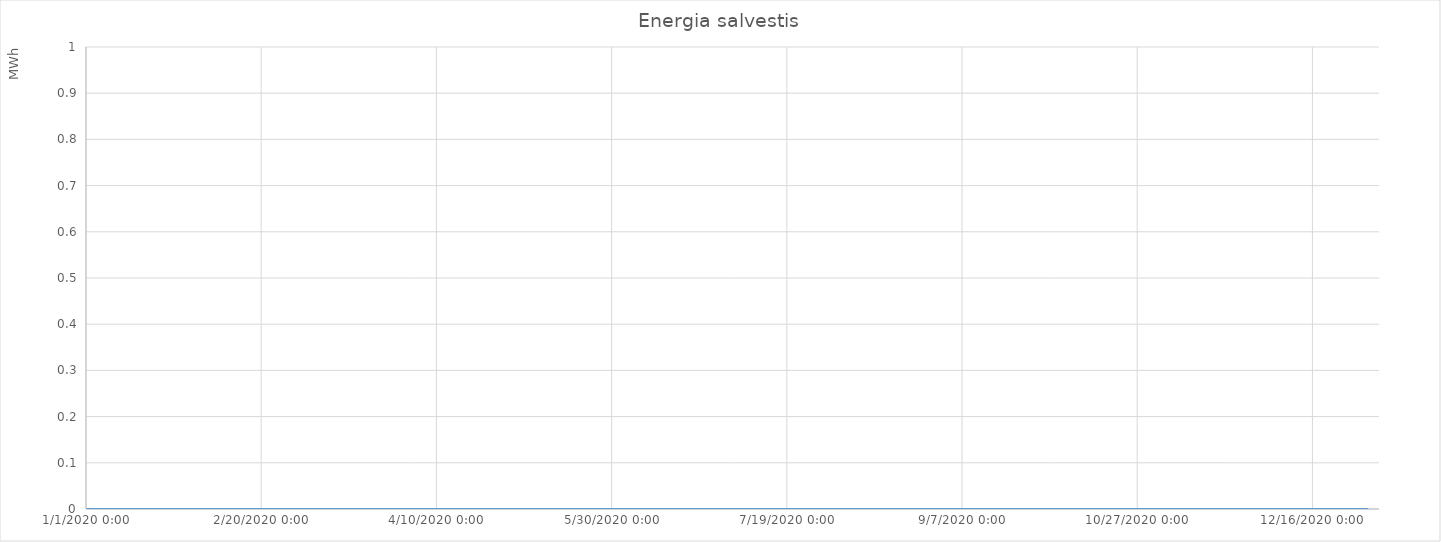
| Category | Series 0 |
|---|---|
| 43831.0 | 0 |
| 43831.041666666664 | 0 |
| 43831.083333333336 | 0 |
| 43831.125 | 0 |
| 43831.166666666664 | 0 |
| 43831.208333333336 | 0 |
| 43831.25 | 0 |
| 43831.291666666664 | 0 |
| 43831.333333333336 | 0 |
| 43831.375 | 0 |
| 43831.416666666664 | 0 |
| 43831.458333333336 | 0 |
| 43831.5 | 0 |
| 43831.541666666664 | 0 |
| 43831.583333333336 | 0 |
| 43831.625 | 0 |
| 43831.666666666664 | 0 |
| 43831.708333333336 | 0 |
| 43831.75 | 0 |
| 43831.791666666664 | 0 |
| 43831.833333333336 | 0 |
| 43831.875 | 0 |
| 43831.916666666664 | 0 |
| 43831.958333333336 | 0 |
| 43832.0 | 0 |
| 43832.041666666664 | 0 |
| 43832.083333333336 | 0 |
| 43832.125 | 0 |
| 43832.166666666664 | 0 |
| 43832.208333333336 | 0 |
| 43832.25 | 0 |
| 43832.291666666664 | 0 |
| 43832.333333333336 | 0 |
| 43832.375 | 0 |
| 43832.416666666664 | 0 |
| 43832.458333333336 | 0 |
| 43832.5 | 0 |
| 43832.541666666664 | 0 |
| 43832.583333333336 | 0 |
| 43832.625 | 0 |
| 43832.666666666664 | 0 |
| 43832.708333333336 | 0 |
| 43832.75 | 0 |
| 43832.791666666664 | 0 |
| 43832.833333333336 | 0 |
| 43832.875 | 0 |
| 43832.916666666664 | 0 |
| 43832.958333333336 | 0 |
| 43833.0 | 0 |
| 43833.041666666664 | 0 |
| 43833.083333333336 | 0 |
| 43833.125 | 0 |
| 43833.166666666664 | 0 |
| 43833.208333333336 | 0 |
| 43833.25 | 0 |
| 43833.291666666664 | 0 |
| 43833.333333333336 | 0 |
| 43833.375 | 0 |
| 43833.416666666664 | 0 |
| 43833.458333333336 | 0 |
| 43833.5 | 0 |
| 43833.541666666664 | 0 |
| 43833.583333333336 | 0 |
| 43833.625 | 0 |
| 43833.666666666664 | 0 |
| 43833.708333333336 | 0 |
| 43833.75 | 0 |
| 43833.791666666664 | 0 |
| 43833.833333333336 | 0 |
| 43833.875 | 0 |
| 43833.916666666664 | 0 |
| 43833.958333333336 | 0 |
| 43834.0 | 0 |
| 43834.041666666664 | 0 |
| 43834.083333333336 | 0 |
| 43834.125 | 0 |
| 43834.166666666664 | 0 |
| 43834.208333333336 | 0 |
| 43834.25 | 0 |
| 43834.291666666664 | 0 |
| 43834.333333333336 | 0 |
| 43834.375 | 0 |
| 43834.416666666664 | 0 |
| 43834.458333333336 | 0 |
| 43834.5 | 0 |
| 43834.541666666664 | 0 |
| 43834.583333333336 | 0 |
| 43834.625 | 0 |
| 43834.666666666664 | 0 |
| 43834.708333333336 | 0 |
| 43834.75 | 0 |
| 43834.791666666664 | 0 |
| 43834.833333333336 | 0 |
| 43834.875 | 0 |
| 43834.916666666664 | 0 |
| 43834.958333333336 | 0 |
| 43835.0 | 0 |
| 43835.041666666664 | 0 |
| 43835.083333333336 | 0 |
| 43835.125 | 0 |
| 43835.166666666664 | 0 |
| 43835.208333333336 | 0 |
| 43835.25 | 0 |
| 43835.291666666664 | 0 |
| 43835.333333333336 | 0 |
| 43835.375 | 0 |
| 43835.416666666664 | 0 |
| 43835.458333333336 | 0 |
| 43835.5 | 0 |
| 43835.541666666664 | 0 |
| 43835.583333333336 | 0 |
| 43835.625 | 0 |
| 43835.666666666664 | 0 |
| 43835.708333333336 | 0 |
| 43835.75 | 0 |
| 43835.791666666664 | 0 |
| 43835.833333333336 | 0 |
| 43835.875 | 0 |
| 43835.916666666664 | 0 |
| 43835.958333333336 | 0 |
| 43836.0 | 0 |
| 43836.041666666664 | 0 |
| 43836.083333333336 | 0 |
| 43836.125 | 0 |
| 43836.166666666664 | 0 |
| 43836.208333333336 | 0 |
| 43836.25 | 0 |
| 43836.291666666664 | 0 |
| 43836.333333333336 | 0 |
| 43836.375 | 0 |
| 43836.416666666664 | 0 |
| 43836.458333333336 | 0 |
| 43836.5 | 0 |
| 43836.541666666664 | 0 |
| 43836.583333333336 | 0 |
| 43836.625 | 0 |
| 43836.666666666664 | 0 |
| 43836.708333333336 | 0 |
| 43836.75 | 0 |
| 43836.791666666664 | 0 |
| 43836.833333333336 | 0 |
| 43836.875 | 0 |
| 43836.916666666664 | 0 |
| 43836.958333333336 | 0 |
| 43837.0 | 0 |
| 43837.041666666664 | 0 |
| 43837.083333333336 | 0 |
| 43837.125 | 0 |
| 43837.166666666664 | 0 |
| 43837.208333333336 | 0 |
| 43837.25 | 0 |
| 43837.291666666664 | 0 |
| 43837.333333333336 | 0 |
| 43837.375 | 0 |
| 43837.416666666664 | 0 |
| 43837.458333333336 | 0 |
| 43837.5 | 0 |
| 43837.541666666664 | 0 |
| 43837.583333333336 | 0 |
| 43837.625 | 0 |
| 43837.666666666664 | 0 |
| 43837.708333333336 | 0 |
| 43837.75 | 0 |
| 43837.791666666664 | 0 |
| 43837.833333333336 | 0 |
| 43837.875 | 0 |
| 43837.916666666664 | 0 |
| 43837.958333333336 | 0 |
| 43838.0 | 0 |
| 43838.041666666664 | 0 |
| 43838.083333333336 | 0 |
| 43838.125 | 0 |
| 43838.166666666664 | 0 |
| 43838.208333333336 | 0 |
| 43838.25 | 0 |
| 43838.291666666664 | 0 |
| 43838.333333333336 | 0 |
| 43838.375 | 0 |
| 43838.416666666664 | 0 |
| 43838.458333333336 | 0 |
| 43838.5 | 0 |
| 43838.541666666664 | 0 |
| 43838.583333333336 | 0 |
| 43838.625 | 0 |
| 43838.666666666664 | 0 |
| 43838.708333333336 | 0 |
| 43838.75 | 0 |
| 43838.791666666664 | 0 |
| 43838.833333333336 | 0 |
| 43838.875 | 0 |
| 43838.916666666664 | 0 |
| 43838.958333333336 | 0 |
| 43839.0 | 0 |
| 43839.041666666664 | 0 |
| 43839.083333333336 | 0 |
| 43839.125 | 0 |
| 43839.166666666664 | 0 |
| 43839.208333333336 | 0 |
| 43839.25 | 0 |
| 43839.291666666664 | 0 |
| 43839.333333333336 | 0 |
| 43839.375 | 0 |
| 43839.416666666664 | 0 |
| 43839.458333333336 | 0 |
| 43839.5 | 0 |
| 43839.541666666664 | 0 |
| 43839.583333333336 | 0 |
| 43839.625 | 0 |
| 43839.666666666664 | 0 |
| 43839.708333333336 | 0 |
| 43839.75 | 0 |
| 43839.791666666664 | 0 |
| 43839.833333333336 | 0 |
| 43839.875 | 0 |
| 43839.916666666664 | 0 |
| 43839.958333333336 | 0 |
| 43840.0 | 0 |
| 43840.041666666664 | 0 |
| 43840.083333333336 | 0 |
| 43840.125 | 0 |
| 43840.166666666664 | 0 |
| 43840.208333333336 | 0 |
| 43840.25 | 0 |
| 43840.291666666664 | 0 |
| 43840.333333333336 | 0 |
| 43840.375 | 0 |
| 43840.416666666664 | 0 |
| 43840.458333333336 | 0 |
| 43840.5 | 0 |
| 43840.541666666664 | 0 |
| 43840.583333333336 | 0 |
| 43840.625 | 0 |
| 43840.666666666664 | 0 |
| 43840.708333333336 | 0 |
| 43840.75 | 0 |
| 43840.791666666664 | 0 |
| 43840.833333333336 | 0 |
| 43840.875 | 0 |
| 43840.916666666664 | 0 |
| 43840.958333333336 | 0 |
| 43841.0 | 0 |
| 43841.041666666664 | 0 |
| 43841.083333333336 | 0 |
| 43841.125 | 0 |
| 43841.166666666664 | 0 |
| 43841.208333333336 | 0 |
| 43841.25 | 0 |
| 43841.291666666664 | 0 |
| 43841.333333333336 | 0 |
| 43841.375 | 0 |
| 43841.416666666664 | 0 |
| 43841.458333333336 | 0 |
| 43841.5 | 0 |
| 43841.541666666664 | 0 |
| 43841.583333333336 | 0 |
| 43841.625 | 0 |
| 43841.666666666664 | 0 |
| 43841.708333333336 | 0 |
| 43841.75 | 0 |
| 43841.791666666664 | 0 |
| 43841.833333333336 | 0 |
| 43841.875 | 0 |
| 43841.916666666664 | 0 |
| 43841.958333333336 | 0 |
| 43842.0 | 0 |
| 43842.041666666664 | 0 |
| 43842.083333333336 | 0 |
| 43842.125 | 0 |
| 43842.166666666664 | 0 |
| 43842.208333333336 | 0 |
| 43842.25 | 0 |
| 43842.291666666664 | 0 |
| 43842.333333333336 | 0 |
| 43842.375 | 0 |
| 43842.416666666664 | 0 |
| 43842.458333333336 | 0 |
| 43842.5 | 0 |
| 43842.541666666664 | 0 |
| 43842.583333333336 | 0 |
| 43842.625 | 0 |
| 43842.666666666664 | 0 |
| 43842.708333333336 | 0 |
| 43842.75 | 0 |
| 43842.791666666664 | 0 |
| 43842.833333333336 | 0 |
| 43842.875 | 0 |
| 43842.916666666664 | 0 |
| 43842.958333333336 | 0 |
| 43843.0 | 0 |
| 43843.041666666664 | 0 |
| 43843.083333333336 | 0 |
| 43843.125 | 0 |
| 43843.166666666664 | 0 |
| 43843.208333333336 | 0 |
| 43843.25 | 0 |
| 43843.291666666664 | 0 |
| 43843.333333333336 | 0 |
| 43843.375 | 0 |
| 43843.416666666664 | 0 |
| 43843.458333333336 | 0 |
| 43843.5 | 0 |
| 43843.541666666664 | 0 |
| 43843.583333333336 | 0 |
| 43843.625 | 0 |
| 43843.666666666664 | 0 |
| 43843.708333333336 | 0 |
| 43843.75 | 0 |
| 43843.791666666664 | 0 |
| 43843.833333333336 | 0 |
| 43843.875 | 0 |
| 43843.916666666664 | 0 |
| 43843.958333333336 | 0 |
| 43844.0 | 0 |
| 43844.041666666664 | 0 |
| 43844.083333333336 | 0 |
| 43844.125 | 0 |
| 43844.166666666664 | 0 |
| 43844.208333333336 | 0 |
| 43844.25 | 0 |
| 43844.291666666664 | 0 |
| 43844.333333333336 | 0 |
| 43844.375 | 0 |
| 43844.416666666664 | 0 |
| 43844.458333333336 | 0 |
| 43844.5 | 0 |
| 43844.541666666664 | 0 |
| 43844.583333333336 | 0 |
| 43844.625 | 0 |
| 43844.666666666664 | 0 |
| 43844.708333333336 | 0 |
| 43844.75 | 0 |
| 43844.791666666664 | 0 |
| 43844.833333333336 | 0 |
| 43844.875 | 0 |
| 43844.916666666664 | 0 |
| 43844.958333333336 | 0 |
| 43845.0 | 0 |
| 43845.041666666664 | 0 |
| 43845.083333333336 | 0 |
| 43845.125 | 0 |
| 43845.166666666664 | 0 |
| 43845.208333333336 | 0 |
| 43845.25 | 0 |
| 43845.291666666664 | 0 |
| 43845.333333333336 | 0 |
| 43845.375 | 0 |
| 43845.416666666664 | 0 |
| 43845.458333333336 | 0 |
| 43845.5 | 0 |
| 43845.541666666664 | 0 |
| 43845.583333333336 | 0 |
| 43845.625 | 0 |
| 43845.666666666664 | 0 |
| 43845.708333333336 | 0 |
| 43845.75 | 0 |
| 43845.791666666664 | 0 |
| 43845.833333333336 | 0 |
| 43845.875 | 0 |
| 43845.916666666664 | 0 |
| 43845.958333333336 | 0 |
| 43846.0 | 0 |
| 43846.041666666664 | 0 |
| 43846.083333333336 | 0 |
| 43846.125 | 0 |
| 43846.166666666664 | 0 |
| 43846.208333333336 | 0 |
| 43846.25 | 0 |
| 43846.291666666664 | 0 |
| 43846.333333333336 | 0 |
| 43846.375 | 0 |
| 43846.416666666664 | 0 |
| 43846.458333333336 | 0 |
| 43846.5 | 0 |
| 43846.541666666664 | 0 |
| 43846.583333333336 | 0 |
| 43846.625 | 0 |
| 43846.666666666664 | 0 |
| 43846.708333333336 | 0 |
| 43846.75 | 0 |
| 43846.791666666664 | 0 |
| 43846.833333333336 | 0 |
| 43846.875 | 0 |
| 43846.916666666664 | 0 |
| 43846.958333333336 | 0 |
| 43847.0 | 0 |
| 43847.041666666664 | 0 |
| 43847.083333333336 | 0 |
| 43847.125 | 0 |
| 43847.166666666664 | 0 |
| 43847.208333333336 | 0 |
| 43847.25 | 0 |
| 43847.291666666664 | 0 |
| 43847.333333333336 | 0 |
| 43847.375 | 0 |
| 43847.416666666664 | 0 |
| 43847.458333333336 | 0 |
| 43847.5 | 0 |
| 43847.541666666664 | 0 |
| 43847.583333333336 | 0 |
| 43847.625 | 0 |
| 43847.666666666664 | 0 |
| 43847.708333333336 | 0 |
| 43847.75 | 0 |
| 43847.791666666664 | 0 |
| 43847.833333333336 | 0 |
| 43847.875 | 0 |
| 43847.916666666664 | 0 |
| 43847.958333333336 | 0 |
| 43848.0 | 0 |
| 43848.041666666664 | 0 |
| 43848.083333333336 | 0 |
| 43848.125 | 0 |
| 43848.166666666664 | 0 |
| 43848.208333333336 | 0 |
| 43848.25 | 0 |
| 43848.291666666664 | 0 |
| 43848.333333333336 | 0 |
| 43848.375 | 0 |
| 43848.416666666664 | 0 |
| 43848.458333333336 | 0 |
| 43848.5 | 0 |
| 43848.541666666664 | 0 |
| 43848.583333333336 | 0 |
| 43848.625 | 0 |
| 43848.666666666664 | 0 |
| 43848.708333333336 | 0 |
| 43848.75 | 0 |
| 43848.791666666664 | 0 |
| 43848.833333333336 | 0 |
| 43848.875 | 0 |
| 43848.916666666664 | 0 |
| 43848.958333333336 | 0 |
| 43849.0 | 0 |
| 43849.041666666664 | 0 |
| 43849.083333333336 | 0 |
| 43849.125 | 0 |
| 43849.166666666664 | 0 |
| 43849.208333333336 | 0 |
| 43849.25 | 0 |
| 43849.291666666664 | 0 |
| 43849.333333333336 | 0 |
| 43849.375 | 0 |
| 43849.416666666664 | 0 |
| 43849.458333333336 | 0 |
| 43849.5 | 0 |
| 43849.541666666664 | 0 |
| 43849.583333333336 | 0 |
| 43849.625 | 0 |
| 43849.666666666664 | 0 |
| 43849.708333333336 | 0 |
| 43849.75 | 0 |
| 43849.791666666664 | 0 |
| 43849.833333333336 | 0 |
| 43849.875 | 0 |
| 43849.916666666664 | 0 |
| 43849.958333333336 | 0 |
| 43850.0 | 0 |
| 43850.041666666664 | 0 |
| 43850.083333333336 | 0 |
| 43850.125 | 0 |
| 43850.166666666664 | 0 |
| 43850.208333333336 | 0 |
| 43850.25 | 0 |
| 43850.291666666664 | 0 |
| 43850.333333333336 | 0 |
| 43850.375 | 0 |
| 43850.416666666664 | 0 |
| 43850.458333333336 | 0 |
| 43850.5 | 0 |
| 43850.541666666664 | 0 |
| 43850.583333333336 | 0 |
| 43850.625 | 0 |
| 43850.666666666664 | 0 |
| 43850.708333333336 | 0 |
| 43850.75 | 0 |
| 43850.791666666664 | 0 |
| 43850.833333333336 | 0 |
| 43850.875 | 0 |
| 43850.916666666664 | 0 |
| 43850.958333333336 | 0 |
| 43851.0 | 0 |
| 43851.041666666664 | 0 |
| 43851.083333333336 | 0 |
| 43851.125 | 0 |
| 43851.166666666664 | 0 |
| 43851.208333333336 | 0 |
| 43851.25 | 0 |
| 43851.291666666664 | 0 |
| 43851.333333333336 | 0 |
| 43851.375 | 0 |
| 43851.416666666664 | 0 |
| 43851.458333333336 | 0 |
| 43851.5 | 0 |
| 43851.541666666664 | 0 |
| 43851.583333333336 | 0 |
| 43851.625 | 0 |
| 43851.666666666664 | 0 |
| 43851.708333333336 | 0 |
| 43851.75 | 0 |
| 43851.791666666664 | 0 |
| 43851.833333333336 | 0 |
| 43851.875 | 0 |
| 43851.916666666664 | 0 |
| 43851.958333333336 | 0 |
| 43852.0 | 0 |
| 43852.041666666664 | 0 |
| 43852.083333333336 | 0 |
| 43852.125 | 0 |
| 43852.166666666664 | 0 |
| 43852.208333333336 | 0 |
| 43852.25 | 0 |
| 43852.291666666664 | 0 |
| 43852.333333333336 | 0 |
| 43852.375 | 0 |
| 43852.416666666664 | 0 |
| 43852.458333333336 | 0 |
| 43852.5 | 0 |
| 43852.541666666664 | 0 |
| 43852.583333333336 | 0 |
| 43852.625 | 0 |
| 43852.666666666664 | 0 |
| 43852.708333333336 | 0 |
| 43852.75 | 0 |
| 43852.791666666664 | 0 |
| 43852.833333333336 | 0 |
| 43852.875 | 0 |
| 43852.916666666664 | 0 |
| 43852.958333333336 | 0 |
| 43853.0 | 0 |
| 43853.041666666664 | 0 |
| 43853.083333333336 | 0 |
| 43853.125 | 0 |
| 43853.166666666664 | 0 |
| 43853.208333333336 | 0 |
| 43853.25 | 0 |
| 43853.291666666664 | 0 |
| 43853.333333333336 | 0 |
| 43853.375 | 0 |
| 43853.416666666664 | 0 |
| 43853.458333333336 | 0 |
| 43853.5 | 0 |
| 43853.541666666664 | 0 |
| 43853.583333333336 | 0 |
| 43853.625 | 0 |
| 43853.666666666664 | 0 |
| 43853.708333333336 | 0 |
| 43853.75 | 0 |
| 43853.791666666664 | 0 |
| 43853.833333333336 | 0 |
| 43853.875 | 0 |
| 43853.916666666664 | 0 |
| 43853.958333333336 | 0 |
| 43854.0 | 0 |
| 43854.041666666664 | 0 |
| 43854.083333333336 | 0 |
| 43854.125 | 0 |
| 43854.166666666664 | 0 |
| 43854.208333333336 | 0 |
| 43854.25 | 0 |
| 43854.291666666664 | 0 |
| 43854.333333333336 | 0 |
| 43854.375 | 0 |
| 43854.416666666664 | 0 |
| 43854.458333333336 | 0 |
| 43854.5 | 0 |
| 43854.541666666664 | 0 |
| 43854.583333333336 | 0 |
| 43854.625 | 0 |
| 43854.666666666664 | 0 |
| 43854.708333333336 | 0 |
| 43854.75 | 0 |
| 43854.791666666664 | 0 |
| 43854.833333333336 | 0 |
| 43854.875 | 0 |
| 43854.916666666664 | 0 |
| 43854.958333333336 | 0 |
| 43855.0 | 0 |
| 43855.041666666664 | 0 |
| 43855.083333333336 | 0 |
| 43855.125 | 0 |
| 43855.166666666664 | 0 |
| 43855.208333333336 | 0 |
| 43855.25 | 0 |
| 43855.291666666664 | 0 |
| 43855.333333333336 | 0 |
| 43855.375 | 0 |
| 43855.416666666664 | 0 |
| 43855.458333333336 | 0 |
| 43855.5 | 0 |
| 43855.541666666664 | 0 |
| 43855.583333333336 | 0 |
| 43855.625 | 0 |
| 43855.666666666664 | 0 |
| 43855.708333333336 | 0 |
| 43855.75 | 0 |
| 43855.791666666664 | 0 |
| 43855.833333333336 | 0 |
| 43855.875 | 0 |
| 43855.916666666664 | 0 |
| 43855.958333333336 | 0 |
| 43856.0 | 0 |
| 43856.041666666664 | 0 |
| 43856.083333333336 | 0 |
| 43856.125 | 0 |
| 43856.166666666664 | 0 |
| 43856.208333333336 | 0 |
| 43856.25 | 0 |
| 43856.291666666664 | 0 |
| 43856.333333333336 | 0 |
| 43856.375 | 0 |
| 43856.416666666664 | 0 |
| 43856.458333333336 | 0 |
| 43856.5 | 0 |
| 43856.541666666664 | 0 |
| 43856.583333333336 | 0 |
| 43856.625 | 0 |
| 43856.666666666664 | 0 |
| 43856.708333333336 | 0 |
| 43856.75 | 0 |
| 43856.791666666664 | 0 |
| 43856.833333333336 | 0 |
| 43856.875 | 0 |
| 43856.916666666664 | 0 |
| 43856.958333333336 | 0 |
| 43857.0 | 0 |
| 43857.041666666664 | 0 |
| 43857.083333333336 | 0 |
| 43857.125 | 0 |
| 43857.166666666664 | 0 |
| 43857.208333333336 | 0 |
| 43857.25 | 0 |
| 43857.291666666664 | 0 |
| 43857.333333333336 | 0 |
| 43857.375 | 0 |
| 43857.416666666664 | 0 |
| 43857.458333333336 | 0 |
| 43857.5 | 0 |
| 43857.541666666664 | 0 |
| 43857.583333333336 | 0 |
| 43857.625 | 0 |
| 43857.666666666664 | 0 |
| 43857.708333333336 | 0 |
| 43857.75 | 0 |
| 43857.791666666664 | 0 |
| 43857.833333333336 | 0 |
| 43857.875 | 0 |
| 43857.916666666664 | 0 |
| 43857.958333333336 | 0 |
| 43858.0 | 0 |
| 43858.041666666664 | 0 |
| 43858.083333333336 | 0 |
| 43858.125 | 0 |
| 43858.166666666664 | 0 |
| 43858.208333333336 | 0 |
| 43858.25 | 0 |
| 43858.291666666664 | 0 |
| 43858.333333333336 | 0 |
| 43858.375 | 0 |
| 43858.416666666664 | 0 |
| 43858.458333333336 | 0 |
| 43858.5 | 0 |
| 43858.541666666664 | 0 |
| 43858.583333333336 | 0 |
| 43858.625 | 0 |
| 43858.666666666664 | 0 |
| 43858.708333333336 | 0 |
| 43858.75 | 0 |
| 43858.791666666664 | 0 |
| 43858.833333333336 | 0 |
| 43858.875 | 0 |
| 43858.916666666664 | 0 |
| 43858.958333333336 | 0 |
| 43859.0 | 0 |
| 43859.041666666664 | 0 |
| 43859.083333333336 | 0 |
| 43859.125 | 0 |
| 43859.166666666664 | 0 |
| 43859.208333333336 | 0 |
| 43859.25 | 0 |
| 43859.291666666664 | 0 |
| 43859.333333333336 | 0 |
| 43859.375 | 0 |
| 43859.416666666664 | 0 |
| 43859.458333333336 | 0 |
| 43859.5 | 0 |
| 43859.541666666664 | 0 |
| 43859.583333333336 | 0 |
| 43859.625 | 0 |
| 43859.666666666664 | 0 |
| 43859.708333333336 | 0 |
| 43859.75 | 0 |
| 43859.791666666664 | 0 |
| 43859.833333333336 | 0 |
| 43859.875 | 0 |
| 43859.916666666664 | 0 |
| 43859.958333333336 | 0 |
| 43860.0 | 0 |
| 43860.041666666664 | 0 |
| 43860.083333333336 | 0 |
| 43860.125 | 0 |
| 43860.166666666664 | 0 |
| 43860.208333333336 | 0 |
| 43860.25 | 0 |
| 43860.291666666664 | 0 |
| 43860.333333333336 | 0 |
| 43860.375 | 0 |
| 43860.416666666664 | 0 |
| 43860.458333333336 | 0 |
| 43860.5 | 0 |
| 43860.541666666664 | 0 |
| 43860.583333333336 | 0 |
| 43860.625 | 0 |
| 43860.666666666664 | 0 |
| 43860.708333333336 | 0 |
| 43860.75 | 0 |
| 43860.791666666664 | 0 |
| 43860.833333333336 | 0 |
| 43860.875 | 0 |
| 43860.916666666664 | 0 |
| 43860.958333333336 | 0 |
| 43861.0 | 0 |
| 43861.041666666664 | 0 |
| 43861.083333333336 | 0 |
| 43861.125 | 0 |
| 43861.166666666664 | 0 |
| 43861.208333333336 | 0 |
| 43861.25 | 0 |
| 43861.291666666664 | 0 |
| 43861.333333333336 | 0 |
| 43861.375 | 0 |
| 43861.416666666664 | 0 |
| 43861.458333333336 | 0 |
| 43861.5 | 0 |
| 43861.541666666664 | 0 |
| 43861.583333333336 | 0 |
| 43861.625 | 0 |
| 43861.666666666664 | 0 |
| 43861.708333333336 | 0 |
| 43861.75 | 0 |
| 43861.791666666664 | 0 |
| 43861.833333333336 | 0 |
| 43861.875 | 0 |
| 43861.916666666664 | 0 |
| 43861.958333333336 | 0 |
| 43862.0 | 0 |
| 43862.041666666664 | 0 |
| 43862.083333333336 | 0 |
| 43862.125 | 0 |
| 43862.166666666664 | 0 |
| 43862.208333333336 | 0 |
| 43862.25 | 0 |
| 43862.291666666664 | 0 |
| 43862.333333333336 | 0 |
| 43862.375 | 0 |
| 43862.416666666664 | 0 |
| 43862.458333333336 | 0 |
| 43862.5 | 0 |
| 43862.541666666664 | 0 |
| 43862.583333333336 | 0 |
| 43862.625 | 0 |
| 43862.666666666664 | 0 |
| 43862.708333333336 | 0 |
| 43862.75 | 0 |
| 43862.791666666664 | 0 |
| 43862.833333333336 | 0 |
| 43862.875 | 0 |
| 43862.916666666664 | 0 |
| 43862.958333333336 | 0 |
| 43863.0 | 0 |
| 43863.041666666664 | 0 |
| 43863.083333333336 | 0 |
| 43863.125 | 0 |
| 43863.166666666664 | 0 |
| 43863.208333333336 | 0 |
| 43863.25 | 0 |
| 43863.291666666664 | 0 |
| 43863.333333333336 | 0 |
| 43863.375 | 0 |
| 43863.416666666664 | 0 |
| 43863.458333333336 | 0 |
| 43863.5 | 0 |
| 43863.541666666664 | 0 |
| 43863.583333333336 | 0 |
| 43863.625 | 0 |
| 43863.666666666664 | 0 |
| 43863.708333333336 | 0 |
| 43863.75 | 0 |
| 43863.791666666664 | 0 |
| 43863.833333333336 | 0 |
| 43863.875 | 0 |
| 43863.916666666664 | 0 |
| 43863.958333333336 | 0 |
| 43864.0 | 0 |
| 43864.041666666664 | 0 |
| 43864.083333333336 | 0 |
| 43864.125 | 0 |
| 43864.166666666664 | 0 |
| 43864.208333333336 | 0 |
| 43864.25 | 0 |
| 43864.291666666664 | 0 |
| 43864.333333333336 | 0 |
| 43864.375 | 0 |
| 43864.416666666664 | 0 |
| 43864.458333333336 | 0 |
| 43864.5 | 0 |
| 43864.541666666664 | 0 |
| 43864.583333333336 | 0 |
| 43864.625 | 0 |
| 43864.666666666664 | 0 |
| 43864.708333333336 | 0 |
| 43864.75 | 0 |
| 43864.791666666664 | 0 |
| 43864.833333333336 | 0 |
| 43864.875 | 0 |
| 43864.916666666664 | 0 |
| 43864.958333333336 | 0 |
| 43865.0 | 0 |
| 43865.041666666664 | 0 |
| 43865.083333333336 | 0 |
| 43865.125 | 0 |
| 43865.166666666664 | 0 |
| 43865.208333333336 | 0 |
| 43865.25 | 0 |
| 43865.291666666664 | 0 |
| 43865.333333333336 | 0 |
| 43865.375 | 0 |
| 43865.416666666664 | 0 |
| 43865.458333333336 | 0 |
| 43865.5 | 0 |
| 43865.541666666664 | 0 |
| 43865.583333333336 | 0 |
| 43865.625 | 0 |
| 43865.666666666664 | 0 |
| 43865.708333333336 | 0 |
| 43865.75 | 0 |
| 43865.791666666664 | 0 |
| 43865.833333333336 | 0 |
| 43865.875 | 0 |
| 43865.916666666664 | 0 |
| 43865.958333333336 | 0 |
| 43866.0 | 0 |
| 43866.041666666664 | 0 |
| 43866.083333333336 | 0 |
| 43866.125 | 0 |
| 43866.166666666664 | 0 |
| 43866.208333333336 | 0 |
| 43866.25 | 0 |
| 43866.291666666664 | 0 |
| 43866.333333333336 | 0 |
| 43866.375 | 0 |
| 43866.416666666664 | 0 |
| 43866.458333333336 | 0 |
| 43866.5 | 0 |
| 43866.541666666664 | 0 |
| 43866.583333333336 | 0 |
| 43866.625 | 0 |
| 43866.666666666664 | 0 |
| 43866.708333333336 | 0 |
| 43866.75 | 0 |
| 43866.791666666664 | 0 |
| 43866.833333333336 | 0 |
| 43866.875 | 0 |
| 43866.916666666664 | 0 |
| 43866.958333333336 | 0 |
| 43867.0 | 0 |
| 43867.041666666664 | 0 |
| 43867.083333333336 | 0 |
| 43867.125 | 0 |
| 43867.166666666664 | 0 |
| 43867.208333333336 | 0 |
| 43867.25 | 0 |
| 43867.291666666664 | 0 |
| 43867.333333333336 | 0 |
| 43867.375 | 0 |
| 43867.416666666664 | 0 |
| 43867.458333333336 | 0 |
| 43867.5 | 0 |
| 43867.541666666664 | 0 |
| 43867.583333333336 | 0 |
| 43867.625 | 0 |
| 43867.666666666664 | 0 |
| 43867.708333333336 | 0 |
| 43867.75 | 0 |
| 43867.791666666664 | 0 |
| 43867.833333333336 | 0 |
| 43867.875 | 0 |
| 43867.916666666664 | 0 |
| 43867.958333333336 | 0 |
| 43868.0 | 0 |
| 43868.041666666664 | 0 |
| 43868.083333333336 | 0 |
| 43868.125 | 0 |
| 43868.166666666664 | 0 |
| 43868.208333333336 | 0 |
| 43868.25 | 0 |
| 43868.291666666664 | 0 |
| 43868.333333333336 | 0 |
| 43868.375 | 0 |
| 43868.416666666664 | 0 |
| 43868.458333333336 | 0 |
| 43868.5 | 0 |
| 43868.541666666664 | 0 |
| 43868.583333333336 | 0 |
| 43868.625 | 0 |
| 43868.666666666664 | 0 |
| 43868.708333333336 | 0 |
| 43868.75 | 0 |
| 43868.791666666664 | 0 |
| 43868.833333333336 | 0 |
| 43868.875 | 0 |
| 43868.916666666664 | 0 |
| 43868.958333333336 | 0 |
| 43869.0 | 0 |
| 43869.041666666664 | 0 |
| 43869.083333333336 | 0 |
| 43869.125 | 0 |
| 43869.166666666664 | 0 |
| 43869.208333333336 | 0 |
| 43869.25 | 0 |
| 43869.291666666664 | 0 |
| 43869.333333333336 | 0 |
| 43869.375 | 0 |
| 43869.416666666664 | 0 |
| 43869.458333333336 | 0 |
| 43869.5 | 0 |
| 43869.541666666664 | 0 |
| 43869.583333333336 | 0 |
| 43869.625 | 0 |
| 43869.666666666664 | 0 |
| 43869.708333333336 | 0 |
| 43869.75 | 0 |
| 43869.791666666664 | 0 |
| 43869.833333333336 | 0 |
| 43869.875 | 0 |
| 43869.916666666664 | 0 |
| 43869.958333333336 | 0 |
| 43870.0 | 0 |
| 43870.041666666664 | 0 |
| 43870.083333333336 | 0 |
| 43870.125 | 0 |
| 43870.166666666664 | 0 |
| 43870.208333333336 | 0 |
| 43870.25 | 0 |
| 43870.291666666664 | 0 |
| 43870.333333333336 | 0 |
| 43870.375 | 0 |
| 43870.416666666664 | 0 |
| 43870.458333333336 | 0 |
| 43870.5 | 0 |
| 43870.541666666664 | 0 |
| 43870.583333333336 | 0 |
| 43870.625 | 0 |
| 43870.666666666664 | 0 |
| 43870.708333333336 | 0 |
| 43870.75 | 0 |
| 43870.791666666664 | 0 |
| 43870.833333333336 | 0 |
| 43870.875 | 0 |
| 43870.916666666664 | 0 |
| 43870.958333333336 | 0 |
| 43871.0 | 0 |
| 43871.041666666664 | 0 |
| 43871.083333333336 | 0 |
| 43871.125 | 0 |
| 43871.166666666664 | 0 |
| 43871.208333333336 | 0 |
| 43871.25 | 0 |
| 43871.291666666664 | 0 |
| 43871.333333333336 | 0 |
| 43871.375 | 0 |
| 43871.416666666664 | 0 |
| 43871.458333333336 | 0 |
| 43871.5 | 0 |
| 43871.541666666664 | 0 |
| 43871.583333333336 | 0 |
| 43871.625 | 0 |
| 43871.666666666664 | 0 |
| 43871.708333333336 | 0 |
| 43871.75 | 0 |
| 43871.791666666664 | 0 |
| 43871.833333333336 | 0 |
| 43871.875 | 0 |
| 43871.916666666664 | 0 |
| 43871.958333333336 | 0 |
| 43872.0 | 0 |
| 43872.041666666664 | 0 |
| 43872.083333333336 | 0 |
| 43872.125 | 0 |
| 43872.166666666664 | 0 |
| 43872.208333333336 | 0 |
| 43872.25 | 0 |
| 43872.291666666664 | 0 |
| 43872.333333333336 | 0 |
| 43872.375 | 0 |
| 43872.416666666664 | 0 |
| 43872.458333333336 | 0 |
| 43872.5 | 0 |
| 43872.541666666664 | 0 |
| 43872.583333333336 | 0 |
| 43872.625 | 0 |
| 43872.666666666664 | 0 |
| 43872.708333333336 | 0 |
| 43872.75 | 0 |
| 43872.791666666664 | 0 |
| 43872.833333333336 | 0 |
| 43872.875 | 0 |
| 43872.916666666664 | 0 |
| 43872.958333333336 | 0 |
| 43873.0 | 0 |
| 43873.041666666664 | 0 |
| 43873.083333333336 | 0 |
| 43873.125 | 0 |
| 43873.166666666664 | 0 |
| 43873.208333333336 | 0 |
| 43873.25 | 0 |
| 43873.291666666664 | 0 |
| 43873.333333333336 | 0 |
| 43873.375 | 0 |
| 43873.416666666664 | 0 |
| 43873.458333333336 | 0 |
| 43873.5 | 0 |
| 43873.541666666664 | 0 |
| 43873.583333333336 | 0 |
| 43873.625 | 0 |
| 43873.666666666664 | 0 |
| 43873.708333333336 | 0 |
| 43873.75 | 0 |
| 43873.791666666664 | 0 |
| 43873.833333333336 | 0 |
| 43873.875 | 0 |
| 43873.916666666664 | 0 |
| 43873.958333333336 | 0 |
| 43874.0 | 0 |
| 43874.041666666664 | 0 |
| 43874.083333333336 | 0 |
| 43874.125 | 0 |
| 43874.166666666664 | 0 |
| 43874.208333333336 | 0 |
| 43874.25 | 0 |
| 43874.291666666664 | 0 |
| 43874.333333333336 | 0 |
| 43874.375 | 0 |
| 43874.416666666664 | 0 |
| 43874.458333333336 | 0 |
| 43874.5 | 0 |
| 43874.541666666664 | 0 |
| 43874.583333333336 | 0 |
| 43874.625 | 0 |
| 43874.666666666664 | 0 |
| 43874.708333333336 | 0 |
| 43874.75 | 0 |
| 43874.791666666664 | 0 |
| 43874.833333333336 | 0 |
| 43874.875 | 0 |
| 43874.916666666664 | 0 |
| 43874.958333333336 | 0 |
| 43875.0 | 0 |
| 43875.041666666664 | 0 |
| 43875.083333333336 | 0 |
| 43875.125 | 0 |
| 43875.166666666664 | 0 |
| 43875.208333333336 | 0 |
| 43875.25 | 0 |
| 43875.291666666664 | 0 |
| 43875.333333333336 | 0 |
| 43875.375 | 0 |
| 43875.416666666664 | 0 |
| 43875.458333333336 | 0 |
| 43875.5 | 0 |
| 43875.541666666664 | 0 |
| 43875.583333333336 | 0 |
| 43875.625 | 0 |
| 43875.666666666664 | 0 |
| 43875.708333333336 | 0 |
| 43875.75 | 0 |
| 43875.791666666664 | 0 |
| 43875.833333333336 | 0 |
| 43875.875 | 0 |
| 43875.916666666664 | 0 |
| 43875.958333333336 | 0 |
| 43876.0 | 0 |
| 43876.041666666664 | 0 |
| 43876.083333333336 | 0 |
| 43876.125 | 0 |
| 43876.166666666664 | 0 |
| 43876.208333333336 | 0 |
| 43876.25 | 0 |
| 43876.291666666664 | 0 |
| 43876.333333333336 | 0 |
| 43876.375 | 0 |
| 43876.416666666664 | 0 |
| 43876.458333333336 | 0 |
| 43876.5 | 0 |
| 43876.541666666664 | 0 |
| 43876.583333333336 | 0 |
| 43876.625 | 0 |
| 43876.666666666664 | 0 |
| 43876.708333333336 | 0 |
| 43876.75 | 0 |
| 43876.791666666664 | 0 |
| 43876.833333333336 | 0 |
| 43876.875 | 0 |
| 43876.916666666664 | 0 |
| 43876.958333333336 | 0 |
| 43877.0 | 0 |
| 43877.041666666664 | 0 |
| 43877.083333333336 | 0 |
| 43877.125 | 0 |
| 43877.166666666664 | 0 |
| 43877.208333333336 | 0 |
| 43877.25 | 0 |
| 43877.291666666664 | 0 |
| 43877.333333333336 | 0 |
| 43877.375 | 0 |
| 43877.416666666664 | 0 |
| 43877.458333333336 | 0 |
| 43877.5 | 0 |
| 43877.541666666664 | 0 |
| 43877.583333333336 | 0 |
| 43877.625 | 0 |
| 43877.666666666664 | 0 |
| 43877.708333333336 | 0 |
| 43877.75 | 0 |
| 43877.791666666664 | 0 |
| 43877.833333333336 | 0 |
| 43877.875 | 0 |
| 43877.916666666664 | 0 |
| 43877.958333333336 | 0 |
| 43878.0 | 0 |
| 43878.041666666664 | 0 |
| 43878.083333333336 | 0 |
| 43878.125 | 0 |
| 43878.166666666664 | 0 |
| 43878.208333333336 | 0 |
| 43878.25 | 0 |
| 43878.291666666664 | 0 |
| 43878.333333333336 | 0 |
| 43878.375 | 0 |
| 43878.416666666664 | 0 |
| 43878.458333333336 | 0 |
| 43878.5 | 0 |
| 43878.541666666664 | 0 |
| 43878.583333333336 | 0 |
| 43878.625 | 0 |
| 43878.666666666664 | 0 |
| 43878.708333333336 | 0 |
| 43878.75 | 0 |
| 43878.791666666664 | 0 |
| 43878.833333333336 | 0 |
| 43878.875 | 0 |
| 43878.916666666664 | 0 |
| 43878.958333333336 | 0 |
| 43879.0 | 0 |
| 43879.041666666664 | 0 |
| 43879.083333333336 | 0 |
| 43879.125 | 0 |
| 43879.166666666664 | 0 |
| 43879.208333333336 | 0 |
| 43879.25 | 0 |
| 43879.291666666664 | 0 |
| 43879.333333333336 | 0 |
| 43879.375 | 0 |
| 43879.416666666664 | 0 |
| 43879.458333333336 | 0 |
| 43879.5 | 0 |
| 43879.541666666664 | 0 |
| 43879.583333333336 | 0 |
| 43879.625 | 0 |
| 43879.666666666664 | 0 |
| 43879.708333333336 | 0 |
| 43879.75 | 0 |
| 43879.791666666664 | 0 |
| 43879.833333333336 | 0 |
| 43879.875 | 0 |
| 43879.916666666664 | 0 |
| 43879.958333333336 | 0 |
| 43880.0 | 0 |
| 43880.041666666664 | 0 |
| 43880.083333333336 | 0 |
| 43880.125 | 0 |
| 43880.166666666664 | 0 |
| 43880.208333333336 | 0 |
| 43880.25 | 0 |
| 43880.291666666664 | 0 |
| 43880.333333333336 | 0 |
| 43880.375 | 0 |
| 43880.416666666664 | 0 |
| 43880.458333333336 | 0 |
| 43880.5 | 0 |
| 43880.541666666664 | 0 |
| 43880.583333333336 | 0 |
| 43880.625 | 0 |
| 43880.666666666664 | 0 |
| 43880.708333333336 | 0 |
| 43880.75 | 0 |
| 43880.791666666664 | 0 |
| 43880.833333333336 | 0 |
| 43880.875 | 0 |
| 43880.916666666664 | 0 |
| 43880.958333333336 | 0 |
| 43881.0 | 0 |
| 43881.041666666664 | 0 |
| 43881.083333333336 | 0 |
| 43881.125 | 0 |
| 43881.166666666664 | 0 |
| 43881.208333333336 | 0 |
| 43881.25 | 0 |
| 43881.291666666664 | 0 |
| 43881.333333333336 | 0 |
| 43881.375 | 0 |
| 43881.416666666664 | 0 |
| 43881.458333333336 | 0 |
| 43881.5 | 0 |
| 43881.541666666664 | 0 |
| 43881.583333333336 | 0 |
| 43881.625 | 0 |
| 43881.666666666664 | 0 |
| 43881.708333333336 | 0 |
| 43881.75 | 0 |
| 43881.791666666664 | 0 |
| 43881.833333333336 | 0 |
| 43881.875 | 0 |
| 43881.916666666664 | 0 |
| 43881.958333333336 | 0 |
| 43882.0 | 0 |
| 43882.041666666664 | 0 |
| 43882.083333333336 | 0 |
| 43882.125 | 0 |
| 43882.166666666664 | 0 |
| 43882.208333333336 | 0 |
| 43882.25 | 0 |
| 43882.291666666664 | 0 |
| 43882.333333333336 | 0 |
| 43882.375 | 0 |
| 43882.416666666664 | 0 |
| 43882.458333333336 | 0 |
| 43882.5 | 0 |
| 43882.541666666664 | 0 |
| 43882.583333333336 | 0 |
| 43882.625 | 0 |
| 43882.666666666664 | 0 |
| 43882.708333333336 | 0 |
| 43882.75 | 0 |
| 43882.791666666664 | 0 |
| 43882.833333333336 | 0 |
| 43882.875 | 0 |
| 43882.916666666664 | 0 |
| 43882.958333333336 | 0 |
| 43883.0 | 0 |
| 43883.041666666664 | 0 |
| 43883.083333333336 | 0 |
| 43883.125 | 0 |
| 43883.166666666664 | 0 |
| 43883.208333333336 | 0 |
| 43883.25 | 0 |
| 43883.291666666664 | 0 |
| 43883.333333333336 | 0 |
| 43883.375 | 0 |
| 43883.416666666664 | 0 |
| 43883.458333333336 | 0 |
| 43883.5 | 0 |
| 43883.541666666664 | 0 |
| 43883.583333333336 | 0 |
| 43883.625 | 0 |
| 43883.666666666664 | 0 |
| 43883.708333333336 | 0 |
| 43883.75 | 0 |
| 43883.791666666664 | 0 |
| 43883.833333333336 | 0 |
| 43883.875 | 0 |
| 43883.916666666664 | 0 |
| 43883.958333333336 | 0 |
| 43884.0 | 0 |
| 43884.041666666664 | 0 |
| 43884.083333333336 | 0 |
| 43884.125 | 0 |
| 43884.166666666664 | 0 |
| 43884.208333333336 | 0 |
| 43884.25 | 0 |
| 43884.291666666664 | 0 |
| 43884.333333333336 | 0 |
| 43884.375 | 0 |
| 43884.416666666664 | 0 |
| 43884.458333333336 | 0 |
| 43884.5 | 0 |
| 43884.541666666664 | 0 |
| 43884.583333333336 | 0 |
| 43884.625 | 0 |
| 43884.666666666664 | 0 |
| 43884.708333333336 | 0 |
| 43884.75 | 0 |
| 43884.791666666664 | 0 |
| 43884.833333333336 | 0 |
| 43884.875 | 0 |
| 43884.916666666664 | 0 |
| 43884.958333333336 | 0 |
| 43885.0 | 0 |
| 43885.041666666664 | 0 |
| 43885.083333333336 | 0 |
| 43885.125 | 0 |
| 43885.166666666664 | 0 |
| 43885.208333333336 | 0 |
| 43885.25 | 0 |
| 43885.291666666664 | 0 |
| 43885.333333333336 | 0 |
| 43885.375 | 0 |
| 43885.416666666664 | 0 |
| 43885.458333333336 | 0 |
| 43885.5 | 0 |
| 43885.541666666664 | 0 |
| 43885.583333333336 | 0 |
| 43885.625 | 0 |
| 43885.666666666664 | 0 |
| 43885.708333333336 | 0 |
| 43885.75 | 0 |
| 43885.791666666664 | 0 |
| 43885.833333333336 | 0 |
| 43885.875 | 0 |
| 43885.916666666664 | 0 |
| 43885.958333333336 | 0 |
| 43886.0 | 0 |
| 43886.041666666664 | 0 |
| 43886.083333333336 | 0 |
| 43886.125 | 0 |
| 43886.166666666664 | 0 |
| 43886.208333333336 | 0 |
| 43886.25 | 0 |
| 43886.291666666664 | 0 |
| 43886.333333333336 | 0 |
| 43886.375 | 0 |
| 43886.416666666664 | 0 |
| 43886.458333333336 | 0 |
| 43886.5 | 0 |
| 43886.541666666664 | 0 |
| 43886.583333333336 | 0 |
| 43886.625 | 0 |
| 43886.666666666664 | 0 |
| 43886.708333333336 | 0 |
| 43886.75 | 0 |
| 43886.791666666664 | 0 |
| 43886.833333333336 | 0 |
| 43886.875 | 0 |
| 43886.916666666664 | 0 |
| 43886.958333333336 | 0 |
| 43887.0 | 0 |
| 43887.041666666664 | 0 |
| 43887.083333333336 | 0 |
| 43887.125 | 0 |
| 43887.166666666664 | 0 |
| 43887.208333333336 | 0 |
| 43887.25 | 0 |
| 43887.291666666664 | 0 |
| 43887.333333333336 | 0 |
| 43887.375 | 0 |
| 43887.416666666664 | 0 |
| 43887.458333333336 | 0 |
| 43887.5 | 0 |
| 43887.541666666664 | 0 |
| 43887.583333333336 | 0 |
| 43887.625 | 0 |
| 43887.666666666664 | 0 |
| 43887.708333333336 | 0 |
| 43887.75 | 0 |
| 43887.791666666664 | 0 |
| 43887.833333333336 | 0 |
| 43887.875 | 0 |
| 43887.916666666664 | 0 |
| 43887.958333333336 | 0 |
| 43888.0 | 0 |
| 43888.041666666664 | 0 |
| 43888.083333333336 | 0 |
| 43888.125 | 0 |
| 43888.166666666664 | 0 |
| 43888.208333333336 | 0 |
| 43888.25 | 0 |
| 43888.291666666664 | 0 |
| 43888.333333333336 | 0 |
| 43888.375 | 0 |
| 43888.416666666664 | 0 |
| 43888.458333333336 | 0 |
| 43888.5 | 0 |
| 43888.541666666664 | 0 |
| 43888.583333333336 | 0 |
| 43888.625 | 0 |
| 43888.666666666664 | 0 |
| 43888.708333333336 | 0 |
| 43888.75 | 0 |
| 43888.791666666664 | 0 |
| 43888.833333333336 | 0 |
| 43888.875 | 0 |
| 43888.916666666664 | 0 |
| 43888.958333333336 | 0 |
| 43889.0 | 0 |
| 43889.041666666664 | 0 |
| 43889.083333333336 | 0 |
| 43889.125 | 0 |
| 43889.166666666664 | 0 |
| 43889.208333333336 | 0 |
| 43889.25 | 0 |
| 43889.291666666664 | 0 |
| 43889.333333333336 | 0 |
| 43889.375 | 0 |
| 43889.416666666664 | 0 |
| 43889.458333333336 | 0 |
| 43889.5 | 0 |
| 43889.541666666664 | 0 |
| 43889.583333333336 | 0 |
| 43889.625 | 0 |
| 43889.666666666664 | 0 |
| 43889.708333333336 | 0 |
| 43889.75 | 0 |
| 43889.791666666664 | 0 |
| 43889.833333333336 | 0 |
| 43889.875 | 0 |
| 43889.916666666664 | 0 |
| 43889.958333333336 | 0 |
| 43891.0 | 0 |
| 43891.041666666664 | 0 |
| 43891.083333333336 | 0 |
| 43891.125 | 0 |
| 43891.166666666664 | 0 |
| 43891.208333333336 | 0 |
| 43891.25 | 0 |
| 43891.291666666664 | 0 |
| 43891.333333333336 | 0 |
| 43891.375 | 0 |
| 43891.416666666664 | 0 |
| 43891.458333333336 | 0 |
| 43891.5 | 0 |
| 43891.541666666664 | 0 |
| 43891.583333333336 | 0 |
| 43891.625 | 0 |
| 43891.666666666664 | 0 |
| 43891.708333333336 | 0 |
| 43891.75 | 0 |
| 43891.791666666664 | 0 |
| 43891.833333333336 | 0 |
| 43891.875 | 0 |
| 43891.916666666664 | 0 |
| 43891.958333333336 | 0 |
| 43892.0 | 0 |
| 43892.041666666664 | 0 |
| 43892.083333333336 | 0 |
| 43892.125 | 0 |
| 43892.166666666664 | 0 |
| 43892.208333333336 | 0 |
| 43892.25 | 0 |
| 43892.291666666664 | 0 |
| 43892.333333333336 | 0 |
| 43892.375 | 0 |
| 43892.416666666664 | 0 |
| 43892.458333333336 | 0 |
| 43892.5 | 0 |
| 43892.541666666664 | 0 |
| 43892.583333333336 | 0 |
| 43892.625 | 0 |
| 43892.666666666664 | 0 |
| 43892.708333333336 | 0 |
| 43892.75 | 0 |
| 43892.791666666664 | 0 |
| 43892.833333333336 | 0 |
| 43892.875 | 0 |
| 43892.916666666664 | 0 |
| 43892.958333333336 | 0 |
| 43893.0 | 0 |
| 43893.041666666664 | 0 |
| 43893.083333333336 | 0 |
| 43893.125 | 0 |
| 43893.166666666664 | 0 |
| 43893.208333333336 | 0 |
| 43893.25 | 0 |
| 43893.291666666664 | 0 |
| 43893.333333333336 | 0 |
| 43893.375 | 0 |
| 43893.416666666664 | 0 |
| 43893.458333333336 | 0 |
| 43893.5 | 0 |
| 43893.541666666664 | 0 |
| 43893.583333333336 | 0 |
| 43893.625 | 0 |
| 43893.666666666664 | 0 |
| 43893.708333333336 | 0 |
| 43893.75 | 0 |
| 43893.791666666664 | 0 |
| 43893.833333333336 | 0 |
| 43893.875 | 0 |
| 43893.916666666664 | 0 |
| 43893.958333333336 | 0 |
| 43894.0 | 0 |
| 43894.041666666664 | 0 |
| 43894.083333333336 | 0 |
| 43894.125 | 0 |
| 43894.166666666664 | 0 |
| 43894.208333333336 | 0 |
| 43894.25 | 0 |
| 43894.291666666664 | 0 |
| 43894.333333333336 | 0 |
| 43894.375 | 0 |
| 43894.416666666664 | 0 |
| 43894.458333333336 | 0 |
| 43894.5 | 0 |
| 43894.541666666664 | 0 |
| 43894.583333333336 | 0 |
| 43894.625 | 0 |
| 43894.666666666664 | 0 |
| 43894.708333333336 | 0 |
| 43894.75 | 0 |
| 43894.791666666664 | 0 |
| 43894.833333333336 | 0 |
| 43894.875 | 0 |
| 43894.916666666664 | 0 |
| 43894.958333333336 | 0 |
| 43895.0 | 0 |
| 43895.041666666664 | 0 |
| 43895.083333333336 | 0 |
| 43895.125 | 0 |
| 43895.166666666664 | 0 |
| 43895.208333333336 | 0 |
| 43895.25 | 0 |
| 43895.291666666664 | 0 |
| 43895.333333333336 | 0 |
| 43895.375 | 0 |
| 43895.416666666664 | 0 |
| 43895.458333333336 | 0 |
| 43895.5 | 0 |
| 43895.541666666664 | 0 |
| 43895.583333333336 | 0 |
| 43895.625 | 0 |
| 43895.666666666664 | 0 |
| 43895.708333333336 | 0 |
| 43895.75 | 0 |
| 43895.791666666664 | 0 |
| 43895.833333333336 | 0 |
| 43895.875 | 0 |
| 43895.916666666664 | 0 |
| 43895.958333333336 | 0 |
| 43896.0 | 0 |
| 43896.041666666664 | 0 |
| 43896.083333333336 | 0 |
| 43896.125 | 0 |
| 43896.166666666664 | 0 |
| 43896.208333333336 | 0 |
| 43896.25 | 0 |
| 43896.291666666664 | 0 |
| 43896.333333333336 | 0 |
| 43896.375 | 0 |
| 43896.416666666664 | 0 |
| 43896.458333333336 | 0 |
| 43896.5 | 0 |
| 43896.541666666664 | 0 |
| 43896.583333333336 | 0 |
| 43896.625 | 0 |
| 43896.666666666664 | 0 |
| 43896.708333333336 | 0 |
| 43896.75 | 0 |
| 43896.791666666664 | 0 |
| 43896.833333333336 | 0 |
| 43896.875 | 0 |
| 43896.916666666664 | 0 |
| 43896.958333333336 | 0 |
| 43897.0 | 0 |
| 43897.041666666664 | 0 |
| 43897.083333333336 | 0 |
| 43897.125 | 0 |
| 43897.166666666664 | 0 |
| 43897.208333333336 | 0 |
| 43897.25 | 0 |
| 43897.291666666664 | 0 |
| 43897.333333333336 | 0 |
| 43897.375 | 0 |
| 43897.416666666664 | 0 |
| 43897.458333333336 | 0 |
| 43897.5 | 0 |
| 43897.541666666664 | 0 |
| 43897.583333333336 | 0 |
| 43897.625 | 0 |
| 43897.666666666664 | 0 |
| 43897.708333333336 | 0 |
| 43897.75 | 0 |
| 43897.791666666664 | 0 |
| 43897.833333333336 | 0 |
| 43897.875 | 0 |
| 43897.916666666664 | 0 |
| 43897.958333333336 | 0 |
| 43898.0 | 0 |
| 43898.041666666664 | 0 |
| 43898.083333333336 | 0 |
| 43898.125 | 0 |
| 43898.166666666664 | 0 |
| 43898.208333333336 | 0 |
| 43898.25 | 0 |
| 43898.291666666664 | 0 |
| 43898.333333333336 | 0 |
| 43898.375 | 0 |
| 43898.416666666664 | 0 |
| 43898.458333333336 | 0 |
| 43898.5 | 0 |
| 43898.541666666664 | 0 |
| 43898.583333333336 | 0 |
| 43898.625 | 0 |
| 43898.666666666664 | 0 |
| 43898.708333333336 | 0 |
| 43898.75 | 0 |
| 43898.791666666664 | 0 |
| 43898.833333333336 | 0 |
| 43898.875 | 0 |
| 43898.916666666664 | 0 |
| 43898.958333333336 | 0 |
| 43899.0 | 0 |
| 43899.041666666664 | 0 |
| 43899.083333333336 | 0 |
| 43899.125 | 0 |
| 43899.166666666664 | 0 |
| 43899.208333333336 | 0 |
| 43899.25 | 0 |
| 43899.291666666664 | 0 |
| 43899.333333333336 | 0 |
| 43899.375 | 0 |
| 43899.416666666664 | 0 |
| 43899.458333333336 | 0 |
| 43899.5 | 0 |
| 43899.541666666664 | 0 |
| 43899.583333333336 | 0 |
| 43899.625 | 0 |
| 43899.666666666664 | 0 |
| 43899.708333333336 | 0 |
| 43899.75 | 0 |
| 43899.791666666664 | 0 |
| 43899.833333333336 | 0 |
| 43899.875 | 0 |
| 43899.916666666664 | 0 |
| 43899.958333333336 | 0 |
| 43900.0 | 0 |
| 43900.041666666664 | 0 |
| 43900.083333333336 | 0 |
| 43900.125 | 0 |
| 43900.166666666664 | 0 |
| 43900.208333333336 | 0 |
| 43900.25 | 0 |
| 43900.291666666664 | 0 |
| 43900.333333333336 | 0 |
| 43900.375 | 0 |
| 43900.416666666664 | 0 |
| 43900.458333333336 | 0 |
| 43900.5 | 0 |
| 43900.541666666664 | 0 |
| 43900.583333333336 | 0 |
| 43900.625 | 0 |
| 43900.666666666664 | 0 |
| 43900.708333333336 | 0 |
| 43900.75 | 0 |
| 43900.791666666664 | 0 |
| 43900.833333333336 | 0 |
| 43900.875 | 0 |
| 43900.916666666664 | 0 |
| 43900.958333333336 | 0 |
| 43901.0 | 0 |
| 43901.041666666664 | 0 |
| 43901.083333333336 | 0 |
| 43901.125 | 0 |
| 43901.166666666664 | 0 |
| 43901.208333333336 | 0 |
| 43901.25 | 0 |
| 43901.291666666664 | 0 |
| 43901.333333333336 | 0 |
| 43901.375 | 0 |
| 43901.416666666664 | 0 |
| 43901.458333333336 | 0 |
| 43901.5 | 0 |
| 43901.541666666664 | 0 |
| 43901.583333333336 | 0 |
| 43901.625 | 0 |
| 43901.666666666664 | 0 |
| 43901.708333333336 | 0 |
| 43901.75 | 0 |
| 43901.791666666664 | 0 |
| 43901.833333333336 | 0 |
| 43901.875 | 0 |
| 43901.916666666664 | 0 |
| 43901.958333333336 | 0 |
| 43902.0 | 0 |
| 43902.041666666664 | 0 |
| 43902.083333333336 | 0 |
| 43902.125 | 0 |
| 43902.166666666664 | 0 |
| 43902.208333333336 | 0 |
| 43902.25 | 0 |
| 43902.291666666664 | 0 |
| 43902.333333333336 | 0 |
| 43902.375 | 0 |
| 43902.416666666664 | 0 |
| 43902.458333333336 | 0 |
| 43902.5 | 0 |
| 43902.541666666664 | 0 |
| 43902.583333333336 | 0 |
| 43902.625 | 0 |
| 43902.666666666664 | 0 |
| 43902.708333333336 | 0 |
| 43902.75 | 0 |
| 43902.791666666664 | 0 |
| 43902.833333333336 | 0 |
| 43902.875 | 0 |
| 43902.916666666664 | 0 |
| 43902.958333333336 | 0 |
| 43903.0 | 0 |
| 43903.041666666664 | 0 |
| 43903.083333333336 | 0 |
| 43903.125 | 0 |
| 43903.166666666664 | 0 |
| 43903.208333333336 | 0 |
| 43903.25 | 0 |
| 43903.291666666664 | 0 |
| 43903.333333333336 | 0 |
| 43903.375 | 0 |
| 43903.416666666664 | 0 |
| 43903.458333333336 | 0 |
| 43903.5 | 0 |
| 43903.541666666664 | 0 |
| 43903.583333333336 | 0 |
| 43903.625 | 0 |
| 43903.666666666664 | 0 |
| 43903.708333333336 | 0 |
| 43903.75 | 0 |
| 43903.791666666664 | 0 |
| 43903.833333333336 | 0 |
| 43903.875 | 0 |
| 43903.916666666664 | 0 |
| 43903.958333333336 | 0 |
| 43904.0 | 0 |
| 43904.041666666664 | 0 |
| 43904.083333333336 | 0 |
| 43904.125 | 0 |
| 43904.166666666664 | 0 |
| 43904.208333333336 | 0 |
| 43904.25 | 0 |
| 43904.291666666664 | 0 |
| 43904.333333333336 | 0 |
| 43904.375 | 0 |
| 43904.416666666664 | 0 |
| 43904.458333333336 | 0 |
| 43904.5 | 0 |
| 43904.541666666664 | 0 |
| 43904.583333333336 | 0 |
| 43904.625 | 0 |
| 43904.666666666664 | 0 |
| 43904.708333333336 | 0 |
| 43904.75 | 0 |
| 43904.791666666664 | 0 |
| 43904.833333333336 | 0 |
| 43904.875 | 0 |
| 43904.916666666664 | 0 |
| 43904.958333333336 | 0 |
| 43905.0 | 0 |
| 43905.041666666664 | 0 |
| 43905.083333333336 | 0 |
| 43905.125 | 0 |
| 43905.166666666664 | 0 |
| 43905.208333333336 | 0 |
| 43905.25 | 0 |
| 43905.291666666664 | 0 |
| 43905.333333333336 | 0 |
| 43905.375 | 0 |
| 43905.416666666664 | 0 |
| 43905.458333333336 | 0 |
| 43905.5 | 0 |
| 43905.541666666664 | 0 |
| 43905.583333333336 | 0 |
| 43905.625 | 0 |
| 43905.666666666664 | 0 |
| 43905.708333333336 | 0 |
| 43905.75 | 0 |
| 43905.791666666664 | 0 |
| 43905.833333333336 | 0 |
| 43905.875 | 0 |
| 43905.916666666664 | 0 |
| 43905.958333333336 | 0 |
| 43906.0 | 0 |
| 43906.041666666664 | 0 |
| 43906.083333333336 | 0 |
| 43906.125 | 0 |
| 43906.166666666664 | 0 |
| 43906.208333333336 | 0 |
| 43906.25 | 0 |
| 43906.291666666664 | 0 |
| 43906.333333333336 | 0 |
| 43906.375 | 0 |
| 43906.416666666664 | 0 |
| 43906.458333333336 | 0 |
| 43906.5 | 0 |
| 43906.541666666664 | 0 |
| 43906.583333333336 | 0 |
| 43906.625 | 0 |
| 43906.666666666664 | 0 |
| 43906.708333333336 | 0 |
| 43906.75 | 0 |
| 43906.791666666664 | 0 |
| 43906.833333333336 | 0 |
| 43906.875 | 0 |
| 43906.916666666664 | 0 |
| 43906.958333333336 | 0 |
| 43907.0 | 0 |
| 43907.041666666664 | 0 |
| 43907.083333333336 | 0 |
| 43907.125 | 0 |
| 43907.166666666664 | 0 |
| 43907.208333333336 | 0 |
| 43907.25 | 0 |
| 43907.291666666664 | 0 |
| 43907.333333333336 | 0 |
| 43907.375 | 0 |
| 43907.416666666664 | 0 |
| 43907.458333333336 | 0 |
| 43907.5 | 0 |
| 43907.541666666664 | 0 |
| 43907.583333333336 | 0 |
| 43907.625 | 0 |
| 43907.666666666664 | 0 |
| 43907.708333333336 | 0 |
| 43907.75 | 0 |
| 43907.791666666664 | 0 |
| 43907.833333333336 | 0 |
| 43907.875 | 0 |
| 43907.916666666664 | 0 |
| 43907.958333333336 | 0 |
| 43908.0 | 0 |
| 43908.041666666664 | 0 |
| 43908.083333333336 | 0 |
| 43908.125 | 0 |
| 43908.166666666664 | 0 |
| 43908.208333333336 | 0 |
| 43908.25 | 0 |
| 43908.291666666664 | 0 |
| 43908.333333333336 | 0 |
| 43908.375 | 0 |
| 43908.416666666664 | 0 |
| 43908.458333333336 | 0 |
| 43908.5 | 0 |
| 43908.541666666664 | 0 |
| 43908.583333333336 | 0 |
| 43908.625 | 0 |
| 43908.666666666664 | 0 |
| 43908.708333333336 | 0 |
| 43908.75 | 0 |
| 43908.791666666664 | 0 |
| 43908.833333333336 | 0 |
| 43908.875 | 0 |
| 43908.916666666664 | 0 |
| 43908.958333333336 | 0 |
| 43909.0 | 0 |
| 43909.041666666664 | 0 |
| 43909.083333333336 | 0 |
| 43909.125 | 0 |
| 43909.166666666664 | 0 |
| 43909.208333333336 | 0 |
| 43909.25 | 0 |
| 43909.291666666664 | 0 |
| 43909.333333333336 | 0 |
| 43909.375 | 0 |
| 43909.416666666664 | 0 |
| 43909.458333333336 | 0 |
| 43909.5 | 0 |
| 43909.541666666664 | 0 |
| 43909.583333333336 | 0 |
| 43909.625 | 0 |
| 43909.666666666664 | 0 |
| 43909.708333333336 | 0 |
| 43909.75 | 0 |
| 43909.791666666664 | 0 |
| 43909.833333333336 | 0 |
| 43909.875 | 0 |
| 43909.916666666664 | 0 |
| 43909.958333333336 | 0 |
| 43910.0 | 0 |
| 43910.041666666664 | 0 |
| 43910.083333333336 | 0 |
| 43910.125 | 0 |
| 43910.166666666664 | 0 |
| 43910.208333333336 | 0 |
| 43910.25 | 0 |
| 43910.291666666664 | 0 |
| 43910.333333333336 | 0 |
| 43910.375 | 0 |
| 43910.416666666664 | 0 |
| 43910.458333333336 | 0 |
| 43910.5 | 0 |
| 43910.541666666664 | 0 |
| 43910.583333333336 | 0 |
| 43910.625 | 0 |
| 43910.666666666664 | 0 |
| 43910.708333333336 | 0 |
| 43910.75 | 0 |
| 43910.791666666664 | 0 |
| 43910.833333333336 | 0 |
| 43910.875 | 0 |
| 43910.916666666664 | 0 |
| 43910.958333333336 | 0 |
| 43911.0 | 0 |
| 43911.041666666664 | 0 |
| 43911.083333333336 | 0 |
| 43911.125 | 0 |
| 43911.166666666664 | 0 |
| 43911.208333333336 | 0 |
| 43911.25 | 0 |
| 43911.291666666664 | 0 |
| 43911.333333333336 | 0 |
| 43911.375 | 0 |
| 43911.416666666664 | 0 |
| 43911.458333333336 | 0 |
| 43911.5 | 0 |
| 43911.541666666664 | 0 |
| 43911.583333333336 | 0 |
| 43911.625 | 0 |
| 43911.666666666664 | 0 |
| 43911.708333333336 | 0 |
| 43911.75 | 0 |
| 43911.791666666664 | 0 |
| 43911.833333333336 | 0 |
| 43911.875 | 0 |
| 43911.916666666664 | 0 |
| 43911.958333333336 | 0 |
| 43912.0 | 0 |
| 43912.041666666664 | 0 |
| 43912.083333333336 | 0 |
| 43912.125 | 0 |
| 43912.166666666664 | 0 |
| 43912.208333333336 | 0 |
| 43912.25 | 0 |
| 43912.291666666664 | 0 |
| 43912.333333333336 | 0 |
| 43912.375 | 0 |
| 43912.416666666664 | 0 |
| 43912.458333333336 | 0 |
| 43912.5 | 0 |
| 43912.541666666664 | 0 |
| 43912.583333333336 | 0 |
| 43912.625 | 0 |
| 43912.666666666664 | 0 |
| 43912.708333333336 | 0 |
| 43912.75 | 0 |
| 43912.791666666664 | 0 |
| 43912.833333333336 | 0 |
| 43912.875 | 0 |
| 43912.916666666664 | 0 |
| 43912.958333333336 | 0 |
| 43913.0 | 0 |
| 43913.041666666664 | 0 |
| 43913.083333333336 | 0 |
| 43913.125 | 0 |
| 43913.166666666664 | 0 |
| 43913.208333333336 | 0 |
| 43913.25 | 0 |
| 43913.291666666664 | 0 |
| 43913.333333333336 | 0 |
| 43913.375 | 0 |
| 43913.416666666664 | 0 |
| 43913.458333333336 | 0 |
| 43913.5 | 0 |
| 43913.541666666664 | 0 |
| 43913.583333333336 | 0 |
| 43913.625 | 0 |
| 43913.666666666664 | 0 |
| 43913.708333333336 | 0 |
| 43913.75 | 0 |
| 43913.791666666664 | 0 |
| 43913.833333333336 | 0 |
| 43913.875 | 0 |
| 43913.916666666664 | 0 |
| 43913.958333333336 | 0 |
| 43914.0 | 0 |
| 43914.041666666664 | 0 |
| 43914.083333333336 | 0 |
| 43914.125 | 0 |
| 43914.166666666664 | 0 |
| 43914.208333333336 | 0 |
| 43914.25 | 0 |
| 43914.291666666664 | 0 |
| 43914.333333333336 | 0 |
| 43914.375 | 0 |
| 43914.416666666664 | 0 |
| 43914.458333333336 | 0 |
| 43914.5 | 0 |
| 43914.541666666664 | 0 |
| 43914.583333333336 | 0 |
| 43914.625 | 0 |
| 43914.666666666664 | 0 |
| 43914.708333333336 | 0 |
| 43914.75 | 0 |
| 43914.791666666664 | 0 |
| 43914.833333333336 | 0 |
| 43914.875 | 0 |
| 43914.916666666664 | 0 |
| 43914.958333333336 | 0 |
| 43915.0 | 0 |
| 43915.041666666664 | 0 |
| 43915.083333333336 | 0 |
| 43915.125 | 0 |
| 43915.166666666664 | 0 |
| 43915.208333333336 | 0 |
| 43915.25 | 0 |
| 43915.291666666664 | 0 |
| 43915.333333333336 | 0 |
| 43915.375 | 0 |
| 43915.416666666664 | 0 |
| 43915.458333333336 | 0 |
| 43915.5 | 0 |
| 43915.541666666664 | 0 |
| 43915.583333333336 | 0 |
| 43915.625 | 0 |
| 43915.666666666664 | 0 |
| 43915.708333333336 | 0 |
| 43915.75 | 0 |
| 43915.791666666664 | 0 |
| 43915.833333333336 | 0 |
| 43915.875 | 0 |
| 43915.916666666664 | 0 |
| 43915.958333333336 | 0 |
| 43916.0 | 0 |
| 43916.041666666664 | 0 |
| 43916.083333333336 | 0 |
| 43916.125 | 0 |
| 43916.166666666664 | 0 |
| 43916.208333333336 | 0 |
| 43916.25 | 0 |
| 43916.291666666664 | 0 |
| 43916.333333333336 | 0 |
| 43916.375 | 0 |
| 43916.416666666664 | 0 |
| 43916.458333333336 | 0 |
| 43916.5 | 0 |
| 43916.541666666664 | 0 |
| 43916.583333333336 | 0 |
| 43916.625 | 0 |
| 43916.666666666664 | 0 |
| 43916.708333333336 | 0 |
| 43916.75 | 0 |
| 43916.791666666664 | 0 |
| 43916.833333333336 | 0 |
| 43916.875 | 0 |
| 43916.916666666664 | 0 |
| 43916.958333333336 | 0 |
| 43917.0 | 0 |
| 43917.041666666664 | 0 |
| 43917.083333333336 | 0 |
| 43917.125 | 0 |
| 43917.166666666664 | 0 |
| 43917.208333333336 | 0 |
| 43917.25 | 0 |
| 43917.291666666664 | 0 |
| 43917.333333333336 | 0 |
| 43917.375 | 0 |
| 43917.416666666664 | 0 |
| 43917.458333333336 | 0 |
| 43917.5 | 0 |
| 43917.541666666664 | 0 |
| 43917.583333333336 | 0 |
| 43917.625 | 0 |
| 43917.666666666664 | 0 |
| 43917.708333333336 | 0 |
| 43917.75 | 0 |
| 43917.791666666664 | 0 |
| 43917.833333333336 | 0 |
| 43917.875 | 0 |
| 43917.916666666664 | 0 |
| 43917.958333333336 | 0 |
| 43918.0 | 0 |
| 43918.041666666664 | 0 |
| 43918.083333333336 | 0 |
| 43918.125 | 0 |
| 43918.166666666664 | 0 |
| 43918.208333333336 | 0 |
| 43918.25 | 0 |
| 43918.291666666664 | 0 |
| 43918.333333333336 | 0 |
| 43918.375 | 0 |
| 43918.416666666664 | 0 |
| 43918.458333333336 | 0 |
| 43918.5 | 0 |
| 43918.541666666664 | 0 |
| 43918.583333333336 | 0 |
| 43918.625 | 0 |
| 43918.666666666664 | 0 |
| 43918.708333333336 | 0 |
| 43918.75 | 0 |
| 43918.791666666664 | 0 |
| 43918.833333333336 | 0 |
| 43918.875 | 0 |
| 43918.916666666664 | 0 |
| 43918.958333333336 | 0 |
| 43919.0 | 0 |
| 43919.041666666664 | 0 |
| 43919.083333333336 | 0 |
| 43919.166666666664 | 0 |
| 43919.208333333336 | 0 |
| 43919.25 | 0 |
| 43919.291666666664 | 0 |
| 43919.333333333336 | 0 |
| 43919.375 | 0 |
| 43919.416666666664 | 0 |
| 43919.458333333336 | 0 |
| 43919.5 | 0 |
| 43919.541666666664 | 0 |
| 43919.583333333336 | 0 |
| 43919.625 | 0 |
| 43919.666666666664 | 0 |
| 43919.708333333336 | 0 |
| 43919.75 | 0 |
| 43919.791666666664 | 0 |
| 43919.833333333336 | 0 |
| 43919.875 | 0 |
| 43919.916666666664 | 0 |
| 43919.958333333336 | 0 |
| 43920.0 | 0 |
| 43920.041666666664 | 0 |
| 43920.083333333336 | 0 |
| 43920.125 | 0 |
| 43920.166666666664 | 0 |
| 43920.208333333336 | 0 |
| 43920.25 | 0 |
| 43920.291666666664 | 0 |
| 43920.333333333336 | 0 |
| 43920.375 | 0 |
| 43920.416666666664 | 0 |
| 43920.458333333336 | 0 |
| 43920.5 | 0 |
| 43920.541666666664 | 0 |
| 43920.583333333336 | 0 |
| 43920.625 | 0 |
| 43920.666666666664 | 0 |
| 43920.708333333336 | 0 |
| 43920.75 | 0 |
| 43920.791666666664 | 0 |
| 43920.833333333336 | 0 |
| 43920.875 | 0 |
| 43920.916666666664 | 0 |
| 43920.958333333336 | 0 |
| 43921.0 | 0 |
| 43921.041666666664 | 0 |
| 43921.083333333336 | 0 |
| 43921.125 | 0 |
| 43921.166666666664 | 0 |
| 43921.208333333336 | 0 |
| 43921.25 | 0 |
| 43921.291666666664 | 0 |
| 43921.333333333336 | 0 |
| 43921.375 | 0 |
| 43921.416666666664 | 0 |
| 43921.458333333336 | 0 |
| 43921.5 | 0 |
| 43921.541666666664 | 0 |
| 43921.583333333336 | 0 |
| 43921.625 | 0 |
| 43921.666666666664 | 0 |
| 43921.708333333336 | 0 |
| 43921.75 | 0 |
| 43921.791666666664 | 0 |
| 43921.833333333336 | 0 |
| 43921.875 | 0 |
| 43921.916666666664 | 0 |
| 43921.958333333336 | 0 |
| 43922.0 | 0 |
| 43922.041666666664 | 0 |
| 43922.083333333336 | 0 |
| 43922.125 | 0 |
| 43922.166666666664 | 0 |
| 43922.208333333336 | 0 |
| 43922.25 | 0 |
| 43922.291666666664 | 0 |
| 43922.333333333336 | 0 |
| 43922.375 | 0 |
| 43922.416666666664 | 0 |
| 43922.458333333336 | 0 |
| 43922.5 | 0 |
| 43922.541666666664 | 0 |
| 43922.583333333336 | 0 |
| 43922.625 | 0 |
| 43922.666666666664 | 0 |
| 43922.708333333336 | 0 |
| 43922.75 | 0 |
| 43922.791666666664 | 0 |
| 43922.833333333336 | 0 |
| 43922.875 | 0 |
| 43922.916666666664 | 0 |
| 43922.958333333336 | 0 |
| 43923.0 | 0 |
| 43923.041666666664 | 0 |
| 43923.083333333336 | 0 |
| 43923.125 | 0 |
| 43923.166666666664 | 0 |
| 43923.208333333336 | 0 |
| 43923.25 | 0 |
| 43923.291666666664 | 0 |
| 43923.333333333336 | 0 |
| 43923.375 | 0 |
| 43923.416666666664 | 0 |
| 43923.458333333336 | 0 |
| 43923.5 | 0 |
| 43923.541666666664 | 0 |
| 43923.583333333336 | 0 |
| 43923.625 | 0 |
| 43923.666666666664 | 0 |
| 43923.708333333336 | 0 |
| 43923.75 | 0 |
| 43923.791666666664 | 0 |
| 43923.833333333336 | 0 |
| 43923.875 | 0 |
| 43923.916666666664 | 0 |
| 43923.958333333336 | 0 |
| 43924.0 | 0 |
| 43924.041666666664 | 0 |
| 43924.083333333336 | 0 |
| 43924.125 | 0 |
| 43924.166666666664 | 0 |
| 43924.208333333336 | 0 |
| 43924.25 | 0 |
| 43924.291666666664 | 0 |
| 43924.333333333336 | 0 |
| 43924.375 | 0 |
| 43924.416666666664 | 0 |
| 43924.458333333336 | 0 |
| 43924.5 | 0 |
| 43924.541666666664 | 0 |
| 43924.583333333336 | 0 |
| 43924.625 | 0 |
| 43924.666666666664 | 0 |
| 43924.708333333336 | 0 |
| 43924.75 | 0 |
| 43924.791666666664 | 0 |
| 43924.833333333336 | 0 |
| 43924.875 | 0 |
| 43924.916666666664 | 0 |
| 43924.958333333336 | 0 |
| 43925.0 | 0 |
| 43925.041666666664 | 0 |
| 43925.083333333336 | 0 |
| 43925.125 | 0 |
| 43925.166666666664 | 0 |
| 43925.208333333336 | 0 |
| 43925.25 | 0 |
| 43925.291666666664 | 0 |
| 43925.333333333336 | 0 |
| 43925.375 | 0 |
| 43925.416666666664 | 0 |
| 43925.458333333336 | 0 |
| 43925.5 | 0 |
| 43925.541666666664 | 0 |
| 43925.583333333336 | 0 |
| 43925.625 | 0 |
| 43925.666666666664 | 0 |
| 43925.708333333336 | 0 |
| 43925.75 | 0 |
| 43925.791666666664 | 0 |
| 43925.833333333336 | 0 |
| 43925.875 | 0 |
| 43925.916666666664 | 0 |
| 43925.958333333336 | 0 |
| 43926.0 | 0 |
| 43926.041666666664 | 0 |
| 43926.083333333336 | 0 |
| 43926.125 | 0 |
| 43926.166666666664 | 0 |
| 43926.208333333336 | 0 |
| 43926.25 | 0 |
| 43926.291666666664 | 0 |
| 43926.333333333336 | 0 |
| 43926.375 | 0 |
| 43926.416666666664 | 0 |
| 43926.458333333336 | 0 |
| 43926.5 | 0 |
| 43926.541666666664 | 0 |
| 43926.583333333336 | 0 |
| 43926.625 | 0 |
| 43926.666666666664 | 0 |
| 43926.708333333336 | 0 |
| 43926.75 | 0 |
| 43926.791666666664 | 0 |
| 43926.833333333336 | 0 |
| 43926.875 | 0 |
| 43926.916666666664 | 0 |
| 43926.958333333336 | 0 |
| 43927.0 | 0 |
| 43927.041666666664 | 0 |
| 43927.083333333336 | 0 |
| 43927.125 | 0 |
| 43927.166666666664 | 0 |
| 43927.208333333336 | 0 |
| 43927.25 | 0 |
| 43927.291666666664 | 0 |
| 43927.333333333336 | 0 |
| 43927.375 | 0 |
| 43927.416666666664 | 0 |
| 43927.458333333336 | 0 |
| 43927.5 | 0 |
| 43927.541666666664 | 0 |
| 43927.583333333336 | 0 |
| 43927.625 | 0 |
| 43927.666666666664 | 0 |
| 43927.708333333336 | 0 |
| 43927.75 | 0 |
| 43927.791666666664 | 0 |
| 43927.833333333336 | 0 |
| 43927.875 | 0 |
| 43927.916666666664 | 0 |
| 43927.958333333336 | 0 |
| 43928.0 | 0 |
| 43928.041666666664 | 0 |
| 43928.083333333336 | 0 |
| 43928.125 | 0 |
| 43928.166666666664 | 0 |
| 43928.208333333336 | 0 |
| 43928.25 | 0 |
| 43928.291666666664 | 0 |
| 43928.333333333336 | 0 |
| 43928.375 | 0 |
| 43928.416666666664 | 0 |
| 43928.458333333336 | 0 |
| 43928.5 | 0 |
| 43928.541666666664 | 0 |
| 43928.583333333336 | 0 |
| 43928.625 | 0 |
| 43928.666666666664 | 0 |
| 43928.708333333336 | 0 |
| 43928.75 | 0 |
| 43928.791666666664 | 0 |
| 43928.833333333336 | 0 |
| 43928.875 | 0 |
| 43928.916666666664 | 0 |
| 43928.958333333336 | 0 |
| 43929.0 | 0 |
| 43929.041666666664 | 0 |
| 43929.083333333336 | 0 |
| 43929.125 | 0 |
| 43929.166666666664 | 0 |
| 43929.208333333336 | 0 |
| 43929.25 | 0 |
| 43929.291666666664 | 0 |
| 43929.333333333336 | 0 |
| 43929.375 | 0 |
| 43929.416666666664 | 0 |
| 43929.458333333336 | 0 |
| 43929.5 | 0 |
| 43929.541666666664 | 0 |
| 43929.583333333336 | 0 |
| 43929.625 | 0 |
| 43929.666666666664 | 0 |
| 43929.708333333336 | 0 |
| 43929.75 | 0 |
| 43929.791666666664 | 0 |
| 43929.833333333336 | 0 |
| 43929.875 | 0 |
| 43929.916666666664 | 0 |
| 43929.958333333336 | 0 |
| 43930.0 | 0 |
| 43930.041666666664 | 0 |
| 43930.083333333336 | 0 |
| 43930.125 | 0 |
| 43930.166666666664 | 0 |
| 43930.208333333336 | 0 |
| 43930.25 | 0 |
| 43930.291666666664 | 0 |
| 43930.333333333336 | 0 |
| 43930.375 | 0 |
| 43930.416666666664 | 0 |
| 43930.458333333336 | 0 |
| 43930.5 | 0 |
| 43930.541666666664 | 0 |
| 43930.583333333336 | 0 |
| 43930.625 | 0 |
| 43930.666666666664 | 0 |
| 43930.708333333336 | 0 |
| 43930.75 | 0 |
| 43930.791666666664 | 0 |
| 43930.833333333336 | 0 |
| 43930.875 | 0 |
| 43930.916666666664 | 0 |
| 43930.958333333336 | 0 |
| 43931.0 | 0 |
| 43931.041666666664 | 0 |
| 43931.083333333336 | 0 |
| 43931.125 | 0 |
| 43931.166666666664 | 0 |
| 43931.208333333336 | 0 |
| 43931.25 | 0 |
| 43931.291666666664 | 0 |
| 43931.333333333336 | 0 |
| 43931.375 | 0 |
| 43931.416666666664 | 0 |
| 43931.458333333336 | 0 |
| 43931.5 | 0 |
| 43931.541666666664 | 0 |
| 43931.583333333336 | 0 |
| 43931.625 | 0 |
| 43931.666666666664 | 0 |
| 43931.708333333336 | 0 |
| 43931.75 | 0 |
| 43931.791666666664 | 0 |
| 43931.833333333336 | 0 |
| 43931.875 | 0 |
| 43931.916666666664 | 0 |
| 43931.958333333336 | 0 |
| 43932.0 | 0 |
| 43932.041666666664 | 0 |
| 43932.083333333336 | 0 |
| 43932.125 | 0 |
| 43932.166666666664 | 0 |
| 43932.208333333336 | 0 |
| 43932.25 | 0 |
| 43932.291666666664 | 0 |
| 43932.333333333336 | 0 |
| 43932.375 | 0 |
| 43932.416666666664 | 0 |
| 43932.458333333336 | 0 |
| 43932.5 | 0 |
| 43932.541666666664 | 0 |
| 43932.583333333336 | 0 |
| 43932.625 | 0 |
| 43932.666666666664 | 0 |
| 43932.708333333336 | 0 |
| 43932.75 | 0 |
| 43932.791666666664 | 0 |
| 43932.833333333336 | 0 |
| 43932.875 | 0 |
| 43932.916666666664 | 0 |
| 43932.958333333336 | 0 |
| 43933.0 | 0 |
| 43933.041666666664 | 0 |
| 43933.083333333336 | 0 |
| 43933.125 | 0 |
| 43933.166666666664 | 0 |
| 43933.208333333336 | 0 |
| 43933.25 | 0 |
| 43933.291666666664 | 0 |
| 43933.333333333336 | 0 |
| 43933.375 | 0 |
| 43933.416666666664 | 0 |
| 43933.458333333336 | 0 |
| 43933.5 | 0 |
| 43933.541666666664 | 0 |
| 43933.583333333336 | 0 |
| 43933.625 | 0 |
| 43933.666666666664 | 0 |
| 43933.708333333336 | 0 |
| 43933.75 | 0 |
| 43933.791666666664 | 0 |
| 43933.833333333336 | 0 |
| 43933.875 | 0 |
| 43933.916666666664 | 0 |
| 43933.958333333336 | 0 |
| 43934.0 | 0 |
| 43934.041666666664 | 0 |
| 43934.083333333336 | 0 |
| 43934.125 | 0 |
| 43934.166666666664 | 0 |
| 43934.208333333336 | 0 |
| 43934.25 | 0 |
| 43934.291666666664 | 0 |
| 43934.333333333336 | 0 |
| 43934.375 | 0 |
| 43934.416666666664 | 0 |
| 43934.458333333336 | 0 |
| 43934.5 | 0 |
| 43934.541666666664 | 0 |
| 43934.583333333336 | 0 |
| 43934.625 | 0 |
| 43934.666666666664 | 0 |
| 43934.708333333336 | 0 |
| 43934.75 | 0 |
| 43934.791666666664 | 0 |
| 43934.833333333336 | 0 |
| 43934.875 | 0 |
| 43934.916666666664 | 0 |
| 43934.958333333336 | 0 |
| 43935.0 | 0 |
| 43935.041666666664 | 0 |
| 43935.083333333336 | 0 |
| 43935.125 | 0 |
| 43935.166666666664 | 0 |
| 43935.208333333336 | 0 |
| 43935.25 | 0 |
| 43935.291666666664 | 0 |
| 43935.333333333336 | 0 |
| 43935.375 | 0 |
| 43935.416666666664 | 0 |
| 43935.458333333336 | 0 |
| 43935.5 | 0 |
| 43935.541666666664 | 0 |
| 43935.583333333336 | 0 |
| 43935.625 | 0 |
| 43935.666666666664 | 0 |
| 43935.708333333336 | 0 |
| 43935.75 | 0 |
| 43935.791666666664 | 0 |
| 43935.833333333336 | 0 |
| 43935.875 | 0 |
| 43935.916666666664 | 0 |
| 43935.958333333336 | 0 |
| 43936.0 | 0 |
| 43936.041666666664 | 0 |
| 43936.083333333336 | 0 |
| 43936.125 | 0 |
| 43936.166666666664 | 0 |
| 43936.208333333336 | 0 |
| 43936.25 | 0 |
| 43936.291666666664 | 0 |
| 43936.333333333336 | 0 |
| 43936.375 | 0 |
| 43936.416666666664 | 0 |
| 43936.458333333336 | 0 |
| 43936.5 | 0 |
| 43936.541666666664 | 0 |
| 43936.583333333336 | 0 |
| 43936.625 | 0 |
| 43936.666666666664 | 0 |
| 43936.708333333336 | 0 |
| 43936.75 | 0 |
| 43936.791666666664 | 0 |
| 43936.833333333336 | 0 |
| 43936.875 | 0 |
| 43936.916666666664 | 0 |
| 43936.958333333336 | 0 |
| 43937.0 | 0 |
| 43937.041666666664 | 0 |
| 43937.083333333336 | 0 |
| 43937.125 | 0 |
| 43937.166666666664 | 0 |
| 43937.208333333336 | 0 |
| 43937.25 | 0 |
| 43937.291666666664 | 0 |
| 43937.333333333336 | 0 |
| 43937.375 | 0 |
| 43937.416666666664 | 0 |
| 43937.458333333336 | 0 |
| 43937.5 | 0 |
| 43937.541666666664 | 0 |
| 43937.583333333336 | 0 |
| 43937.625 | 0 |
| 43937.666666666664 | 0 |
| 43937.708333333336 | 0 |
| 43937.75 | 0 |
| 43937.791666666664 | 0 |
| 43937.833333333336 | 0 |
| 43937.875 | 0 |
| 43937.916666666664 | 0 |
| 43937.958333333336 | 0 |
| 43938.0 | 0 |
| 43938.041666666664 | 0 |
| 43938.083333333336 | 0 |
| 43938.125 | 0 |
| 43938.166666666664 | 0 |
| 43938.208333333336 | 0 |
| 43938.25 | 0 |
| 43938.291666666664 | 0 |
| 43938.333333333336 | 0 |
| 43938.375 | 0 |
| 43938.416666666664 | 0 |
| 43938.458333333336 | 0 |
| 43938.5 | 0 |
| 43938.541666666664 | 0 |
| 43938.583333333336 | 0 |
| 43938.625 | 0 |
| 43938.666666666664 | 0 |
| 43938.708333333336 | 0 |
| 43938.75 | 0 |
| 43938.791666666664 | 0 |
| 43938.833333333336 | 0 |
| 43938.875 | 0 |
| 43938.916666666664 | 0 |
| 43938.958333333336 | 0 |
| 43939.0 | 0 |
| 43939.041666666664 | 0 |
| 43939.083333333336 | 0 |
| 43939.125 | 0 |
| 43939.166666666664 | 0 |
| 43939.208333333336 | 0 |
| 43939.25 | 0 |
| 43939.291666666664 | 0 |
| 43939.333333333336 | 0 |
| 43939.375 | 0 |
| 43939.416666666664 | 0 |
| 43939.458333333336 | 0 |
| 43939.5 | 0 |
| 43939.541666666664 | 0 |
| 43939.583333333336 | 0 |
| 43939.625 | 0 |
| 43939.666666666664 | 0 |
| 43939.708333333336 | 0 |
| 43939.75 | 0 |
| 43939.791666666664 | 0 |
| 43939.833333333336 | 0 |
| 43939.875 | 0 |
| 43939.916666666664 | 0 |
| 43939.958333333336 | 0 |
| 43940.0 | 0 |
| 43940.041666666664 | 0 |
| 43940.083333333336 | 0 |
| 43940.125 | 0 |
| 43940.166666666664 | 0 |
| 43940.208333333336 | 0 |
| 43940.25 | 0 |
| 43940.291666666664 | 0 |
| 43940.333333333336 | 0 |
| 43940.375 | 0 |
| 43940.416666666664 | 0 |
| 43940.458333333336 | 0 |
| 43940.5 | 0 |
| 43940.541666666664 | 0 |
| 43940.583333333336 | 0 |
| 43940.625 | 0 |
| 43940.666666666664 | 0 |
| 43940.708333333336 | 0 |
| 43940.75 | 0 |
| 43940.791666666664 | 0 |
| 43940.833333333336 | 0 |
| 43940.875 | 0 |
| 43940.916666666664 | 0 |
| 43940.958333333336 | 0 |
| 43941.0 | 0 |
| 43941.041666666664 | 0 |
| 43941.083333333336 | 0 |
| 43941.125 | 0 |
| 43941.166666666664 | 0 |
| 43941.208333333336 | 0 |
| 43941.25 | 0 |
| 43941.291666666664 | 0 |
| 43941.333333333336 | 0 |
| 43941.375 | 0 |
| 43941.416666666664 | 0 |
| 43941.458333333336 | 0 |
| 43941.5 | 0 |
| 43941.541666666664 | 0 |
| 43941.583333333336 | 0 |
| 43941.625 | 0 |
| 43941.666666666664 | 0 |
| 43941.708333333336 | 0 |
| 43941.75 | 0 |
| 43941.791666666664 | 0 |
| 43941.833333333336 | 0 |
| 43941.875 | 0 |
| 43941.916666666664 | 0 |
| 43941.958333333336 | 0 |
| 43942.0 | 0 |
| 43942.041666666664 | 0 |
| 43942.083333333336 | 0 |
| 43942.125 | 0 |
| 43942.166666666664 | 0 |
| 43942.208333333336 | 0 |
| 43942.25 | 0 |
| 43942.291666666664 | 0 |
| 43942.333333333336 | 0 |
| 43942.375 | 0 |
| 43942.416666666664 | 0 |
| 43942.458333333336 | 0 |
| 43942.5 | 0 |
| 43942.541666666664 | 0 |
| 43942.583333333336 | 0 |
| 43942.625 | 0 |
| 43942.666666666664 | 0 |
| 43942.708333333336 | 0 |
| 43942.75 | 0 |
| 43942.791666666664 | 0 |
| 43942.833333333336 | 0 |
| 43942.875 | 0 |
| 43942.916666666664 | 0 |
| 43942.958333333336 | 0 |
| 43943.0 | 0 |
| 43943.041666666664 | 0 |
| 43943.083333333336 | 0 |
| 43943.125 | 0 |
| 43943.166666666664 | 0 |
| 43943.208333333336 | 0 |
| 43943.25 | 0 |
| 43943.291666666664 | 0 |
| 43943.333333333336 | 0 |
| 43943.375 | 0 |
| 43943.416666666664 | 0 |
| 43943.458333333336 | 0 |
| 43943.5 | 0 |
| 43943.541666666664 | 0 |
| 43943.583333333336 | 0 |
| 43943.625 | 0 |
| 43943.666666666664 | 0 |
| 43943.708333333336 | 0 |
| 43943.75 | 0 |
| 43943.791666666664 | 0 |
| 43943.833333333336 | 0 |
| 43943.875 | 0 |
| 43943.916666666664 | 0 |
| 43943.958333333336 | 0 |
| 43944.0 | 0 |
| 43944.041666666664 | 0 |
| 43944.083333333336 | 0 |
| 43944.125 | 0 |
| 43944.166666666664 | 0 |
| 43944.208333333336 | 0 |
| 43944.25 | 0 |
| 43944.291666666664 | 0 |
| 43944.333333333336 | 0 |
| 43944.375 | 0 |
| 43944.416666666664 | 0 |
| 43944.458333333336 | 0 |
| 43944.5 | 0 |
| 43944.541666666664 | 0 |
| 43944.583333333336 | 0 |
| 43944.625 | 0 |
| 43944.666666666664 | 0 |
| 43944.708333333336 | 0 |
| 43944.75 | 0 |
| 43944.791666666664 | 0 |
| 43944.833333333336 | 0 |
| 43944.875 | 0 |
| 43944.916666666664 | 0 |
| 43944.958333333336 | 0 |
| 43945.0 | 0 |
| 43945.041666666664 | 0 |
| 43945.083333333336 | 0 |
| 43945.125 | 0 |
| 43945.166666666664 | 0 |
| 43945.208333333336 | 0 |
| 43945.25 | 0 |
| 43945.291666666664 | 0 |
| 43945.333333333336 | 0 |
| 43945.375 | 0 |
| 43945.416666666664 | 0 |
| 43945.458333333336 | 0 |
| 43945.5 | 0 |
| 43945.541666666664 | 0 |
| 43945.583333333336 | 0 |
| 43945.625 | 0 |
| 43945.666666666664 | 0 |
| 43945.708333333336 | 0 |
| 43945.75 | 0 |
| 43945.791666666664 | 0 |
| 43945.833333333336 | 0 |
| 43945.875 | 0 |
| 43945.916666666664 | 0 |
| 43945.958333333336 | 0 |
| 43946.0 | 0 |
| 43946.041666666664 | 0 |
| 43946.083333333336 | 0 |
| 43946.125 | 0 |
| 43946.166666666664 | 0 |
| 43946.208333333336 | 0 |
| 43946.25 | 0 |
| 43946.291666666664 | 0 |
| 43946.333333333336 | 0 |
| 43946.375 | 0 |
| 43946.416666666664 | 0 |
| 43946.458333333336 | 0 |
| 43946.5 | 0 |
| 43946.541666666664 | 0 |
| 43946.583333333336 | 0 |
| 43946.625 | 0 |
| 43946.666666666664 | 0 |
| 43946.708333333336 | 0 |
| 43946.75 | 0 |
| 43946.791666666664 | 0 |
| 43946.833333333336 | 0 |
| 43946.875 | 0 |
| 43946.916666666664 | 0 |
| 43946.958333333336 | 0 |
| 43947.0 | 0 |
| 43947.041666666664 | 0 |
| 43947.083333333336 | 0 |
| 43947.125 | 0 |
| 43947.166666666664 | 0 |
| 43947.208333333336 | 0 |
| 43947.25 | 0 |
| 43947.291666666664 | 0 |
| 43947.333333333336 | 0 |
| 43947.375 | 0 |
| 43947.416666666664 | 0 |
| 43947.458333333336 | 0 |
| 43947.5 | 0 |
| 43947.541666666664 | 0 |
| 43947.583333333336 | 0 |
| 43947.625 | 0 |
| 43947.666666666664 | 0 |
| 43947.708333333336 | 0 |
| 43947.75 | 0 |
| 43947.791666666664 | 0 |
| 43947.833333333336 | 0 |
| 43947.875 | 0 |
| 43947.916666666664 | 0 |
| 43947.958333333336 | 0 |
| 43948.0 | 0 |
| 43948.041666666664 | 0 |
| 43948.083333333336 | 0 |
| 43948.125 | 0 |
| 43948.166666666664 | 0 |
| 43948.208333333336 | 0 |
| 43948.25 | 0 |
| 43948.291666666664 | 0 |
| 43948.333333333336 | 0 |
| 43948.375 | 0 |
| 43948.416666666664 | 0 |
| 43948.458333333336 | 0 |
| 43948.5 | 0 |
| 43948.541666666664 | 0 |
| 43948.583333333336 | 0 |
| 43948.625 | 0 |
| 43948.666666666664 | 0 |
| 43948.708333333336 | 0 |
| 43948.75 | 0 |
| 43948.791666666664 | 0 |
| 43948.833333333336 | 0 |
| 43948.875 | 0 |
| 43948.916666666664 | 0 |
| 43948.958333333336 | 0 |
| 43949.0 | 0 |
| 43949.041666666664 | 0 |
| 43949.083333333336 | 0 |
| 43949.125 | 0 |
| 43949.166666666664 | 0 |
| 43949.208333333336 | 0 |
| 43949.25 | 0 |
| 43949.291666666664 | 0 |
| 43949.333333333336 | 0 |
| 43949.375 | 0 |
| 43949.416666666664 | 0 |
| 43949.458333333336 | 0 |
| 43949.5 | 0 |
| 43949.541666666664 | 0 |
| 43949.583333333336 | 0 |
| 43949.625 | 0 |
| 43949.666666666664 | 0 |
| 43949.708333333336 | 0 |
| 43949.75 | 0 |
| 43949.791666666664 | 0 |
| 43949.833333333336 | 0 |
| 43949.875 | 0 |
| 43949.916666666664 | 0 |
| 43949.958333333336 | 0 |
| 43950.0 | 0 |
| 43950.041666666664 | 0 |
| 43950.083333333336 | 0 |
| 43950.125 | 0 |
| 43950.166666666664 | 0 |
| 43950.208333333336 | 0 |
| 43950.25 | 0 |
| 43950.291666666664 | 0 |
| 43950.333333333336 | 0 |
| 43950.375 | 0 |
| 43950.416666666664 | 0 |
| 43950.458333333336 | 0 |
| 43950.5 | 0 |
| 43950.541666666664 | 0 |
| 43950.583333333336 | 0 |
| 43950.625 | 0 |
| 43950.666666666664 | 0 |
| 43950.708333333336 | 0 |
| 43950.75 | 0 |
| 43950.791666666664 | 0 |
| 43950.833333333336 | 0 |
| 43950.875 | 0 |
| 43950.916666666664 | 0 |
| 43950.958333333336 | 0 |
| 43951.0 | 0 |
| 43951.041666666664 | 0 |
| 43951.083333333336 | 0 |
| 43951.125 | 0 |
| 43951.166666666664 | 0 |
| 43951.208333333336 | 0 |
| 43951.25 | 0 |
| 43951.291666666664 | 0 |
| 43951.333333333336 | 0 |
| 43951.375 | 0 |
| 43951.416666666664 | 0 |
| 43951.458333333336 | 0 |
| 43951.5 | 0 |
| 43951.541666666664 | 0 |
| 43951.583333333336 | 0 |
| 43951.625 | 0 |
| 43951.666666666664 | 0 |
| 43951.708333333336 | 0 |
| 43951.75 | 0 |
| 43951.791666666664 | 0 |
| 43951.833333333336 | 0 |
| 43951.875 | 0 |
| 43951.916666666664 | 0 |
| 43951.958333333336 | 0 |
| 43952.0 | 0 |
| 43952.041666666664 | 0 |
| 43952.083333333336 | 0 |
| 43952.125 | 0 |
| 43952.166666666664 | 0 |
| 43952.208333333336 | 0 |
| 43952.25 | 0 |
| 43952.291666666664 | 0 |
| 43952.333333333336 | 0 |
| 43952.375 | 0 |
| 43952.416666666664 | 0 |
| 43952.458333333336 | 0 |
| 43952.5 | 0 |
| 43952.541666666664 | 0 |
| 43952.583333333336 | 0 |
| 43952.625 | 0 |
| 43952.666666666664 | 0 |
| 43952.708333333336 | 0 |
| 43952.75 | 0 |
| 43952.791666666664 | 0 |
| 43952.833333333336 | 0 |
| 43952.875 | 0 |
| 43952.916666666664 | 0 |
| 43952.958333333336 | 0 |
| 43953.0 | 0 |
| 43953.041666666664 | 0 |
| 43953.083333333336 | 0 |
| 43953.125 | 0 |
| 43953.166666666664 | 0 |
| 43953.208333333336 | 0 |
| 43953.25 | 0 |
| 43953.291666666664 | 0 |
| 43953.333333333336 | 0 |
| 43953.375 | 0 |
| 43953.416666666664 | 0 |
| 43953.458333333336 | 0 |
| 43953.5 | 0 |
| 43953.541666666664 | 0 |
| 43953.583333333336 | 0 |
| 43953.625 | 0 |
| 43953.666666666664 | 0 |
| 43953.708333333336 | 0 |
| 43953.75 | 0 |
| 43953.791666666664 | 0 |
| 43953.833333333336 | 0 |
| 43953.875 | 0 |
| 43953.916666666664 | 0 |
| 43953.958333333336 | 0 |
| 43954.0 | 0 |
| 43954.041666666664 | 0 |
| 43954.083333333336 | 0 |
| 43954.125 | 0 |
| 43954.166666666664 | 0 |
| 43954.208333333336 | 0 |
| 43954.25 | 0 |
| 43954.291666666664 | 0 |
| 43954.333333333336 | 0 |
| 43954.375 | 0 |
| 43954.416666666664 | 0 |
| 43954.458333333336 | 0 |
| 43954.5 | 0 |
| 43954.541666666664 | 0 |
| 43954.583333333336 | 0 |
| 43954.625 | 0 |
| 43954.666666666664 | 0 |
| 43954.708333333336 | 0 |
| 43954.75 | 0 |
| 43954.791666666664 | 0 |
| 43954.833333333336 | 0 |
| 43954.875 | 0 |
| 43954.916666666664 | 0 |
| 43954.958333333336 | 0 |
| 43955.0 | 0 |
| 43955.041666666664 | 0 |
| 43955.083333333336 | 0 |
| 43955.125 | 0 |
| 43955.166666666664 | 0 |
| 43955.208333333336 | 0 |
| 43955.25 | 0 |
| 43955.291666666664 | 0 |
| 43955.333333333336 | 0 |
| 43955.375 | 0 |
| 43955.416666666664 | 0 |
| 43955.458333333336 | 0 |
| 43955.5 | 0 |
| 43955.541666666664 | 0 |
| 43955.583333333336 | 0 |
| 43955.625 | 0 |
| 43955.666666666664 | 0 |
| 43955.708333333336 | 0 |
| 43955.75 | 0 |
| 43955.791666666664 | 0 |
| 43955.833333333336 | 0 |
| 43955.875 | 0 |
| 43955.916666666664 | 0 |
| 43955.958333333336 | 0 |
| 43956.0 | 0 |
| 43956.041666666664 | 0 |
| 43956.083333333336 | 0 |
| 43956.125 | 0 |
| 43956.166666666664 | 0 |
| 43956.208333333336 | 0 |
| 43956.25 | 0 |
| 43956.291666666664 | 0 |
| 43956.333333333336 | 0 |
| 43956.375 | 0 |
| 43956.416666666664 | 0 |
| 43956.458333333336 | 0 |
| 43956.5 | 0 |
| 43956.541666666664 | 0 |
| 43956.583333333336 | 0 |
| 43956.625 | 0 |
| 43956.666666666664 | 0 |
| 43956.708333333336 | 0 |
| 43956.75 | 0 |
| 43956.791666666664 | 0 |
| 43956.833333333336 | 0 |
| 43956.875 | 0 |
| 43956.916666666664 | 0 |
| 43956.958333333336 | 0 |
| 43957.0 | 0 |
| 43957.041666666664 | 0 |
| 43957.083333333336 | 0 |
| 43957.125 | 0 |
| 43957.166666666664 | 0 |
| 43957.208333333336 | 0 |
| 43957.25 | 0 |
| 43957.291666666664 | 0 |
| 43957.333333333336 | 0 |
| 43957.375 | 0 |
| 43957.416666666664 | 0 |
| 43957.458333333336 | 0 |
| 43957.5 | 0 |
| 43957.541666666664 | 0 |
| 43957.583333333336 | 0 |
| 43957.625 | 0 |
| 43957.666666666664 | 0 |
| 43957.708333333336 | 0 |
| 43957.75 | 0 |
| 43957.791666666664 | 0 |
| 43957.833333333336 | 0 |
| 43957.875 | 0 |
| 43957.916666666664 | 0 |
| 43957.958333333336 | 0 |
| 43958.0 | 0 |
| 43958.041666666664 | 0 |
| 43958.083333333336 | 0 |
| 43958.125 | 0 |
| 43958.166666666664 | 0 |
| 43958.208333333336 | 0 |
| 43958.25 | 0 |
| 43958.291666666664 | 0 |
| 43958.333333333336 | 0 |
| 43958.375 | 0 |
| 43958.416666666664 | 0 |
| 43958.458333333336 | 0 |
| 43958.5 | 0 |
| 43958.541666666664 | 0 |
| 43958.583333333336 | 0 |
| 43958.625 | 0 |
| 43958.666666666664 | 0 |
| 43958.708333333336 | 0 |
| 43958.75 | 0 |
| 43958.791666666664 | 0 |
| 43958.833333333336 | 0 |
| 43958.875 | 0 |
| 43958.916666666664 | 0 |
| 43958.958333333336 | 0 |
| 43959.0 | 0 |
| 43959.041666666664 | 0 |
| 43959.083333333336 | 0 |
| 43959.125 | 0 |
| 43959.166666666664 | 0 |
| 43959.208333333336 | 0 |
| 43959.25 | 0 |
| 43959.291666666664 | 0 |
| 43959.333333333336 | 0 |
| 43959.375 | 0 |
| 43959.416666666664 | 0 |
| 43959.458333333336 | 0 |
| 43959.5 | 0 |
| 43959.541666666664 | 0 |
| 43959.583333333336 | 0 |
| 43959.625 | 0 |
| 43959.666666666664 | 0 |
| 43959.708333333336 | 0 |
| 43959.75 | 0 |
| 43959.791666666664 | 0 |
| 43959.833333333336 | 0 |
| 43959.875 | 0 |
| 43959.916666666664 | 0 |
| 43959.958333333336 | 0 |
| 43960.0 | 0 |
| 43960.041666666664 | 0 |
| 43960.083333333336 | 0 |
| 43960.125 | 0 |
| 43960.166666666664 | 0 |
| 43960.208333333336 | 0 |
| 43960.25 | 0 |
| 43960.291666666664 | 0 |
| 43960.333333333336 | 0 |
| 43960.375 | 0 |
| 43960.416666666664 | 0 |
| 43960.458333333336 | 0 |
| 43960.5 | 0 |
| 43960.541666666664 | 0 |
| 43960.583333333336 | 0 |
| 43960.625 | 0 |
| 43960.666666666664 | 0 |
| 43960.708333333336 | 0 |
| 43960.75 | 0 |
| 43960.791666666664 | 0 |
| 43960.833333333336 | 0 |
| 43960.875 | 0 |
| 43960.916666666664 | 0 |
| 43960.958333333336 | 0 |
| 43961.0 | 0 |
| 43961.041666666664 | 0 |
| 43961.083333333336 | 0 |
| 43961.125 | 0 |
| 43961.166666666664 | 0 |
| 43961.208333333336 | 0 |
| 43961.25 | 0 |
| 43961.291666666664 | 0 |
| 43961.333333333336 | 0 |
| 43961.375 | 0 |
| 43961.416666666664 | 0 |
| 43961.458333333336 | 0 |
| 43961.5 | 0 |
| 43961.541666666664 | 0 |
| 43961.583333333336 | 0 |
| 43961.625 | 0 |
| 43961.666666666664 | 0 |
| 43961.708333333336 | 0 |
| 43961.75 | 0 |
| 43961.791666666664 | 0 |
| 43961.833333333336 | 0 |
| 43961.875 | 0 |
| 43961.916666666664 | 0 |
| 43961.958333333336 | 0 |
| 43962.0 | 0 |
| 43962.041666666664 | 0 |
| 43962.083333333336 | 0 |
| 43962.125 | 0 |
| 43962.166666666664 | 0 |
| 43962.208333333336 | 0 |
| 43962.25 | 0 |
| 43962.291666666664 | 0 |
| 43962.333333333336 | 0 |
| 43962.375 | 0 |
| 43962.416666666664 | 0 |
| 43962.458333333336 | 0 |
| 43962.5 | 0 |
| 43962.541666666664 | 0 |
| 43962.583333333336 | 0 |
| 43962.625 | 0 |
| 43962.666666666664 | 0 |
| 43962.708333333336 | 0 |
| 43962.75 | 0 |
| 43962.791666666664 | 0 |
| 43962.833333333336 | 0 |
| 43962.875 | 0 |
| 43962.916666666664 | 0 |
| 43962.958333333336 | 0 |
| 43963.0 | 0 |
| 43963.041666666664 | 0 |
| 43963.083333333336 | 0 |
| 43963.125 | 0 |
| 43963.166666666664 | 0 |
| 43963.208333333336 | 0 |
| 43963.25 | 0 |
| 43963.291666666664 | 0 |
| 43963.333333333336 | 0 |
| 43963.375 | 0 |
| 43963.416666666664 | 0 |
| 43963.458333333336 | 0 |
| 43963.5 | 0 |
| 43963.541666666664 | 0 |
| 43963.583333333336 | 0 |
| 43963.625 | 0 |
| 43963.666666666664 | 0 |
| 43963.708333333336 | 0 |
| 43963.75 | 0 |
| 43963.791666666664 | 0 |
| 43963.833333333336 | 0 |
| 43963.875 | 0 |
| 43963.916666666664 | 0 |
| 43963.958333333336 | 0 |
| 43964.0 | 0 |
| 43964.041666666664 | 0 |
| 43964.083333333336 | 0 |
| 43964.125 | 0 |
| 43964.166666666664 | 0 |
| 43964.208333333336 | 0 |
| 43964.25 | 0 |
| 43964.291666666664 | 0 |
| 43964.333333333336 | 0 |
| 43964.375 | 0 |
| 43964.416666666664 | 0 |
| 43964.458333333336 | 0 |
| 43964.5 | 0 |
| 43964.541666666664 | 0 |
| 43964.583333333336 | 0 |
| 43964.625 | 0 |
| 43964.666666666664 | 0 |
| 43964.708333333336 | 0 |
| 43964.75 | 0 |
| 43964.791666666664 | 0 |
| 43964.833333333336 | 0 |
| 43964.875 | 0 |
| 43964.916666666664 | 0 |
| 43964.958333333336 | 0 |
| 43965.0 | 0 |
| 43965.041666666664 | 0 |
| 43965.083333333336 | 0 |
| 43965.125 | 0 |
| 43965.166666666664 | 0 |
| 43965.208333333336 | 0 |
| 43965.25 | 0 |
| 43965.291666666664 | 0 |
| 43965.333333333336 | 0 |
| 43965.375 | 0 |
| 43965.416666666664 | 0 |
| 43965.458333333336 | 0 |
| 43965.5 | 0 |
| 43965.541666666664 | 0 |
| 43965.583333333336 | 0 |
| 43965.625 | 0 |
| 43965.666666666664 | 0 |
| 43965.708333333336 | 0 |
| 43965.75 | 0 |
| 43965.791666666664 | 0 |
| 43965.833333333336 | 0 |
| 43965.875 | 0 |
| 43965.916666666664 | 0 |
| 43965.958333333336 | 0 |
| 43966.0 | 0 |
| 43966.041666666664 | 0 |
| 43966.083333333336 | 0 |
| 43966.125 | 0 |
| 43966.166666666664 | 0 |
| 43966.208333333336 | 0 |
| 43966.25 | 0 |
| 43966.291666666664 | 0 |
| 43966.333333333336 | 0 |
| 43966.375 | 0 |
| 43966.416666666664 | 0 |
| 43966.458333333336 | 0 |
| 43966.5 | 0 |
| 43966.541666666664 | 0 |
| 43966.583333333336 | 0 |
| 43966.625 | 0 |
| 43966.666666666664 | 0 |
| 43966.708333333336 | 0 |
| 43966.75 | 0 |
| 43966.791666666664 | 0 |
| 43966.833333333336 | 0 |
| 43966.875 | 0 |
| 43966.916666666664 | 0 |
| 43966.958333333336 | 0 |
| 43967.0 | 0 |
| 43967.041666666664 | 0 |
| 43967.083333333336 | 0 |
| 43967.125 | 0 |
| 43967.166666666664 | 0 |
| 43967.208333333336 | 0 |
| 43967.25 | 0 |
| 43967.291666666664 | 0 |
| 43967.333333333336 | 0 |
| 43967.375 | 0 |
| 43967.416666666664 | 0 |
| 43967.458333333336 | 0 |
| 43967.5 | 0 |
| 43967.541666666664 | 0 |
| 43967.583333333336 | 0 |
| 43967.625 | 0 |
| 43967.666666666664 | 0 |
| 43967.708333333336 | 0 |
| 43967.75 | 0 |
| 43967.791666666664 | 0 |
| 43967.833333333336 | 0 |
| 43967.875 | 0 |
| 43967.916666666664 | 0 |
| 43967.958333333336 | 0 |
| 43968.0 | 0 |
| 43968.041666666664 | 0 |
| 43968.083333333336 | 0 |
| 43968.125 | 0 |
| 43968.166666666664 | 0 |
| 43968.208333333336 | 0 |
| 43968.25 | 0 |
| 43968.291666666664 | 0 |
| 43968.333333333336 | 0 |
| 43968.375 | 0 |
| 43968.416666666664 | 0 |
| 43968.458333333336 | 0 |
| 43968.5 | 0 |
| 43968.541666666664 | 0 |
| 43968.583333333336 | 0 |
| 43968.625 | 0 |
| 43968.666666666664 | 0 |
| 43968.708333333336 | 0 |
| 43968.75 | 0 |
| 43968.791666666664 | 0 |
| 43968.833333333336 | 0 |
| 43968.875 | 0 |
| 43968.916666666664 | 0 |
| 43968.958333333336 | 0 |
| 43969.0 | 0 |
| 43969.041666666664 | 0 |
| 43969.083333333336 | 0 |
| 43969.125 | 0 |
| 43969.166666666664 | 0 |
| 43969.208333333336 | 0 |
| 43969.25 | 0 |
| 43969.291666666664 | 0 |
| 43969.333333333336 | 0 |
| 43969.375 | 0 |
| 43969.416666666664 | 0 |
| 43969.458333333336 | 0 |
| 43969.5 | 0 |
| 43969.541666666664 | 0 |
| 43969.583333333336 | 0 |
| 43969.625 | 0 |
| 43969.666666666664 | 0 |
| 43969.708333333336 | 0 |
| 43969.75 | 0 |
| 43969.791666666664 | 0 |
| 43969.833333333336 | 0 |
| 43969.875 | 0 |
| 43969.916666666664 | 0 |
| 43969.958333333336 | 0 |
| 43970.0 | 0 |
| 43970.041666666664 | 0 |
| 43970.083333333336 | 0 |
| 43970.125 | 0 |
| 43970.166666666664 | 0 |
| 43970.208333333336 | 0 |
| 43970.25 | 0 |
| 43970.291666666664 | 0 |
| 43970.333333333336 | 0 |
| 43970.375 | 0 |
| 43970.416666666664 | 0 |
| 43970.458333333336 | 0 |
| 43970.5 | 0 |
| 43970.541666666664 | 0 |
| 43970.583333333336 | 0 |
| 43970.625 | 0 |
| 43970.666666666664 | 0 |
| 43970.708333333336 | 0 |
| 43970.75 | 0 |
| 43970.791666666664 | 0 |
| 43970.833333333336 | 0 |
| 43970.875 | 0 |
| 43970.916666666664 | 0 |
| 43970.958333333336 | 0 |
| 43971.0 | 0 |
| 43971.041666666664 | 0 |
| 43971.083333333336 | 0 |
| 43971.125 | 0 |
| 43971.166666666664 | 0 |
| 43971.208333333336 | 0 |
| 43971.25 | 0 |
| 43971.291666666664 | 0 |
| 43971.333333333336 | 0 |
| 43971.375 | 0 |
| 43971.416666666664 | 0 |
| 43971.458333333336 | 0 |
| 43971.5 | 0 |
| 43971.541666666664 | 0 |
| 43971.583333333336 | 0 |
| 43971.625 | 0 |
| 43971.666666666664 | 0 |
| 43971.708333333336 | 0 |
| 43971.75 | 0 |
| 43971.791666666664 | 0 |
| 43971.833333333336 | 0 |
| 43971.875 | 0 |
| 43971.916666666664 | 0 |
| 43971.958333333336 | 0 |
| 43972.0 | 0 |
| 43972.041666666664 | 0 |
| 43972.083333333336 | 0 |
| 43972.125 | 0 |
| 43972.166666666664 | 0 |
| 43972.208333333336 | 0 |
| 43972.25 | 0 |
| 43972.291666666664 | 0 |
| 43972.333333333336 | 0 |
| 43972.375 | 0 |
| 43972.416666666664 | 0 |
| 43972.458333333336 | 0 |
| 43972.5 | 0 |
| 43972.541666666664 | 0 |
| 43972.583333333336 | 0 |
| 43972.625 | 0 |
| 43972.666666666664 | 0 |
| 43972.708333333336 | 0 |
| 43972.75 | 0 |
| 43972.791666666664 | 0 |
| 43972.833333333336 | 0 |
| 43972.875 | 0 |
| 43972.916666666664 | 0 |
| 43972.958333333336 | 0 |
| 43973.0 | 0 |
| 43973.041666666664 | 0 |
| 43973.083333333336 | 0 |
| 43973.125 | 0 |
| 43973.166666666664 | 0 |
| 43973.208333333336 | 0 |
| 43973.25 | 0 |
| 43973.291666666664 | 0 |
| 43973.333333333336 | 0 |
| 43973.375 | 0 |
| 43973.416666666664 | 0 |
| 43973.458333333336 | 0 |
| 43973.5 | 0 |
| 43973.541666666664 | 0 |
| 43973.583333333336 | 0 |
| 43973.625 | 0 |
| 43973.666666666664 | 0 |
| 43973.708333333336 | 0 |
| 43973.75 | 0 |
| 43973.791666666664 | 0 |
| 43973.833333333336 | 0 |
| 43973.875 | 0 |
| 43973.916666666664 | 0 |
| 43973.958333333336 | 0 |
| 43974.0 | 0 |
| 43974.041666666664 | 0 |
| 43974.083333333336 | 0 |
| 43974.125 | 0 |
| 43974.166666666664 | 0 |
| 43974.208333333336 | 0 |
| 43974.25 | 0 |
| 43974.291666666664 | 0 |
| 43974.333333333336 | 0 |
| 43974.375 | 0 |
| 43974.416666666664 | 0 |
| 43974.458333333336 | 0 |
| 43974.5 | 0 |
| 43974.541666666664 | 0 |
| 43974.583333333336 | 0 |
| 43974.625 | 0 |
| 43974.666666666664 | 0 |
| 43974.708333333336 | 0 |
| 43974.75 | 0 |
| 43974.791666666664 | 0 |
| 43974.833333333336 | 0 |
| 43974.875 | 0 |
| 43974.916666666664 | 0 |
| 43974.958333333336 | 0 |
| 43975.0 | 0 |
| 43975.041666666664 | 0 |
| 43975.083333333336 | 0 |
| 43975.125 | 0 |
| 43975.166666666664 | 0 |
| 43975.208333333336 | 0 |
| 43975.25 | 0 |
| 43975.291666666664 | 0 |
| 43975.333333333336 | 0 |
| 43975.375 | 0 |
| 43975.416666666664 | 0 |
| 43975.458333333336 | 0 |
| 43975.5 | 0 |
| 43975.541666666664 | 0 |
| 43975.583333333336 | 0 |
| 43975.625 | 0 |
| 43975.666666666664 | 0 |
| 43975.708333333336 | 0 |
| 43975.75 | 0 |
| 43975.791666666664 | 0 |
| 43975.833333333336 | 0 |
| 43975.875 | 0 |
| 43975.916666666664 | 0 |
| 43975.958333333336 | 0 |
| 43976.0 | 0 |
| 43976.041666666664 | 0 |
| 43976.083333333336 | 0 |
| 43976.125 | 0 |
| 43976.166666666664 | 0 |
| 43976.208333333336 | 0 |
| 43976.25 | 0 |
| 43976.291666666664 | 0 |
| 43976.333333333336 | 0 |
| 43976.375 | 0 |
| 43976.416666666664 | 0 |
| 43976.458333333336 | 0 |
| 43976.5 | 0 |
| 43976.541666666664 | 0 |
| 43976.583333333336 | 0 |
| 43976.625 | 0 |
| 43976.666666666664 | 0 |
| 43976.708333333336 | 0 |
| 43976.75 | 0 |
| 43976.791666666664 | 0 |
| 43976.833333333336 | 0 |
| 43976.875 | 0 |
| 43976.916666666664 | 0 |
| 43976.958333333336 | 0 |
| 43977.0 | 0 |
| 43977.041666666664 | 0 |
| 43977.083333333336 | 0 |
| 43977.125 | 0 |
| 43977.166666666664 | 0 |
| 43977.208333333336 | 0 |
| 43977.25 | 0 |
| 43977.291666666664 | 0 |
| 43977.333333333336 | 0 |
| 43977.375 | 0 |
| 43977.416666666664 | 0 |
| 43977.458333333336 | 0 |
| 43977.5 | 0 |
| 43977.541666666664 | 0 |
| 43977.583333333336 | 0 |
| 43977.625 | 0 |
| 43977.666666666664 | 0 |
| 43977.708333333336 | 0 |
| 43977.75 | 0 |
| 43977.791666666664 | 0 |
| 43977.833333333336 | 0 |
| 43977.875 | 0 |
| 43977.916666666664 | 0 |
| 43977.958333333336 | 0 |
| 43978.0 | 0 |
| 43978.041666666664 | 0 |
| 43978.083333333336 | 0 |
| 43978.125 | 0 |
| 43978.166666666664 | 0 |
| 43978.208333333336 | 0 |
| 43978.25 | 0 |
| 43978.291666666664 | 0 |
| 43978.333333333336 | 0 |
| 43978.375 | 0 |
| 43978.416666666664 | 0 |
| 43978.458333333336 | 0 |
| 43978.5 | 0 |
| 43978.541666666664 | 0 |
| 43978.583333333336 | 0 |
| 43978.625 | 0 |
| 43978.666666666664 | 0 |
| 43978.708333333336 | 0 |
| 43978.75 | 0 |
| 43978.791666666664 | 0 |
| 43978.833333333336 | 0 |
| 43978.875 | 0 |
| 43978.916666666664 | 0 |
| 43978.958333333336 | 0 |
| 43979.0 | 0 |
| 43979.041666666664 | 0 |
| 43979.083333333336 | 0 |
| 43979.125 | 0 |
| 43979.166666666664 | 0 |
| 43979.208333333336 | 0 |
| 43979.25 | 0 |
| 43979.291666666664 | 0 |
| 43979.333333333336 | 0 |
| 43979.375 | 0 |
| 43979.416666666664 | 0 |
| 43979.458333333336 | 0 |
| 43979.5 | 0 |
| 43979.541666666664 | 0 |
| 43979.583333333336 | 0 |
| 43979.625 | 0 |
| 43979.666666666664 | 0 |
| 43979.708333333336 | 0 |
| 43979.75 | 0 |
| 43979.791666666664 | 0 |
| 43979.833333333336 | 0 |
| 43979.875 | 0 |
| 43979.916666666664 | 0 |
| 43979.958333333336 | 0 |
| 43980.0 | 0 |
| 43980.041666666664 | 0 |
| 43980.083333333336 | 0 |
| 43980.125 | 0 |
| 43980.166666666664 | 0 |
| 43980.208333333336 | 0 |
| 43980.25 | 0 |
| 43980.291666666664 | 0 |
| 43980.333333333336 | 0 |
| 43980.375 | 0 |
| 43980.416666666664 | 0 |
| 43980.458333333336 | 0 |
| 43980.5 | 0 |
| 43980.541666666664 | 0 |
| 43980.583333333336 | 0 |
| 43980.625 | 0 |
| 43980.666666666664 | 0 |
| 43980.708333333336 | 0 |
| 43980.75 | 0 |
| 43980.791666666664 | 0 |
| 43980.833333333336 | 0 |
| 43980.875 | 0 |
| 43980.916666666664 | 0 |
| 43980.958333333336 | 0 |
| 43981.0 | 0 |
| 43981.041666666664 | 0 |
| 43981.083333333336 | 0 |
| 43981.125 | 0 |
| 43981.166666666664 | 0 |
| 43981.208333333336 | 0 |
| 43981.25 | 0 |
| 43981.291666666664 | 0 |
| 43981.333333333336 | 0 |
| 43981.375 | 0 |
| 43981.416666666664 | 0 |
| 43981.458333333336 | 0 |
| 43981.5 | 0 |
| 43981.541666666664 | 0 |
| 43981.583333333336 | 0 |
| 43981.625 | 0 |
| 43981.666666666664 | 0 |
| 43981.708333333336 | 0 |
| 43981.75 | 0 |
| 43981.791666666664 | 0 |
| 43981.833333333336 | 0 |
| 43981.875 | 0 |
| 43981.916666666664 | 0 |
| 43981.958333333336 | 0 |
| 43982.0 | 0 |
| 43982.041666666664 | 0 |
| 43982.083333333336 | 0 |
| 43982.125 | 0 |
| 43982.166666666664 | 0 |
| 43982.208333333336 | 0 |
| 43982.25 | 0 |
| 43982.291666666664 | 0 |
| 43982.333333333336 | 0 |
| 43982.375 | 0 |
| 43982.416666666664 | 0 |
| 43982.458333333336 | 0 |
| 43982.5 | 0 |
| 43982.541666666664 | 0 |
| 43982.583333333336 | 0 |
| 43982.625 | 0 |
| 43982.666666666664 | 0 |
| 43982.708333333336 | 0 |
| 43982.75 | 0 |
| 43982.791666666664 | 0 |
| 43982.833333333336 | 0 |
| 43982.875 | 0 |
| 43982.916666666664 | 0 |
| 43982.958333333336 | 0 |
| 43983.0 | 0 |
| 43983.041666666664 | 0 |
| 43983.083333333336 | 0 |
| 43983.125 | 0 |
| 43983.166666666664 | 0 |
| 43983.208333333336 | 0 |
| 43983.25 | 0 |
| 43983.291666666664 | 0 |
| 43983.333333333336 | 0 |
| 43983.375 | 0 |
| 43983.416666666664 | 0 |
| 43983.458333333336 | 0 |
| 43983.5 | 0 |
| 43983.541666666664 | 0 |
| 43983.583333333336 | 0 |
| 43983.625 | 0 |
| 43983.666666666664 | 0 |
| 43983.708333333336 | 0 |
| 43983.75 | 0 |
| 43983.791666666664 | 0 |
| 43983.833333333336 | 0 |
| 43983.875 | 0 |
| 43983.916666666664 | 0 |
| 43983.958333333336 | 0 |
| 43984.0 | 0 |
| 43984.041666666664 | 0 |
| 43984.083333333336 | 0 |
| 43984.125 | 0 |
| 43984.166666666664 | 0 |
| 43984.208333333336 | 0 |
| 43984.25 | 0 |
| 43984.291666666664 | 0 |
| 43984.333333333336 | 0 |
| 43984.375 | 0 |
| 43984.416666666664 | 0 |
| 43984.458333333336 | 0 |
| 43984.5 | 0 |
| 43984.541666666664 | 0 |
| 43984.583333333336 | 0 |
| 43984.625 | 0 |
| 43984.666666666664 | 0 |
| 43984.708333333336 | 0 |
| 43984.75 | 0 |
| 43984.791666666664 | 0 |
| 43984.833333333336 | 0 |
| 43984.875 | 0 |
| 43984.916666666664 | 0 |
| 43984.958333333336 | 0 |
| 43985.0 | 0 |
| 43985.041666666664 | 0 |
| 43985.083333333336 | 0 |
| 43985.125 | 0 |
| 43985.166666666664 | 0 |
| 43985.208333333336 | 0 |
| 43985.25 | 0 |
| 43985.291666666664 | 0 |
| 43985.333333333336 | 0 |
| 43985.375 | 0 |
| 43985.416666666664 | 0 |
| 43985.458333333336 | 0 |
| 43985.5 | 0 |
| 43985.541666666664 | 0 |
| 43985.583333333336 | 0 |
| 43985.625 | 0 |
| 43985.666666666664 | 0 |
| 43985.708333333336 | 0 |
| 43985.75 | 0 |
| 43985.791666666664 | 0 |
| 43985.833333333336 | 0 |
| 43985.875 | 0 |
| 43985.916666666664 | 0 |
| 43985.958333333336 | 0 |
| 43986.0 | 0 |
| 43986.041666666664 | 0 |
| 43986.083333333336 | 0 |
| 43986.125 | 0 |
| 43986.166666666664 | 0 |
| 43986.208333333336 | 0 |
| 43986.25 | 0 |
| 43986.291666666664 | 0 |
| 43986.333333333336 | 0 |
| 43986.375 | 0 |
| 43986.416666666664 | 0 |
| 43986.458333333336 | 0 |
| 43986.5 | 0 |
| 43986.541666666664 | 0 |
| 43986.583333333336 | 0 |
| 43986.625 | 0 |
| 43986.666666666664 | 0 |
| 43986.708333333336 | 0 |
| 43986.75 | 0 |
| 43986.791666666664 | 0 |
| 43986.833333333336 | 0 |
| 43986.875 | 0 |
| 43986.916666666664 | 0 |
| 43986.958333333336 | 0 |
| 43987.0 | 0 |
| 43987.041666666664 | 0 |
| 43987.083333333336 | 0 |
| 43987.125 | 0 |
| 43987.166666666664 | 0 |
| 43987.208333333336 | 0 |
| 43987.25 | 0 |
| 43987.291666666664 | 0 |
| 43987.333333333336 | 0 |
| 43987.375 | 0 |
| 43987.416666666664 | 0 |
| 43987.458333333336 | 0 |
| 43987.5 | 0 |
| 43987.541666666664 | 0 |
| 43987.583333333336 | 0 |
| 43987.625 | 0 |
| 43987.666666666664 | 0 |
| 43987.708333333336 | 0 |
| 43987.75 | 0 |
| 43987.791666666664 | 0 |
| 43987.833333333336 | 0 |
| 43987.875 | 0 |
| 43987.916666666664 | 0 |
| 43987.958333333336 | 0 |
| 43988.0 | 0 |
| 43988.041666666664 | 0 |
| 43988.083333333336 | 0 |
| 43988.125 | 0 |
| 43988.166666666664 | 0 |
| 43988.208333333336 | 0 |
| 43988.25 | 0 |
| 43988.291666666664 | 0 |
| 43988.333333333336 | 0 |
| 43988.375 | 0 |
| 43988.416666666664 | 0 |
| 43988.458333333336 | 0 |
| 43988.5 | 0 |
| 43988.541666666664 | 0 |
| 43988.583333333336 | 0 |
| 43988.625 | 0 |
| 43988.666666666664 | 0 |
| 43988.708333333336 | 0 |
| 43988.75 | 0 |
| 43988.791666666664 | 0 |
| 43988.833333333336 | 0 |
| 43988.875 | 0 |
| 43988.916666666664 | 0 |
| 43988.958333333336 | 0 |
| 43989.0 | 0 |
| 43989.041666666664 | 0 |
| 43989.083333333336 | 0 |
| 43989.125 | 0 |
| 43989.166666666664 | 0 |
| 43989.208333333336 | 0 |
| 43989.25 | 0 |
| 43989.291666666664 | 0 |
| 43989.333333333336 | 0 |
| 43989.375 | 0 |
| 43989.416666666664 | 0 |
| 43989.458333333336 | 0 |
| 43989.5 | 0 |
| 43989.541666666664 | 0 |
| 43989.583333333336 | 0 |
| 43989.625 | 0 |
| 43989.666666666664 | 0 |
| 43989.708333333336 | 0 |
| 43989.75 | 0 |
| 43989.791666666664 | 0 |
| 43989.833333333336 | 0 |
| 43989.875 | 0 |
| 43989.916666666664 | 0 |
| 43989.958333333336 | 0 |
| 43990.0 | 0 |
| 43990.041666666664 | 0 |
| 43990.083333333336 | 0 |
| 43990.125 | 0 |
| 43990.166666666664 | 0 |
| 43990.208333333336 | 0 |
| 43990.25 | 0 |
| 43990.291666666664 | 0 |
| 43990.333333333336 | 0 |
| 43990.375 | 0 |
| 43990.416666666664 | 0 |
| 43990.458333333336 | 0 |
| 43990.5 | 0 |
| 43990.541666666664 | 0 |
| 43990.583333333336 | 0 |
| 43990.625 | 0 |
| 43990.666666666664 | 0 |
| 43990.708333333336 | 0 |
| 43990.75 | 0 |
| 43990.791666666664 | 0 |
| 43990.833333333336 | 0 |
| 43990.875 | 0 |
| 43990.916666666664 | 0 |
| 43990.958333333336 | 0 |
| 43991.0 | 0 |
| 43991.041666666664 | 0 |
| 43991.083333333336 | 0 |
| 43991.125 | 0 |
| 43991.166666666664 | 0 |
| 43991.208333333336 | 0 |
| 43991.25 | 0 |
| 43991.291666666664 | 0 |
| 43991.333333333336 | 0 |
| 43991.375 | 0 |
| 43991.416666666664 | 0 |
| 43991.458333333336 | 0 |
| 43991.5 | 0 |
| 43991.541666666664 | 0 |
| 43991.583333333336 | 0 |
| 43991.625 | 0 |
| 43991.666666666664 | 0 |
| 43991.708333333336 | 0 |
| 43991.75 | 0 |
| 43991.791666666664 | 0 |
| 43991.833333333336 | 0 |
| 43991.875 | 0 |
| 43991.916666666664 | 0 |
| 43991.958333333336 | 0 |
| 43992.0 | 0 |
| 43992.041666666664 | 0 |
| 43992.083333333336 | 0 |
| 43992.125 | 0 |
| 43992.166666666664 | 0 |
| 43992.208333333336 | 0 |
| 43992.25 | 0 |
| 43992.291666666664 | 0 |
| 43992.333333333336 | 0 |
| 43992.375 | 0 |
| 43992.416666666664 | 0 |
| 43992.458333333336 | 0 |
| 43992.5 | 0 |
| 43992.541666666664 | 0 |
| 43992.583333333336 | 0 |
| 43992.625 | 0 |
| 43992.666666666664 | 0 |
| 43992.708333333336 | 0 |
| 43992.75 | 0 |
| 43992.791666666664 | 0 |
| 43992.833333333336 | 0 |
| 43992.875 | 0 |
| 43992.916666666664 | 0 |
| 43992.958333333336 | 0 |
| 43993.0 | 0 |
| 43993.041666666664 | 0 |
| 43993.083333333336 | 0 |
| 43993.125 | 0 |
| 43993.166666666664 | 0 |
| 43993.208333333336 | 0 |
| 43993.25 | 0 |
| 43993.291666666664 | 0 |
| 43993.333333333336 | 0 |
| 43993.375 | 0 |
| 43993.416666666664 | 0 |
| 43993.458333333336 | 0 |
| 43993.5 | 0 |
| 43993.541666666664 | 0 |
| 43993.583333333336 | 0 |
| 43993.625 | 0 |
| 43993.666666666664 | 0 |
| 43993.708333333336 | 0 |
| 43993.75 | 0 |
| 43993.791666666664 | 0 |
| 43993.833333333336 | 0 |
| 43993.875 | 0 |
| 43993.916666666664 | 0 |
| 43993.958333333336 | 0 |
| 43994.0 | 0 |
| 43994.041666666664 | 0 |
| 43994.083333333336 | 0 |
| 43994.125 | 0 |
| 43994.166666666664 | 0 |
| 43994.208333333336 | 0 |
| 43994.25 | 0 |
| 43994.291666666664 | 0 |
| 43994.333333333336 | 0 |
| 43994.375 | 0 |
| 43994.416666666664 | 0 |
| 43994.458333333336 | 0 |
| 43994.5 | 0 |
| 43994.541666666664 | 0 |
| 43994.583333333336 | 0 |
| 43994.625 | 0 |
| 43994.666666666664 | 0 |
| 43994.708333333336 | 0 |
| 43994.75 | 0 |
| 43994.791666666664 | 0 |
| 43994.833333333336 | 0 |
| 43994.875 | 0 |
| 43994.916666666664 | 0 |
| 43994.958333333336 | 0 |
| 43995.0 | 0 |
| 43995.041666666664 | 0 |
| 43995.083333333336 | 0 |
| 43995.125 | 0 |
| 43995.166666666664 | 0 |
| 43995.208333333336 | 0 |
| 43995.25 | 0 |
| 43995.291666666664 | 0 |
| 43995.333333333336 | 0 |
| 43995.375 | 0 |
| 43995.416666666664 | 0 |
| 43995.458333333336 | 0 |
| 43995.5 | 0 |
| 43995.541666666664 | 0 |
| 43995.583333333336 | 0 |
| 43995.625 | 0 |
| 43995.666666666664 | 0 |
| 43995.708333333336 | 0 |
| 43995.75 | 0 |
| 43995.791666666664 | 0 |
| 43995.833333333336 | 0 |
| 43995.875 | 0 |
| 43995.916666666664 | 0 |
| 43995.958333333336 | 0 |
| 43996.0 | 0 |
| 43996.041666666664 | 0 |
| 43996.083333333336 | 0 |
| 43996.125 | 0 |
| 43996.166666666664 | 0 |
| 43996.208333333336 | 0 |
| 43996.25 | 0 |
| 43996.291666666664 | 0 |
| 43996.333333333336 | 0 |
| 43996.375 | 0 |
| 43996.416666666664 | 0 |
| 43996.458333333336 | 0 |
| 43996.5 | 0 |
| 43996.541666666664 | 0 |
| 43996.583333333336 | 0 |
| 43996.625 | 0 |
| 43996.666666666664 | 0 |
| 43996.708333333336 | 0 |
| 43996.75 | 0 |
| 43996.791666666664 | 0 |
| 43996.833333333336 | 0 |
| 43996.875 | 0 |
| 43996.916666666664 | 0 |
| 43996.958333333336 | 0 |
| 43997.0 | 0 |
| 43997.041666666664 | 0 |
| 43997.083333333336 | 0 |
| 43997.125 | 0 |
| 43997.166666666664 | 0 |
| 43997.208333333336 | 0 |
| 43997.25 | 0 |
| 43997.291666666664 | 0 |
| 43997.333333333336 | 0 |
| 43997.375 | 0 |
| 43997.416666666664 | 0 |
| 43997.458333333336 | 0 |
| 43997.5 | 0 |
| 43997.541666666664 | 0 |
| 43997.583333333336 | 0 |
| 43997.625 | 0 |
| 43997.666666666664 | 0 |
| 43997.708333333336 | 0 |
| 43997.75 | 0 |
| 43997.791666666664 | 0 |
| 43997.833333333336 | 0 |
| 43997.875 | 0 |
| 43997.916666666664 | 0 |
| 43997.958333333336 | 0 |
| 43998.0 | 0 |
| 43998.041666666664 | 0 |
| 43998.083333333336 | 0 |
| 43998.125 | 0 |
| 43998.166666666664 | 0 |
| 43998.208333333336 | 0 |
| 43998.25 | 0 |
| 43998.291666666664 | 0 |
| 43998.333333333336 | 0 |
| 43998.375 | 0 |
| 43998.416666666664 | 0 |
| 43998.458333333336 | 0 |
| 43998.5 | 0 |
| 43998.541666666664 | 0 |
| 43998.583333333336 | 0 |
| 43998.625 | 0 |
| 43998.666666666664 | 0 |
| 43998.708333333336 | 0 |
| 43998.75 | 0 |
| 43998.791666666664 | 0 |
| 43998.833333333336 | 0 |
| 43998.875 | 0 |
| 43998.916666666664 | 0 |
| 43998.958333333336 | 0 |
| 43999.0 | 0 |
| 43999.041666666664 | 0 |
| 43999.083333333336 | 0 |
| 43999.125 | 0 |
| 43999.166666666664 | 0 |
| 43999.208333333336 | 0 |
| 43999.25 | 0 |
| 43999.291666666664 | 0 |
| 43999.333333333336 | 0 |
| 43999.375 | 0 |
| 43999.416666666664 | 0 |
| 43999.458333333336 | 0 |
| 43999.5 | 0 |
| 43999.541666666664 | 0 |
| 43999.583333333336 | 0 |
| 43999.625 | 0 |
| 43999.666666666664 | 0 |
| 43999.708333333336 | 0 |
| 43999.75 | 0 |
| 43999.791666666664 | 0 |
| 43999.833333333336 | 0 |
| 43999.875 | 0 |
| 43999.916666666664 | 0 |
| 43999.958333333336 | 0 |
| 44000.0 | 0 |
| 44000.041666666664 | 0 |
| 44000.083333333336 | 0 |
| 44000.125 | 0 |
| 44000.166666666664 | 0 |
| 44000.208333333336 | 0 |
| 44000.25 | 0 |
| 44000.291666666664 | 0 |
| 44000.333333333336 | 0 |
| 44000.375 | 0 |
| 44000.416666666664 | 0 |
| 44000.458333333336 | 0 |
| 44000.5 | 0 |
| 44000.541666666664 | 0 |
| 44000.583333333336 | 0 |
| 44000.625 | 0 |
| 44000.666666666664 | 0 |
| 44000.708333333336 | 0 |
| 44000.75 | 0 |
| 44000.791666666664 | 0 |
| 44000.833333333336 | 0 |
| 44000.875 | 0 |
| 44000.916666666664 | 0 |
| 44000.958333333336 | 0 |
| 44001.0 | 0 |
| 44001.041666666664 | 0 |
| 44001.083333333336 | 0 |
| 44001.125 | 0 |
| 44001.166666666664 | 0 |
| 44001.208333333336 | 0 |
| 44001.25 | 0 |
| 44001.291666666664 | 0 |
| 44001.333333333336 | 0 |
| 44001.375 | 0 |
| 44001.416666666664 | 0 |
| 44001.458333333336 | 0 |
| 44001.5 | 0 |
| 44001.541666666664 | 0 |
| 44001.583333333336 | 0 |
| 44001.625 | 0 |
| 44001.666666666664 | 0 |
| 44001.708333333336 | 0 |
| 44001.75 | 0 |
| 44001.791666666664 | 0 |
| 44001.833333333336 | 0 |
| 44001.875 | 0 |
| 44001.916666666664 | 0 |
| 44001.958333333336 | 0 |
| 44002.0 | 0 |
| 44002.041666666664 | 0 |
| 44002.083333333336 | 0 |
| 44002.125 | 0 |
| 44002.166666666664 | 0 |
| 44002.208333333336 | 0 |
| 44002.25 | 0 |
| 44002.291666666664 | 0 |
| 44002.333333333336 | 0 |
| 44002.375 | 0 |
| 44002.416666666664 | 0 |
| 44002.458333333336 | 0 |
| 44002.5 | 0 |
| 44002.541666666664 | 0 |
| 44002.583333333336 | 0 |
| 44002.625 | 0 |
| 44002.666666666664 | 0 |
| 44002.708333333336 | 0 |
| 44002.75 | 0 |
| 44002.791666666664 | 0 |
| 44002.833333333336 | 0 |
| 44002.875 | 0 |
| 44002.916666666664 | 0 |
| 44002.958333333336 | 0 |
| 44003.0 | 0 |
| 44003.041666666664 | 0 |
| 44003.083333333336 | 0 |
| 44003.125 | 0 |
| 44003.166666666664 | 0 |
| 44003.208333333336 | 0 |
| 44003.25 | 0 |
| 44003.291666666664 | 0 |
| 44003.333333333336 | 0 |
| 44003.375 | 0 |
| 44003.416666666664 | 0 |
| 44003.458333333336 | 0 |
| 44003.5 | 0 |
| 44003.541666666664 | 0 |
| 44003.583333333336 | 0 |
| 44003.625 | 0 |
| 44003.666666666664 | 0 |
| 44003.708333333336 | 0 |
| 44003.75 | 0 |
| 44003.791666666664 | 0 |
| 44003.833333333336 | 0 |
| 44003.875 | 0 |
| 44003.916666666664 | 0 |
| 44003.958333333336 | 0 |
| 44004.0 | 0 |
| 44004.041666666664 | 0 |
| 44004.083333333336 | 0 |
| 44004.125 | 0 |
| 44004.166666666664 | 0 |
| 44004.208333333336 | 0 |
| 44004.25 | 0 |
| 44004.291666666664 | 0 |
| 44004.333333333336 | 0 |
| 44004.375 | 0 |
| 44004.416666666664 | 0 |
| 44004.458333333336 | 0 |
| 44004.5 | 0 |
| 44004.541666666664 | 0 |
| 44004.583333333336 | 0 |
| 44004.625 | 0 |
| 44004.666666666664 | 0 |
| 44004.708333333336 | 0 |
| 44004.75 | 0 |
| 44004.791666666664 | 0 |
| 44004.833333333336 | 0 |
| 44004.875 | 0 |
| 44004.916666666664 | 0 |
| 44004.958333333336 | 0 |
| 44005.0 | 0 |
| 44005.041666666664 | 0 |
| 44005.083333333336 | 0 |
| 44005.125 | 0 |
| 44005.166666666664 | 0 |
| 44005.208333333336 | 0 |
| 44005.25 | 0 |
| 44005.291666666664 | 0 |
| 44005.333333333336 | 0 |
| 44005.375 | 0 |
| 44005.416666666664 | 0 |
| 44005.458333333336 | 0 |
| 44005.5 | 0 |
| 44005.541666666664 | 0 |
| 44005.583333333336 | 0 |
| 44005.625 | 0 |
| 44005.666666666664 | 0 |
| 44005.708333333336 | 0 |
| 44005.75 | 0 |
| 44005.791666666664 | 0 |
| 44005.833333333336 | 0 |
| 44005.875 | 0 |
| 44005.916666666664 | 0 |
| 44005.958333333336 | 0 |
| 44006.0 | 0 |
| 44006.041666666664 | 0 |
| 44006.083333333336 | 0 |
| 44006.125 | 0 |
| 44006.166666666664 | 0 |
| 44006.208333333336 | 0 |
| 44006.25 | 0 |
| 44006.291666666664 | 0 |
| 44006.333333333336 | 0 |
| 44006.375 | 0 |
| 44006.416666666664 | 0 |
| 44006.458333333336 | 0 |
| 44006.5 | 0 |
| 44006.541666666664 | 0 |
| 44006.583333333336 | 0 |
| 44006.625 | 0 |
| 44006.666666666664 | 0 |
| 44006.708333333336 | 0 |
| 44006.75 | 0 |
| 44006.791666666664 | 0 |
| 44006.833333333336 | 0 |
| 44006.875 | 0 |
| 44006.916666666664 | 0 |
| 44006.958333333336 | 0 |
| 44007.0 | 0 |
| 44007.041666666664 | 0 |
| 44007.083333333336 | 0 |
| 44007.125 | 0 |
| 44007.166666666664 | 0 |
| 44007.208333333336 | 0 |
| 44007.25 | 0 |
| 44007.291666666664 | 0 |
| 44007.333333333336 | 0 |
| 44007.375 | 0 |
| 44007.416666666664 | 0 |
| 44007.458333333336 | 0 |
| 44007.5 | 0 |
| 44007.541666666664 | 0 |
| 44007.583333333336 | 0 |
| 44007.625 | 0 |
| 44007.666666666664 | 0 |
| 44007.708333333336 | 0 |
| 44007.75 | 0 |
| 44007.791666666664 | 0 |
| 44007.833333333336 | 0 |
| 44007.875 | 0 |
| 44007.916666666664 | 0 |
| 44007.958333333336 | 0 |
| 44008.0 | 0 |
| 44008.041666666664 | 0 |
| 44008.083333333336 | 0 |
| 44008.125 | 0 |
| 44008.166666666664 | 0 |
| 44008.208333333336 | 0 |
| 44008.25 | 0 |
| 44008.291666666664 | 0 |
| 44008.333333333336 | 0 |
| 44008.375 | 0 |
| 44008.416666666664 | 0 |
| 44008.458333333336 | 0 |
| 44008.5 | 0 |
| 44008.541666666664 | 0 |
| 44008.583333333336 | 0 |
| 44008.625 | 0 |
| 44008.666666666664 | 0 |
| 44008.708333333336 | 0 |
| 44008.75 | 0 |
| 44008.791666666664 | 0 |
| 44008.833333333336 | 0 |
| 44008.875 | 0 |
| 44008.916666666664 | 0 |
| 44008.958333333336 | 0 |
| 44009.0 | 0 |
| 44009.041666666664 | 0 |
| 44009.083333333336 | 0 |
| 44009.125 | 0 |
| 44009.166666666664 | 0 |
| 44009.208333333336 | 0 |
| 44009.25 | 0 |
| 44009.291666666664 | 0 |
| 44009.333333333336 | 0 |
| 44009.375 | 0 |
| 44009.416666666664 | 0 |
| 44009.458333333336 | 0 |
| 44009.5 | 0 |
| 44009.541666666664 | 0 |
| 44009.583333333336 | 0 |
| 44009.625 | 0 |
| 44009.666666666664 | 0 |
| 44009.708333333336 | 0 |
| 44009.75 | 0 |
| 44009.791666666664 | 0 |
| 44009.833333333336 | 0 |
| 44009.875 | 0 |
| 44009.916666666664 | 0 |
| 44009.958333333336 | 0 |
| 44010.0 | 0 |
| 44010.041666666664 | 0 |
| 44010.083333333336 | 0 |
| 44010.125 | 0 |
| 44010.166666666664 | 0 |
| 44010.208333333336 | 0 |
| 44010.25 | 0 |
| 44010.291666666664 | 0 |
| 44010.333333333336 | 0 |
| 44010.375 | 0 |
| 44010.416666666664 | 0 |
| 44010.458333333336 | 0 |
| 44010.5 | 0 |
| 44010.541666666664 | 0 |
| 44010.583333333336 | 0 |
| 44010.625 | 0 |
| 44010.666666666664 | 0 |
| 44010.708333333336 | 0 |
| 44010.75 | 0 |
| 44010.791666666664 | 0 |
| 44010.833333333336 | 0 |
| 44010.875 | 0 |
| 44010.916666666664 | 0 |
| 44010.958333333336 | 0 |
| 44011.0 | 0 |
| 44011.041666666664 | 0 |
| 44011.083333333336 | 0 |
| 44011.125 | 0 |
| 44011.166666666664 | 0 |
| 44011.208333333336 | 0 |
| 44011.25 | 0 |
| 44011.291666666664 | 0 |
| 44011.333333333336 | 0 |
| 44011.375 | 0 |
| 44011.416666666664 | 0 |
| 44011.458333333336 | 0 |
| 44011.5 | 0 |
| 44011.541666666664 | 0 |
| 44011.583333333336 | 0 |
| 44011.625 | 0 |
| 44011.666666666664 | 0 |
| 44011.708333333336 | 0 |
| 44011.75 | 0 |
| 44011.791666666664 | 0 |
| 44011.833333333336 | 0 |
| 44011.875 | 0 |
| 44011.916666666664 | 0 |
| 44011.958333333336 | 0 |
| 44012.0 | 0 |
| 44012.041666666664 | 0 |
| 44012.083333333336 | 0 |
| 44012.125 | 0 |
| 44012.166666666664 | 0 |
| 44012.208333333336 | 0 |
| 44012.25 | 0 |
| 44012.291666666664 | 0 |
| 44012.333333333336 | 0 |
| 44012.375 | 0 |
| 44012.416666666664 | 0 |
| 44012.458333333336 | 0 |
| 44012.5 | 0 |
| 44012.541666666664 | 0 |
| 44012.583333333336 | 0 |
| 44012.625 | 0 |
| 44012.666666666664 | 0 |
| 44012.708333333336 | 0 |
| 44012.75 | 0 |
| 44012.791666666664 | 0 |
| 44012.833333333336 | 0 |
| 44012.875 | 0 |
| 44012.916666666664 | 0 |
| 44012.958333333336 | 0 |
| 44013.0 | 0 |
| 44013.041666666664 | 0 |
| 44013.083333333336 | 0 |
| 44013.125 | 0 |
| 44013.166666666664 | 0 |
| 44013.208333333336 | 0 |
| 44013.25 | 0 |
| 44013.291666666664 | 0 |
| 44013.333333333336 | 0 |
| 44013.375 | 0 |
| 44013.416666666664 | 0 |
| 44013.458333333336 | 0 |
| 44013.5 | 0 |
| 44013.541666666664 | 0 |
| 44013.583333333336 | 0 |
| 44013.625 | 0 |
| 44013.666666666664 | 0 |
| 44013.708333333336 | 0 |
| 44013.75 | 0 |
| 44013.791666666664 | 0 |
| 44013.833333333336 | 0 |
| 44013.875 | 0 |
| 44013.916666666664 | 0 |
| 44013.958333333336 | 0 |
| 44014.0 | 0 |
| 44014.041666666664 | 0 |
| 44014.083333333336 | 0 |
| 44014.125 | 0 |
| 44014.166666666664 | 0 |
| 44014.208333333336 | 0 |
| 44014.25 | 0 |
| 44014.291666666664 | 0 |
| 44014.333333333336 | 0 |
| 44014.375 | 0 |
| 44014.416666666664 | 0 |
| 44014.458333333336 | 0 |
| 44014.5 | 0 |
| 44014.541666666664 | 0 |
| 44014.583333333336 | 0 |
| 44014.625 | 0 |
| 44014.666666666664 | 0 |
| 44014.708333333336 | 0 |
| 44014.75 | 0 |
| 44014.791666666664 | 0 |
| 44014.833333333336 | 0 |
| 44014.875 | 0 |
| 44014.916666666664 | 0 |
| 44014.958333333336 | 0 |
| 44015.0 | 0 |
| 44015.041666666664 | 0 |
| 44015.083333333336 | 0 |
| 44015.125 | 0 |
| 44015.166666666664 | 0 |
| 44015.208333333336 | 0 |
| 44015.25 | 0 |
| 44015.291666666664 | 0 |
| 44015.333333333336 | 0 |
| 44015.375 | 0 |
| 44015.416666666664 | 0 |
| 44015.458333333336 | 0 |
| 44015.5 | 0 |
| 44015.541666666664 | 0 |
| 44015.583333333336 | 0 |
| 44015.625 | 0 |
| 44015.666666666664 | 0 |
| 44015.708333333336 | 0 |
| 44015.75 | 0 |
| 44015.791666666664 | 0 |
| 44015.833333333336 | 0 |
| 44015.875 | 0 |
| 44015.916666666664 | 0 |
| 44015.958333333336 | 0 |
| 44016.0 | 0 |
| 44016.041666666664 | 0 |
| 44016.083333333336 | 0 |
| 44016.125 | 0 |
| 44016.166666666664 | 0 |
| 44016.208333333336 | 0 |
| 44016.25 | 0 |
| 44016.291666666664 | 0 |
| 44016.333333333336 | 0 |
| 44016.375 | 0 |
| 44016.416666666664 | 0 |
| 44016.458333333336 | 0 |
| 44016.5 | 0 |
| 44016.541666666664 | 0 |
| 44016.583333333336 | 0 |
| 44016.625 | 0 |
| 44016.666666666664 | 0 |
| 44016.708333333336 | 0 |
| 44016.75 | 0 |
| 44016.791666666664 | 0 |
| 44016.833333333336 | 0 |
| 44016.875 | 0 |
| 44016.916666666664 | 0 |
| 44016.958333333336 | 0 |
| 44017.0 | 0 |
| 44017.041666666664 | 0 |
| 44017.083333333336 | 0 |
| 44017.125 | 0 |
| 44017.166666666664 | 0 |
| 44017.208333333336 | 0 |
| 44017.25 | 0 |
| 44017.291666666664 | 0 |
| 44017.333333333336 | 0 |
| 44017.375 | 0 |
| 44017.416666666664 | 0 |
| 44017.458333333336 | 0 |
| 44017.5 | 0 |
| 44017.541666666664 | 0 |
| 44017.583333333336 | 0 |
| 44017.625 | 0 |
| 44017.666666666664 | 0 |
| 44017.708333333336 | 0 |
| 44017.75 | 0 |
| 44017.791666666664 | 0 |
| 44017.833333333336 | 0 |
| 44017.875 | 0 |
| 44017.916666666664 | 0 |
| 44017.958333333336 | 0 |
| 44018.0 | 0 |
| 44018.041666666664 | 0 |
| 44018.083333333336 | 0 |
| 44018.125 | 0 |
| 44018.166666666664 | 0 |
| 44018.208333333336 | 0 |
| 44018.25 | 0 |
| 44018.291666666664 | 0 |
| 44018.333333333336 | 0 |
| 44018.375 | 0 |
| 44018.416666666664 | 0 |
| 44018.458333333336 | 0 |
| 44018.5 | 0 |
| 44018.541666666664 | 0 |
| 44018.583333333336 | 0 |
| 44018.625 | 0 |
| 44018.666666666664 | 0 |
| 44018.708333333336 | 0 |
| 44018.75 | 0 |
| 44018.791666666664 | 0 |
| 44018.833333333336 | 0 |
| 44018.875 | 0 |
| 44018.916666666664 | 0 |
| 44018.958333333336 | 0 |
| 44019.0 | 0 |
| 44019.041666666664 | 0 |
| 44019.083333333336 | 0 |
| 44019.125 | 0 |
| 44019.166666666664 | 0 |
| 44019.208333333336 | 0 |
| 44019.25 | 0 |
| 44019.291666666664 | 0 |
| 44019.333333333336 | 0 |
| 44019.375 | 0 |
| 44019.416666666664 | 0 |
| 44019.458333333336 | 0 |
| 44019.5 | 0 |
| 44019.541666666664 | 0 |
| 44019.583333333336 | 0 |
| 44019.625 | 0 |
| 44019.666666666664 | 0 |
| 44019.708333333336 | 0 |
| 44019.75 | 0 |
| 44019.791666666664 | 0 |
| 44019.833333333336 | 0 |
| 44019.875 | 0 |
| 44019.916666666664 | 0 |
| 44019.958333333336 | 0 |
| 44020.0 | 0 |
| 44020.041666666664 | 0 |
| 44020.083333333336 | 0 |
| 44020.125 | 0 |
| 44020.166666666664 | 0 |
| 44020.208333333336 | 0 |
| 44020.25 | 0 |
| 44020.291666666664 | 0 |
| 44020.333333333336 | 0 |
| 44020.375 | 0 |
| 44020.416666666664 | 0 |
| 44020.458333333336 | 0 |
| 44020.5 | 0 |
| 44020.541666666664 | 0 |
| 44020.583333333336 | 0 |
| 44020.625 | 0 |
| 44020.666666666664 | 0 |
| 44020.708333333336 | 0 |
| 44020.75 | 0 |
| 44020.791666666664 | 0 |
| 44020.833333333336 | 0 |
| 44020.875 | 0 |
| 44020.916666666664 | 0 |
| 44020.958333333336 | 0 |
| 44021.0 | 0 |
| 44021.041666666664 | 0 |
| 44021.083333333336 | 0 |
| 44021.125 | 0 |
| 44021.166666666664 | 0 |
| 44021.208333333336 | 0 |
| 44021.25 | 0 |
| 44021.291666666664 | 0 |
| 44021.333333333336 | 0 |
| 44021.375 | 0 |
| 44021.416666666664 | 0 |
| 44021.458333333336 | 0 |
| 44021.5 | 0 |
| 44021.541666666664 | 0 |
| 44021.583333333336 | 0 |
| 44021.625 | 0 |
| 44021.666666666664 | 0 |
| 44021.708333333336 | 0 |
| 44021.75 | 0 |
| 44021.791666666664 | 0 |
| 44021.833333333336 | 0 |
| 44021.875 | 0 |
| 44021.916666666664 | 0 |
| 44021.958333333336 | 0 |
| 44022.0 | 0 |
| 44022.041666666664 | 0 |
| 44022.083333333336 | 0 |
| 44022.125 | 0 |
| 44022.166666666664 | 0 |
| 44022.208333333336 | 0 |
| 44022.25 | 0 |
| 44022.291666666664 | 0 |
| 44022.333333333336 | 0 |
| 44022.375 | 0 |
| 44022.416666666664 | 0 |
| 44022.458333333336 | 0 |
| 44022.5 | 0 |
| 44022.541666666664 | 0 |
| 44022.583333333336 | 0 |
| 44022.625 | 0 |
| 44022.666666666664 | 0 |
| 44022.708333333336 | 0 |
| 44022.75 | 0 |
| 44022.791666666664 | 0 |
| 44022.833333333336 | 0 |
| 44022.875 | 0 |
| 44022.916666666664 | 0 |
| 44022.958333333336 | 0 |
| 44023.0 | 0 |
| 44023.041666666664 | 0 |
| 44023.083333333336 | 0 |
| 44023.125 | 0 |
| 44023.166666666664 | 0 |
| 44023.208333333336 | 0 |
| 44023.25 | 0 |
| 44023.291666666664 | 0 |
| 44023.333333333336 | 0 |
| 44023.375 | 0 |
| 44023.416666666664 | 0 |
| 44023.458333333336 | 0 |
| 44023.5 | 0 |
| 44023.541666666664 | 0 |
| 44023.583333333336 | 0 |
| 44023.625 | 0 |
| 44023.666666666664 | 0 |
| 44023.708333333336 | 0 |
| 44023.75 | 0 |
| 44023.791666666664 | 0 |
| 44023.833333333336 | 0 |
| 44023.875 | 0 |
| 44023.916666666664 | 0 |
| 44023.958333333336 | 0 |
| 44024.0 | 0 |
| 44024.041666666664 | 0 |
| 44024.083333333336 | 0 |
| 44024.125 | 0 |
| 44024.166666666664 | 0 |
| 44024.208333333336 | 0 |
| 44024.25 | 0 |
| 44024.291666666664 | 0 |
| 44024.333333333336 | 0 |
| 44024.375 | 0 |
| 44024.416666666664 | 0 |
| 44024.458333333336 | 0 |
| 44024.5 | 0 |
| 44024.541666666664 | 0 |
| 44024.583333333336 | 0 |
| 44024.625 | 0 |
| 44024.666666666664 | 0 |
| 44024.708333333336 | 0 |
| 44024.75 | 0 |
| 44024.791666666664 | 0 |
| 44024.833333333336 | 0 |
| 44024.875 | 0 |
| 44024.916666666664 | 0 |
| 44024.958333333336 | 0 |
| 44025.0 | 0 |
| 44025.041666666664 | 0 |
| 44025.083333333336 | 0 |
| 44025.125 | 0 |
| 44025.166666666664 | 0 |
| 44025.208333333336 | 0 |
| 44025.25 | 0 |
| 44025.291666666664 | 0 |
| 44025.333333333336 | 0 |
| 44025.375 | 0 |
| 44025.416666666664 | 0 |
| 44025.458333333336 | 0 |
| 44025.5 | 0 |
| 44025.541666666664 | 0 |
| 44025.583333333336 | 0 |
| 44025.625 | 0 |
| 44025.666666666664 | 0 |
| 44025.708333333336 | 0 |
| 44025.75 | 0 |
| 44025.791666666664 | 0 |
| 44025.833333333336 | 0 |
| 44025.875 | 0 |
| 44025.916666666664 | 0 |
| 44025.958333333336 | 0 |
| 44026.0 | 0 |
| 44026.041666666664 | 0 |
| 44026.083333333336 | 0 |
| 44026.125 | 0 |
| 44026.166666666664 | 0 |
| 44026.208333333336 | 0 |
| 44026.25 | 0 |
| 44026.291666666664 | 0 |
| 44026.333333333336 | 0 |
| 44026.375 | 0 |
| 44026.416666666664 | 0 |
| 44026.458333333336 | 0 |
| 44026.5 | 0 |
| 44026.541666666664 | 0 |
| 44026.583333333336 | 0 |
| 44026.625 | 0 |
| 44026.666666666664 | 0 |
| 44026.708333333336 | 0 |
| 44026.75 | 0 |
| 44026.791666666664 | 0 |
| 44026.833333333336 | 0 |
| 44026.875 | 0 |
| 44026.916666666664 | 0 |
| 44026.958333333336 | 0 |
| 44027.0 | 0 |
| 44027.041666666664 | 0 |
| 44027.083333333336 | 0 |
| 44027.125 | 0 |
| 44027.166666666664 | 0 |
| 44027.208333333336 | 0 |
| 44027.25 | 0 |
| 44027.291666666664 | 0 |
| 44027.333333333336 | 0 |
| 44027.375 | 0 |
| 44027.416666666664 | 0 |
| 44027.458333333336 | 0 |
| 44027.5 | 0 |
| 44027.541666666664 | 0 |
| 44027.583333333336 | 0 |
| 44027.625 | 0 |
| 44027.666666666664 | 0 |
| 44027.708333333336 | 0 |
| 44027.75 | 0 |
| 44027.791666666664 | 0 |
| 44027.833333333336 | 0 |
| 44027.875 | 0 |
| 44027.916666666664 | 0 |
| 44027.958333333336 | 0 |
| 44028.0 | 0 |
| 44028.041666666664 | 0 |
| 44028.083333333336 | 0 |
| 44028.125 | 0 |
| 44028.166666666664 | 0 |
| 44028.208333333336 | 0 |
| 44028.25 | 0 |
| 44028.291666666664 | 0 |
| 44028.333333333336 | 0 |
| 44028.375 | 0 |
| 44028.416666666664 | 0 |
| 44028.458333333336 | 0 |
| 44028.5 | 0 |
| 44028.541666666664 | 0 |
| 44028.583333333336 | 0 |
| 44028.625 | 0 |
| 44028.666666666664 | 0 |
| 44028.708333333336 | 0 |
| 44028.75 | 0 |
| 44028.791666666664 | 0 |
| 44028.833333333336 | 0 |
| 44028.875 | 0 |
| 44028.916666666664 | 0 |
| 44028.958333333336 | 0 |
| 44029.0 | 0 |
| 44029.041666666664 | 0 |
| 44029.083333333336 | 0 |
| 44029.125 | 0 |
| 44029.166666666664 | 0 |
| 44029.208333333336 | 0 |
| 44029.25 | 0 |
| 44029.291666666664 | 0 |
| 44029.333333333336 | 0 |
| 44029.375 | 0 |
| 44029.416666666664 | 0 |
| 44029.458333333336 | 0 |
| 44029.5 | 0 |
| 44029.541666666664 | 0 |
| 44029.583333333336 | 0 |
| 44029.625 | 0 |
| 44029.666666666664 | 0 |
| 44029.708333333336 | 0 |
| 44029.75 | 0 |
| 44029.791666666664 | 0 |
| 44029.833333333336 | 0 |
| 44029.875 | 0 |
| 44029.916666666664 | 0 |
| 44029.958333333336 | 0 |
| 44030.0 | 0 |
| 44030.041666666664 | 0 |
| 44030.083333333336 | 0 |
| 44030.125 | 0 |
| 44030.166666666664 | 0 |
| 44030.208333333336 | 0 |
| 44030.25 | 0 |
| 44030.291666666664 | 0 |
| 44030.333333333336 | 0 |
| 44030.375 | 0 |
| 44030.416666666664 | 0 |
| 44030.458333333336 | 0 |
| 44030.5 | 0 |
| 44030.541666666664 | 0 |
| 44030.583333333336 | 0 |
| 44030.625 | 0 |
| 44030.666666666664 | 0 |
| 44030.708333333336 | 0 |
| 44030.75 | 0 |
| 44030.791666666664 | 0 |
| 44030.833333333336 | 0 |
| 44030.875 | 0 |
| 44030.916666666664 | 0 |
| 44030.958333333336 | 0 |
| 44031.0 | 0 |
| 44031.041666666664 | 0 |
| 44031.083333333336 | 0 |
| 44031.125 | 0 |
| 44031.166666666664 | 0 |
| 44031.208333333336 | 0 |
| 44031.25 | 0 |
| 44031.291666666664 | 0 |
| 44031.333333333336 | 0 |
| 44031.375 | 0 |
| 44031.416666666664 | 0 |
| 44031.458333333336 | 0 |
| 44031.5 | 0 |
| 44031.541666666664 | 0 |
| 44031.583333333336 | 0 |
| 44031.625 | 0 |
| 44031.666666666664 | 0 |
| 44031.708333333336 | 0 |
| 44031.75 | 0 |
| 44031.791666666664 | 0 |
| 44031.833333333336 | 0 |
| 44031.875 | 0 |
| 44031.916666666664 | 0 |
| 44031.958333333336 | 0 |
| 44032.0 | 0 |
| 44032.041666666664 | 0 |
| 44032.083333333336 | 0 |
| 44032.125 | 0 |
| 44032.166666666664 | 0 |
| 44032.208333333336 | 0 |
| 44032.25 | 0 |
| 44032.291666666664 | 0 |
| 44032.333333333336 | 0 |
| 44032.375 | 0 |
| 44032.416666666664 | 0 |
| 44032.458333333336 | 0 |
| 44032.5 | 0 |
| 44032.541666666664 | 0 |
| 44032.583333333336 | 0 |
| 44032.625 | 0 |
| 44032.666666666664 | 0 |
| 44032.708333333336 | 0 |
| 44032.75 | 0 |
| 44032.791666666664 | 0 |
| 44032.833333333336 | 0 |
| 44032.875 | 0 |
| 44032.916666666664 | 0 |
| 44032.958333333336 | 0 |
| 44033.0 | 0 |
| 44033.041666666664 | 0 |
| 44033.083333333336 | 0 |
| 44033.125 | 0 |
| 44033.166666666664 | 0 |
| 44033.208333333336 | 0 |
| 44033.25 | 0 |
| 44033.291666666664 | 0 |
| 44033.333333333336 | 0 |
| 44033.375 | 0 |
| 44033.416666666664 | 0 |
| 44033.458333333336 | 0 |
| 44033.5 | 0 |
| 44033.541666666664 | 0 |
| 44033.583333333336 | 0 |
| 44033.625 | 0 |
| 44033.666666666664 | 0 |
| 44033.708333333336 | 0 |
| 44033.75 | 0 |
| 44033.791666666664 | 0 |
| 44033.833333333336 | 0 |
| 44033.875 | 0 |
| 44033.916666666664 | 0 |
| 44033.958333333336 | 0 |
| 44034.0 | 0 |
| 44034.041666666664 | 0 |
| 44034.083333333336 | 0 |
| 44034.125 | 0 |
| 44034.166666666664 | 0 |
| 44034.208333333336 | 0 |
| 44034.25 | 0 |
| 44034.291666666664 | 0 |
| 44034.333333333336 | 0 |
| 44034.375 | 0 |
| 44034.416666666664 | 0 |
| 44034.458333333336 | 0 |
| 44034.5 | 0 |
| 44034.541666666664 | 0 |
| 44034.583333333336 | 0 |
| 44034.625 | 0 |
| 44034.666666666664 | 0 |
| 44034.708333333336 | 0 |
| 44034.75 | 0 |
| 44034.791666666664 | 0 |
| 44034.833333333336 | 0 |
| 44034.875 | 0 |
| 44034.916666666664 | 0 |
| 44034.958333333336 | 0 |
| 44035.0 | 0 |
| 44035.041666666664 | 0 |
| 44035.083333333336 | 0 |
| 44035.125 | 0 |
| 44035.166666666664 | 0 |
| 44035.208333333336 | 0 |
| 44035.25 | 0 |
| 44035.291666666664 | 0 |
| 44035.333333333336 | 0 |
| 44035.375 | 0 |
| 44035.416666666664 | 0 |
| 44035.458333333336 | 0 |
| 44035.5 | 0 |
| 44035.541666666664 | 0 |
| 44035.583333333336 | 0 |
| 44035.625 | 0 |
| 44035.666666666664 | 0 |
| 44035.708333333336 | 0 |
| 44035.75 | 0 |
| 44035.791666666664 | 0 |
| 44035.833333333336 | 0 |
| 44035.875 | 0 |
| 44035.916666666664 | 0 |
| 44035.958333333336 | 0 |
| 44036.0 | 0 |
| 44036.041666666664 | 0 |
| 44036.083333333336 | 0 |
| 44036.125 | 0 |
| 44036.166666666664 | 0 |
| 44036.208333333336 | 0 |
| 44036.25 | 0 |
| 44036.291666666664 | 0 |
| 44036.333333333336 | 0 |
| 44036.375 | 0 |
| 44036.416666666664 | 0 |
| 44036.458333333336 | 0 |
| 44036.5 | 0 |
| 44036.541666666664 | 0 |
| 44036.583333333336 | 0 |
| 44036.625 | 0 |
| 44036.666666666664 | 0 |
| 44036.708333333336 | 0 |
| 44036.75 | 0 |
| 44036.791666666664 | 0 |
| 44036.833333333336 | 0 |
| 44036.875 | 0 |
| 44036.916666666664 | 0 |
| 44036.958333333336 | 0 |
| 44037.0 | 0 |
| 44037.041666666664 | 0 |
| 44037.083333333336 | 0 |
| 44037.125 | 0 |
| 44037.166666666664 | 0 |
| 44037.208333333336 | 0 |
| 44037.25 | 0 |
| 44037.291666666664 | 0 |
| 44037.333333333336 | 0 |
| 44037.375 | 0 |
| 44037.416666666664 | 0 |
| 44037.458333333336 | 0 |
| 44037.5 | 0 |
| 44037.541666666664 | 0 |
| 44037.583333333336 | 0 |
| 44037.625 | 0 |
| 44037.666666666664 | 0 |
| 44037.708333333336 | 0 |
| 44037.75 | 0 |
| 44037.791666666664 | 0 |
| 44037.833333333336 | 0 |
| 44037.875 | 0 |
| 44037.916666666664 | 0 |
| 44037.958333333336 | 0 |
| 44038.0 | 0 |
| 44038.041666666664 | 0 |
| 44038.083333333336 | 0 |
| 44038.125 | 0 |
| 44038.166666666664 | 0 |
| 44038.208333333336 | 0 |
| 44038.25 | 0 |
| 44038.291666666664 | 0 |
| 44038.333333333336 | 0 |
| 44038.375 | 0 |
| 44038.416666666664 | 0 |
| 44038.458333333336 | 0 |
| 44038.5 | 0 |
| 44038.541666666664 | 0 |
| 44038.583333333336 | 0 |
| 44038.625 | 0 |
| 44038.666666666664 | 0 |
| 44038.708333333336 | 0 |
| 44038.75 | 0 |
| 44038.791666666664 | 0 |
| 44038.833333333336 | 0 |
| 44038.875 | 0 |
| 44038.916666666664 | 0 |
| 44038.958333333336 | 0 |
| 44039.0 | 0 |
| 44039.041666666664 | 0 |
| 44039.083333333336 | 0 |
| 44039.125 | 0 |
| 44039.166666666664 | 0 |
| 44039.208333333336 | 0 |
| 44039.25 | 0 |
| 44039.291666666664 | 0 |
| 44039.333333333336 | 0 |
| 44039.375 | 0 |
| 44039.416666666664 | 0 |
| 44039.458333333336 | 0 |
| 44039.5 | 0 |
| 44039.541666666664 | 0 |
| 44039.583333333336 | 0 |
| 44039.625 | 0 |
| 44039.666666666664 | 0 |
| 44039.708333333336 | 0 |
| 44039.75 | 0 |
| 44039.791666666664 | 0 |
| 44039.833333333336 | 0 |
| 44039.875 | 0 |
| 44039.916666666664 | 0 |
| 44039.958333333336 | 0 |
| 44040.0 | 0 |
| 44040.041666666664 | 0 |
| 44040.083333333336 | 0 |
| 44040.125 | 0 |
| 44040.166666666664 | 0 |
| 44040.208333333336 | 0 |
| 44040.25 | 0 |
| 44040.291666666664 | 0 |
| 44040.333333333336 | 0 |
| 44040.375 | 0 |
| 44040.416666666664 | 0 |
| 44040.458333333336 | 0 |
| 44040.5 | 0 |
| 44040.541666666664 | 0 |
| 44040.583333333336 | 0 |
| 44040.625 | 0 |
| 44040.666666666664 | 0 |
| 44040.708333333336 | 0 |
| 44040.75 | 0 |
| 44040.791666666664 | 0 |
| 44040.833333333336 | 0 |
| 44040.875 | 0 |
| 44040.916666666664 | 0 |
| 44040.958333333336 | 0 |
| 44041.0 | 0 |
| 44041.041666666664 | 0 |
| 44041.083333333336 | 0 |
| 44041.125 | 0 |
| 44041.166666666664 | 0 |
| 44041.208333333336 | 0 |
| 44041.25 | 0 |
| 44041.291666666664 | 0 |
| 44041.333333333336 | 0 |
| 44041.375 | 0 |
| 44041.416666666664 | 0 |
| 44041.458333333336 | 0 |
| 44041.5 | 0 |
| 44041.541666666664 | 0 |
| 44041.583333333336 | 0 |
| 44041.625 | 0 |
| 44041.666666666664 | 0 |
| 44041.708333333336 | 0 |
| 44041.75 | 0 |
| 44041.791666666664 | 0 |
| 44041.833333333336 | 0 |
| 44041.875 | 0 |
| 44041.916666666664 | 0 |
| 44041.958333333336 | 0 |
| 44042.0 | 0 |
| 44042.041666666664 | 0 |
| 44042.083333333336 | 0 |
| 44042.125 | 0 |
| 44042.166666666664 | 0 |
| 44042.208333333336 | 0 |
| 44042.25 | 0 |
| 44042.291666666664 | 0 |
| 44042.333333333336 | 0 |
| 44042.375 | 0 |
| 44042.416666666664 | 0 |
| 44042.458333333336 | 0 |
| 44042.5 | 0 |
| 44042.541666666664 | 0 |
| 44042.583333333336 | 0 |
| 44042.625 | 0 |
| 44042.666666666664 | 0 |
| 44042.708333333336 | 0 |
| 44042.75 | 0 |
| 44042.791666666664 | 0 |
| 44042.833333333336 | 0 |
| 44042.875 | 0 |
| 44042.916666666664 | 0 |
| 44042.958333333336 | 0 |
| 44043.0 | 0 |
| 44043.041666666664 | 0 |
| 44043.083333333336 | 0 |
| 44043.125 | 0 |
| 44043.166666666664 | 0 |
| 44043.208333333336 | 0 |
| 44043.25 | 0 |
| 44043.291666666664 | 0 |
| 44043.333333333336 | 0 |
| 44043.375 | 0 |
| 44043.416666666664 | 0 |
| 44043.458333333336 | 0 |
| 44043.5 | 0 |
| 44043.541666666664 | 0 |
| 44043.583333333336 | 0 |
| 44043.625 | 0 |
| 44043.666666666664 | 0 |
| 44043.708333333336 | 0 |
| 44043.75 | 0 |
| 44043.791666666664 | 0 |
| 44043.833333333336 | 0 |
| 44043.875 | 0 |
| 44043.916666666664 | 0 |
| 44043.958333333336 | 0 |
| 44044.0 | 0 |
| 44044.041666666664 | 0 |
| 44044.083333333336 | 0 |
| 44044.125 | 0 |
| 44044.166666666664 | 0 |
| 44044.208333333336 | 0 |
| 44044.25 | 0 |
| 44044.291666666664 | 0 |
| 44044.333333333336 | 0 |
| 44044.375 | 0 |
| 44044.416666666664 | 0 |
| 44044.458333333336 | 0 |
| 44044.5 | 0 |
| 44044.541666666664 | 0 |
| 44044.583333333336 | 0 |
| 44044.625 | 0 |
| 44044.666666666664 | 0 |
| 44044.708333333336 | 0 |
| 44044.75 | 0 |
| 44044.791666666664 | 0 |
| 44044.833333333336 | 0 |
| 44044.875 | 0 |
| 44044.916666666664 | 0 |
| 44044.958333333336 | 0 |
| 44045.0 | 0 |
| 44045.041666666664 | 0 |
| 44045.083333333336 | 0 |
| 44045.125 | 0 |
| 44045.166666666664 | 0 |
| 44045.208333333336 | 0 |
| 44045.25 | 0 |
| 44045.291666666664 | 0 |
| 44045.333333333336 | 0 |
| 44045.375 | 0 |
| 44045.416666666664 | 0 |
| 44045.458333333336 | 0 |
| 44045.5 | 0 |
| 44045.541666666664 | 0 |
| 44045.583333333336 | 0 |
| 44045.625 | 0 |
| 44045.666666666664 | 0 |
| 44045.708333333336 | 0 |
| 44045.75 | 0 |
| 44045.791666666664 | 0 |
| 44045.833333333336 | 0 |
| 44045.875 | 0 |
| 44045.916666666664 | 0 |
| 44045.958333333336 | 0 |
| 44046.0 | 0 |
| 44046.041666666664 | 0 |
| 44046.083333333336 | 0 |
| 44046.125 | 0 |
| 44046.166666666664 | 0 |
| 44046.208333333336 | 0 |
| 44046.25 | 0 |
| 44046.291666666664 | 0 |
| 44046.333333333336 | 0 |
| 44046.375 | 0 |
| 44046.416666666664 | 0 |
| 44046.458333333336 | 0 |
| 44046.5 | 0 |
| 44046.541666666664 | 0 |
| 44046.583333333336 | 0 |
| 44046.625 | 0 |
| 44046.666666666664 | 0 |
| 44046.708333333336 | 0 |
| 44046.75 | 0 |
| 44046.791666666664 | 0 |
| 44046.833333333336 | 0 |
| 44046.875 | 0 |
| 44046.916666666664 | 0 |
| 44046.958333333336 | 0 |
| 44047.0 | 0 |
| 44047.041666666664 | 0 |
| 44047.083333333336 | 0 |
| 44047.125 | 0 |
| 44047.166666666664 | 0 |
| 44047.208333333336 | 0 |
| 44047.25 | 0 |
| 44047.291666666664 | 0 |
| 44047.333333333336 | 0 |
| 44047.375 | 0 |
| 44047.416666666664 | 0 |
| 44047.458333333336 | 0 |
| 44047.5 | 0 |
| 44047.541666666664 | 0 |
| 44047.583333333336 | 0 |
| 44047.625 | 0 |
| 44047.666666666664 | 0 |
| 44047.708333333336 | 0 |
| 44047.75 | 0 |
| 44047.791666666664 | 0 |
| 44047.833333333336 | 0 |
| 44047.875 | 0 |
| 44047.916666666664 | 0 |
| 44047.958333333336 | 0 |
| 44048.0 | 0 |
| 44048.041666666664 | 0 |
| 44048.083333333336 | 0 |
| 44048.125 | 0 |
| 44048.166666666664 | 0 |
| 44048.208333333336 | 0 |
| 44048.25 | 0 |
| 44048.291666666664 | 0 |
| 44048.333333333336 | 0 |
| 44048.375 | 0 |
| 44048.416666666664 | 0 |
| 44048.458333333336 | 0 |
| 44048.5 | 0 |
| 44048.541666666664 | 0 |
| 44048.583333333336 | 0 |
| 44048.625 | 0 |
| 44048.666666666664 | 0 |
| 44048.708333333336 | 0 |
| 44048.75 | 0 |
| 44048.791666666664 | 0 |
| 44048.833333333336 | 0 |
| 44048.875 | 0 |
| 44048.916666666664 | 0 |
| 44048.958333333336 | 0 |
| 44049.0 | 0 |
| 44049.041666666664 | 0 |
| 44049.083333333336 | 0 |
| 44049.125 | 0 |
| 44049.166666666664 | 0 |
| 44049.208333333336 | 0 |
| 44049.25 | 0 |
| 44049.291666666664 | 0 |
| 44049.333333333336 | 0 |
| 44049.375 | 0 |
| 44049.416666666664 | 0 |
| 44049.458333333336 | 0 |
| 44049.5 | 0 |
| 44049.541666666664 | 0 |
| 44049.583333333336 | 0 |
| 44049.625 | 0 |
| 44049.666666666664 | 0 |
| 44049.708333333336 | 0 |
| 44049.75 | 0 |
| 44049.791666666664 | 0 |
| 44049.833333333336 | 0 |
| 44049.875 | 0 |
| 44049.916666666664 | 0 |
| 44049.958333333336 | 0 |
| 44050.0 | 0 |
| 44050.041666666664 | 0 |
| 44050.083333333336 | 0 |
| 44050.125 | 0 |
| 44050.166666666664 | 0 |
| 44050.208333333336 | 0 |
| 44050.25 | 0 |
| 44050.291666666664 | 0 |
| 44050.333333333336 | 0 |
| 44050.375 | 0 |
| 44050.416666666664 | 0 |
| 44050.458333333336 | 0 |
| 44050.5 | 0 |
| 44050.541666666664 | 0 |
| 44050.583333333336 | 0 |
| 44050.625 | 0 |
| 44050.666666666664 | 0 |
| 44050.708333333336 | 0 |
| 44050.75 | 0 |
| 44050.791666666664 | 0 |
| 44050.833333333336 | 0 |
| 44050.875 | 0 |
| 44050.916666666664 | 0 |
| 44050.958333333336 | 0 |
| 44051.0 | 0 |
| 44051.041666666664 | 0 |
| 44051.083333333336 | 0 |
| 44051.125 | 0 |
| 44051.166666666664 | 0 |
| 44051.208333333336 | 0 |
| 44051.25 | 0 |
| 44051.291666666664 | 0 |
| 44051.333333333336 | 0 |
| 44051.375 | 0 |
| 44051.416666666664 | 0 |
| 44051.458333333336 | 0 |
| 44051.5 | 0 |
| 44051.541666666664 | 0 |
| 44051.583333333336 | 0 |
| 44051.625 | 0 |
| 44051.666666666664 | 0 |
| 44051.708333333336 | 0 |
| 44051.75 | 0 |
| 44051.791666666664 | 0 |
| 44051.833333333336 | 0 |
| 44051.875 | 0 |
| 44051.916666666664 | 0 |
| 44051.958333333336 | 0 |
| 44052.0 | 0 |
| 44052.041666666664 | 0 |
| 44052.083333333336 | 0 |
| 44052.125 | 0 |
| 44052.166666666664 | 0 |
| 44052.208333333336 | 0 |
| 44052.25 | 0 |
| 44052.291666666664 | 0 |
| 44052.333333333336 | 0 |
| 44052.375 | 0 |
| 44052.416666666664 | 0 |
| 44052.458333333336 | 0 |
| 44052.5 | 0 |
| 44052.541666666664 | 0 |
| 44052.583333333336 | 0 |
| 44052.625 | 0 |
| 44052.666666666664 | 0 |
| 44052.708333333336 | 0 |
| 44052.75 | 0 |
| 44052.791666666664 | 0 |
| 44052.833333333336 | 0 |
| 44052.875 | 0 |
| 44052.916666666664 | 0 |
| 44052.958333333336 | 0 |
| 44053.0 | 0 |
| 44053.041666666664 | 0 |
| 44053.083333333336 | 0 |
| 44053.125 | 0 |
| 44053.166666666664 | 0 |
| 44053.208333333336 | 0 |
| 44053.25 | 0 |
| 44053.291666666664 | 0 |
| 44053.333333333336 | 0 |
| 44053.375 | 0 |
| 44053.416666666664 | 0 |
| 44053.458333333336 | 0 |
| 44053.5 | 0 |
| 44053.541666666664 | 0 |
| 44053.583333333336 | 0 |
| 44053.625 | 0 |
| 44053.666666666664 | 0 |
| 44053.708333333336 | 0 |
| 44053.75 | 0 |
| 44053.791666666664 | 0 |
| 44053.833333333336 | 0 |
| 44053.875 | 0 |
| 44053.916666666664 | 0 |
| 44053.958333333336 | 0 |
| 44054.0 | 0 |
| 44054.041666666664 | 0 |
| 44054.083333333336 | 0 |
| 44054.125 | 0 |
| 44054.166666666664 | 0 |
| 44054.208333333336 | 0 |
| 44054.25 | 0 |
| 44054.291666666664 | 0 |
| 44054.333333333336 | 0 |
| 44054.375 | 0 |
| 44054.416666666664 | 0 |
| 44054.458333333336 | 0 |
| 44054.5 | 0 |
| 44054.541666666664 | 0 |
| 44054.583333333336 | 0 |
| 44054.625 | 0 |
| 44054.666666666664 | 0 |
| 44054.708333333336 | 0 |
| 44054.75 | 0 |
| 44054.791666666664 | 0 |
| 44054.833333333336 | 0 |
| 44054.875 | 0 |
| 44054.916666666664 | 0 |
| 44054.958333333336 | 0 |
| 44055.0 | 0 |
| 44055.041666666664 | 0 |
| 44055.083333333336 | 0 |
| 44055.125 | 0 |
| 44055.166666666664 | 0 |
| 44055.208333333336 | 0 |
| 44055.25 | 0 |
| 44055.291666666664 | 0 |
| 44055.333333333336 | 0 |
| 44055.375 | 0 |
| 44055.416666666664 | 0 |
| 44055.458333333336 | 0 |
| 44055.5 | 0 |
| 44055.541666666664 | 0 |
| 44055.583333333336 | 0 |
| 44055.625 | 0 |
| 44055.666666666664 | 0 |
| 44055.708333333336 | 0 |
| 44055.75 | 0 |
| 44055.791666666664 | 0 |
| 44055.833333333336 | 0 |
| 44055.875 | 0 |
| 44055.916666666664 | 0 |
| 44055.958333333336 | 0 |
| 44056.0 | 0 |
| 44056.041666666664 | 0 |
| 44056.083333333336 | 0 |
| 44056.125 | 0 |
| 44056.166666666664 | 0 |
| 44056.208333333336 | 0 |
| 44056.25 | 0 |
| 44056.291666666664 | 0 |
| 44056.333333333336 | 0 |
| 44056.375 | 0 |
| 44056.416666666664 | 0 |
| 44056.458333333336 | 0 |
| 44056.5 | 0 |
| 44056.541666666664 | 0 |
| 44056.583333333336 | 0 |
| 44056.625 | 0 |
| 44056.666666666664 | 0 |
| 44056.708333333336 | 0 |
| 44056.75 | 0 |
| 44056.791666666664 | 0 |
| 44056.833333333336 | 0 |
| 44056.875 | 0 |
| 44056.916666666664 | 0 |
| 44056.958333333336 | 0 |
| 44057.0 | 0 |
| 44057.041666666664 | 0 |
| 44057.083333333336 | 0 |
| 44057.125 | 0 |
| 44057.166666666664 | 0 |
| 44057.208333333336 | 0 |
| 44057.25 | 0 |
| 44057.291666666664 | 0 |
| 44057.333333333336 | 0 |
| 44057.375 | 0 |
| 44057.416666666664 | 0 |
| 44057.458333333336 | 0 |
| 44057.5 | 0 |
| 44057.541666666664 | 0 |
| 44057.583333333336 | 0 |
| 44057.625 | 0 |
| 44057.666666666664 | 0 |
| 44057.708333333336 | 0 |
| 44057.75 | 0 |
| 44057.791666666664 | 0 |
| 44057.833333333336 | 0 |
| 44057.875 | 0 |
| 44057.916666666664 | 0 |
| 44057.958333333336 | 0 |
| 44058.0 | 0 |
| 44058.041666666664 | 0 |
| 44058.083333333336 | 0 |
| 44058.125 | 0 |
| 44058.166666666664 | 0 |
| 44058.208333333336 | 0 |
| 44058.25 | 0 |
| 44058.291666666664 | 0 |
| 44058.333333333336 | 0 |
| 44058.375 | 0 |
| 44058.416666666664 | 0 |
| 44058.458333333336 | 0 |
| 44058.5 | 0 |
| 44058.541666666664 | 0 |
| 44058.583333333336 | 0 |
| 44058.625 | 0 |
| 44058.666666666664 | 0 |
| 44058.708333333336 | 0 |
| 44058.75 | 0 |
| 44058.791666666664 | 0 |
| 44058.833333333336 | 0 |
| 44058.875 | 0 |
| 44058.916666666664 | 0 |
| 44058.958333333336 | 0 |
| 44059.0 | 0 |
| 44059.041666666664 | 0 |
| 44059.083333333336 | 0 |
| 44059.125 | 0 |
| 44059.166666666664 | 0 |
| 44059.208333333336 | 0 |
| 44059.25 | 0 |
| 44059.291666666664 | 0 |
| 44059.333333333336 | 0 |
| 44059.375 | 0 |
| 44059.416666666664 | 0 |
| 44059.458333333336 | 0 |
| 44059.5 | 0 |
| 44059.541666666664 | 0 |
| 44059.583333333336 | 0 |
| 44059.625 | 0 |
| 44059.666666666664 | 0 |
| 44059.708333333336 | 0 |
| 44059.75 | 0 |
| 44059.791666666664 | 0 |
| 44059.833333333336 | 0 |
| 44059.875 | 0 |
| 44059.916666666664 | 0 |
| 44059.958333333336 | 0 |
| 44060.0 | 0 |
| 44060.041666666664 | 0 |
| 44060.083333333336 | 0 |
| 44060.125 | 0 |
| 44060.166666666664 | 0 |
| 44060.208333333336 | 0 |
| 44060.25 | 0 |
| 44060.291666666664 | 0 |
| 44060.333333333336 | 0 |
| 44060.375 | 0 |
| 44060.416666666664 | 0 |
| 44060.458333333336 | 0 |
| 44060.5 | 0 |
| 44060.541666666664 | 0 |
| 44060.583333333336 | 0 |
| 44060.625 | 0 |
| 44060.666666666664 | 0 |
| 44060.708333333336 | 0 |
| 44060.75 | 0 |
| 44060.791666666664 | 0 |
| 44060.833333333336 | 0 |
| 44060.875 | 0 |
| 44060.916666666664 | 0 |
| 44060.958333333336 | 0 |
| 44061.0 | 0 |
| 44061.041666666664 | 0 |
| 44061.083333333336 | 0 |
| 44061.125 | 0 |
| 44061.166666666664 | 0 |
| 44061.208333333336 | 0 |
| 44061.25 | 0 |
| 44061.291666666664 | 0 |
| 44061.333333333336 | 0 |
| 44061.375 | 0 |
| 44061.416666666664 | 0 |
| 44061.458333333336 | 0 |
| 44061.5 | 0 |
| 44061.541666666664 | 0 |
| 44061.583333333336 | 0 |
| 44061.625 | 0 |
| 44061.666666666664 | 0 |
| 44061.708333333336 | 0 |
| 44061.75 | 0 |
| 44061.791666666664 | 0 |
| 44061.833333333336 | 0 |
| 44061.875 | 0 |
| 44061.916666666664 | 0 |
| 44061.958333333336 | 0 |
| 44062.0 | 0 |
| 44062.041666666664 | 0 |
| 44062.083333333336 | 0 |
| 44062.125 | 0 |
| 44062.166666666664 | 0 |
| 44062.208333333336 | 0 |
| 44062.25 | 0 |
| 44062.291666666664 | 0 |
| 44062.333333333336 | 0 |
| 44062.375 | 0 |
| 44062.416666666664 | 0 |
| 44062.458333333336 | 0 |
| 44062.5 | 0 |
| 44062.541666666664 | 0 |
| 44062.583333333336 | 0 |
| 44062.625 | 0 |
| 44062.666666666664 | 0 |
| 44062.708333333336 | 0 |
| 44062.75 | 0 |
| 44062.791666666664 | 0 |
| 44062.833333333336 | 0 |
| 44062.875 | 0 |
| 44062.916666666664 | 0 |
| 44062.958333333336 | 0 |
| 44063.0 | 0 |
| 44063.041666666664 | 0 |
| 44063.083333333336 | 0 |
| 44063.125 | 0 |
| 44063.166666666664 | 0 |
| 44063.208333333336 | 0 |
| 44063.25 | 0 |
| 44063.291666666664 | 0 |
| 44063.333333333336 | 0 |
| 44063.375 | 0 |
| 44063.416666666664 | 0 |
| 44063.458333333336 | 0 |
| 44063.5 | 0 |
| 44063.541666666664 | 0 |
| 44063.583333333336 | 0 |
| 44063.625 | 0 |
| 44063.666666666664 | 0 |
| 44063.708333333336 | 0 |
| 44063.75 | 0 |
| 44063.791666666664 | 0 |
| 44063.833333333336 | 0 |
| 44063.875 | 0 |
| 44063.916666666664 | 0 |
| 44063.958333333336 | 0 |
| 44064.0 | 0 |
| 44064.041666666664 | 0 |
| 44064.083333333336 | 0 |
| 44064.125 | 0 |
| 44064.166666666664 | 0 |
| 44064.208333333336 | 0 |
| 44064.25 | 0 |
| 44064.291666666664 | 0 |
| 44064.333333333336 | 0 |
| 44064.375 | 0 |
| 44064.416666666664 | 0 |
| 44064.458333333336 | 0 |
| 44064.5 | 0 |
| 44064.541666666664 | 0 |
| 44064.583333333336 | 0 |
| 44064.625 | 0 |
| 44064.666666666664 | 0 |
| 44064.708333333336 | 0 |
| 44064.75 | 0 |
| 44064.791666666664 | 0 |
| 44064.833333333336 | 0 |
| 44064.875 | 0 |
| 44064.916666666664 | 0 |
| 44064.958333333336 | 0 |
| 44065.0 | 0 |
| 44065.041666666664 | 0 |
| 44065.083333333336 | 0 |
| 44065.125 | 0 |
| 44065.166666666664 | 0 |
| 44065.208333333336 | 0 |
| 44065.25 | 0 |
| 44065.291666666664 | 0 |
| 44065.333333333336 | 0 |
| 44065.375 | 0 |
| 44065.416666666664 | 0 |
| 44065.458333333336 | 0 |
| 44065.5 | 0 |
| 44065.541666666664 | 0 |
| 44065.583333333336 | 0 |
| 44065.625 | 0 |
| 44065.666666666664 | 0 |
| 44065.708333333336 | 0 |
| 44065.75 | 0 |
| 44065.791666666664 | 0 |
| 44065.833333333336 | 0 |
| 44065.875 | 0 |
| 44065.916666666664 | 0 |
| 44065.958333333336 | 0 |
| 44066.0 | 0 |
| 44066.041666666664 | 0 |
| 44066.083333333336 | 0 |
| 44066.125 | 0 |
| 44066.166666666664 | 0 |
| 44066.208333333336 | 0 |
| 44066.25 | 0 |
| 44066.291666666664 | 0 |
| 44066.333333333336 | 0 |
| 44066.375 | 0 |
| 44066.416666666664 | 0 |
| 44066.458333333336 | 0 |
| 44066.5 | 0 |
| 44066.541666666664 | 0 |
| 44066.583333333336 | 0 |
| 44066.625 | 0 |
| 44066.666666666664 | 0 |
| 44066.708333333336 | 0 |
| 44066.75 | 0 |
| 44066.791666666664 | 0 |
| 44066.833333333336 | 0 |
| 44066.875 | 0 |
| 44066.916666666664 | 0 |
| 44066.958333333336 | 0 |
| 44067.0 | 0 |
| 44067.041666666664 | 0 |
| 44067.083333333336 | 0 |
| 44067.125 | 0 |
| 44067.166666666664 | 0 |
| 44067.208333333336 | 0 |
| 44067.25 | 0 |
| 44067.291666666664 | 0 |
| 44067.333333333336 | 0 |
| 44067.375 | 0 |
| 44067.416666666664 | 0 |
| 44067.458333333336 | 0 |
| 44067.5 | 0 |
| 44067.541666666664 | 0 |
| 44067.583333333336 | 0 |
| 44067.625 | 0 |
| 44067.666666666664 | 0 |
| 44067.708333333336 | 0 |
| 44067.75 | 0 |
| 44067.791666666664 | 0 |
| 44067.833333333336 | 0 |
| 44067.875 | 0 |
| 44067.916666666664 | 0 |
| 44067.958333333336 | 0 |
| 44068.0 | 0 |
| 44068.041666666664 | 0 |
| 44068.083333333336 | 0 |
| 44068.125 | 0 |
| 44068.166666666664 | 0 |
| 44068.208333333336 | 0 |
| 44068.25 | 0 |
| 44068.291666666664 | 0 |
| 44068.333333333336 | 0 |
| 44068.375 | 0 |
| 44068.416666666664 | 0 |
| 44068.458333333336 | 0 |
| 44068.5 | 0 |
| 44068.541666666664 | 0 |
| 44068.583333333336 | 0 |
| 44068.625 | 0 |
| 44068.666666666664 | 0 |
| 44068.708333333336 | 0 |
| 44068.75 | 0 |
| 44068.791666666664 | 0 |
| 44068.833333333336 | 0 |
| 44068.875 | 0 |
| 44068.916666666664 | 0 |
| 44068.958333333336 | 0 |
| 44069.0 | 0 |
| 44069.041666666664 | 0 |
| 44069.083333333336 | 0 |
| 44069.125 | 0 |
| 44069.166666666664 | 0 |
| 44069.208333333336 | 0 |
| 44069.25 | 0 |
| 44069.291666666664 | 0 |
| 44069.333333333336 | 0 |
| 44069.375 | 0 |
| 44069.416666666664 | 0 |
| 44069.458333333336 | 0 |
| 44069.5 | 0 |
| 44069.541666666664 | 0 |
| 44069.583333333336 | 0 |
| 44069.625 | 0 |
| 44069.666666666664 | 0 |
| 44069.708333333336 | 0 |
| 44069.75 | 0 |
| 44069.791666666664 | 0 |
| 44069.833333333336 | 0 |
| 44069.875 | 0 |
| 44069.916666666664 | 0 |
| 44069.958333333336 | 0 |
| 44070.0 | 0 |
| 44070.041666666664 | 0 |
| 44070.083333333336 | 0 |
| 44070.125 | 0 |
| 44070.166666666664 | 0 |
| 44070.208333333336 | 0 |
| 44070.25 | 0 |
| 44070.291666666664 | 0 |
| 44070.333333333336 | 0 |
| 44070.375 | 0 |
| 44070.416666666664 | 0 |
| 44070.458333333336 | 0 |
| 44070.5 | 0 |
| 44070.541666666664 | 0 |
| 44070.583333333336 | 0 |
| 44070.625 | 0 |
| 44070.666666666664 | 0 |
| 44070.708333333336 | 0 |
| 44070.75 | 0 |
| 44070.791666666664 | 0 |
| 44070.833333333336 | 0 |
| 44070.875 | 0 |
| 44070.916666666664 | 0 |
| 44070.958333333336 | 0 |
| 44071.0 | 0 |
| 44071.041666666664 | 0 |
| 44071.083333333336 | 0 |
| 44071.125 | 0 |
| 44071.166666666664 | 0 |
| 44071.208333333336 | 0 |
| 44071.25 | 0 |
| 44071.291666666664 | 0 |
| 44071.333333333336 | 0 |
| 44071.375 | 0 |
| 44071.416666666664 | 0 |
| 44071.458333333336 | 0 |
| 44071.5 | 0 |
| 44071.541666666664 | 0 |
| 44071.583333333336 | 0 |
| 44071.625 | 0 |
| 44071.666666666664 | 0 |
| 44071.708333333336 | 0 |
| 44071.75 | 0 |
| 44071.791666666664 | 0 |
| 44071.833333333336 | 0 |
| 44071.875 | 0 |
| 44071.916666666664 | 0 |
| 44071.958333333336 | 0 |
| 44072.0 | 0 |
| 44072.041666666664 | 0 |
| 44072.083333333336 | 0 |
| 44072.125 | 0 |
| 44072.166666666664 | 0 |
| 44072.208333333336 | 0 |
| 44072.25 | 0 |
| 44072.291666666664 | 0 |
| 44072.333333333336 | 0 |
| 44072.375 | 0 |
| 44072.416666666664 | 0 |
| 44072.458333333336 | 0 |
| 44072.5 | 0 |
| 44072.541666666664 | 0 |
| 44072.583333333336 | 0 |
| 44072.625 | 0 |
| 44072.666666666664 | 0 |
| 44072.708333333336 | 0 |
| 44072.75 | 0 |
| 44072.791666666664 | 0 |
| 44072.833333333336 | 0 |
| 44072.875 | 0 |
| 44072.916666666664 | 0 |
| 44072.958333333336 | 0 |
| 44073.0 | 0 |
| 44073.041666666664 | 0 |
| 44073.083333333336 | 0 |
| 44073.125 | 0 |
| 44073.166666666664 | 0 |
| 44073.208333333336 | 0 |
| 44073.25 | 0 |
| 44073.291666666664 | 0 |
| 44073.333333333336 | 0 |
| 44073.375 | 0 |
| 44073.416666666664 | 0 |
| 44073.458333333336 | 0 |
| 44073.5 | 0 |
| 44073.541666666664 | 0 |
| 44073.583333333336 | 0 |
| 44073.625 | 0 |
| 44073.666666666664 | 0 |
| 44073.708333333336 | 0 |
| 44073.75 | 0 |
| 44073.791666666664 | 0 |
| 44073.833333333336 | 0 |
| 44073.875 | 0 |
| 44073.916666666664 | 0 |
| 44073.958333333336 | 0 |
| 44074.0 | 0 |
| 44074.041666666664 | 0 |
| 44074.083333333336 | 0 |
| 44074.125 | 0 |
| 44074.166666666664 | 0 |
| 44074.208333333336 | 0 |
| 44074.25 | 0 |
| 44074.291666666664 | 0 |
| 44074.333333333336 | 0 |
| 44074.375 | 0 |
| 44074.416666666664 | 0 |
| 44074.458333333336 | 0 |
| 44074.5 | 0 |
| 44074.541666666664 | 0 |
| 44074.583333333336 | 0 |
| 44074.625 | 0 |
| 44074.666666666664 | 0 |
| 44074.708333333336 | 0 |
| 44074.75 | 0 |
| 44074.791666666664 | 0 |
| 44074.833333333336 | 0 |
| 44074.875 | 0 |
| 44074.916666666664 | 0 |
| 44074.958333333336 | 0 |
| 44075.0 | 0 |
| 44075.041666666664 | 0 |
| 44075.083333333336 | 0 |
| 44075.125 | 0 |
| 44075.166666666664 | 0 |
| 44075.208333333336 | 0 |
| 44075.25 | 0 |
| 44075.291666666664 | 0 |
| 44075.333333333336 | 0 |
| 44075.375 | 0 |
| 44075.416666666664 | 0 |
| 44075.458333333336 | 0 |
| 44075.5 | 0 |
| 44075.541666666664 | 0 |
| 44075.583333333336 | 0 |
| 44075.625 | 0 |
| 44075.666666666664 | 0 |
| 44075.708333333336 | 0 |
| 44075.75 | 0 |
| 44075.791666666664 | 0 |
| 44075.833333333336 | 0 |
| 44075.875 | 0 |
| 44075.916666666664 | 0 |
| 44075.958333333336 | 0 |
| 44076.0 | 0 |
| 44076.041666666664 | 0 |
| 44076.083333333336 | 0 |
| 44076.125 | 0 |
| 44076.166666666664 | 0 |
| 44076.208333333336 | 0 |
| 44076.25 | 0 |
| 44076.291666666664 | 0 |
| 44076.333333333336 | 0 |
| 44076.375 | 0 |
| 44076.416666666664 | 0 |
| 44076.458333333336 | 0 |
| 44076.5 | 0 |
| 44076.541666666664 | 0 |
| 44076.583333333336 | 0 |
| 44076.625 | 0 |
| 44076.666666666664 | 0 |
| 44076.708333333336 | 0 |
| 44076.75 | 0 |
| 44076.791666666664 | 0 |
| 44076.833333333336 | 0 |
| 44076.875 | 0 |
| 44076.916666666664 | 0 |
| 44076.958333333336 | 0 |
| 44077.0 | 0 |
| 44077.041666666664 | 0 |
| 44077.083333333336 | 0 |
| 44077.125 | 0 |
| 44077.166666666664 | 0 |
| 44077.208333333336 | 0 |
| 44077.25 | 0 |
| 44077.291666666664 | 0 |
| 44077.333333333336 | 0 |
| 44077.375 | 0 |
| 44077.416666666664 | 0 |
| 44077.458333333336 | 0 |
| 44077.5 | 0 |
| 44077.541666666664 | 0 |
| 44077.583333333336 | 0 |
| 44077.625 | 0 |
| 44077.666666666664 | 0 |
| 44077.708333333336 | 0 |
| 44077.75 | 0 |
| 44077.791666666664 | 0 |
| 44077.833333333336 | 0 |
| 44077.875 | 0 |
| 44077.916666666664 | 0 |
| 44077.958333333336 | 0 |
| 44078.0 | 0 |
| 44078.041666666664 | 0 |
| 44078.083333333336 | 0 |
| 44078.125 | 0 |
| 44078.166666666664 | 0 |
| 44078.208333333336 | 0 |
| 44078.25 | 0 |
| 44078.291666666664 | 0 |
| 44078.333333333336 | 0 |
| 44078.375 | 0 |
| 44078.416666666664 | 0 |
| 44078.458333333336 | 0 |
| 44078.5 | 0 |
| 44078.541666666664 | 0 |
| 44078.583333333336 | 0 |
| 44078.625 | 0 |
| 44078.666666666664 | 0 |
| 44078.708333333336 | 0 |
| 44078.75 | 0 |
| 44078.791666666664 | 0 |
| 44078.833333333336 | 0 |
| 44078.875 | 0 |
| 44078.916666666664 | 0 |
| 44078.958333333336 | 0 |
| 44079.0 | 0 |
| 44079.041666666664 | 0 |
| 44079.083333333336 | 0 |
| 44079.125 | 0 |
| 44079.166666666664 | 0 |
| 44079.208333333336 | 0 |
| 44079.25 | 0 |
| 44079.291666666664 | 0 |
| 44079.333333333336 | 0 |
| 44079.375 | 0 |
| 44079.416666666664 | 0 |
| 44079.458333333336 | 0 |
| 44079.5 | 0 |
| 44079.541666666664 | 0 |
| 44079.583333333336 | 0 |
| 44079.625 | 0 |
| 44079.666666666664 | 0 |
| 44079.708333333336 | 0 |
| 44079.75 | 0 |
| 44079.791666666664 | 0 |
| 44079.833333333336 | 0 |
| 44079.875 | 0 |
| 44079.916666666664 | 0 |
| 44079.958333333336 | 0 |
| 44080.0 | 0 |
| 44080.041666666664 | 0 |
| 44080.083333333336 | 0 |
| 44080.125 | 0 |
| 44080.166666666664 | 0 |
| 44080.208333333336 | 0 |
| 44080.25 | 0 |
| 44080.291666666664 | 0 |
| 44080.333333333336 | 0 |
| 44080.375 | 0 |
| 44080.416666666664 | 0 |
| 44080.458333333336 | 0 |
| 44080.5 | 0 |
| 44080.541666666664 | 0 |
| 44080.583333333336 | 0 |
| 44080.625 | 0 |
| 44080.666666666664 | 0 |
| 44080.708333333336 | 0 |
| 44080.75 | 0 |
| 44080.791666666664 | 0 |
| 44080.833333333336 | 0 |
| 44080.875 | 0 |
| 44080.916666666664 | 0 |
| 44080.958333333336 | 0 |
| 44081.0 | 0 |
| 44081.041666666664 | 0 |
| 44081.083333333336 | 0 |
| 44081.125 | 0 |
| 44081.166666666664 | 0 |
| 44081.208333333336 | 0 |
| 44081.25 | 0 |
| 44081.291666666664 | 0 |
| 44081.333333333336 | 0 |
| 44081.375 | 0 |
| 44081.416666666664 | 0 |
| 44081.458333333336 | 0 |
| 44081.5 | 0 |
| 44081.541666666664 | 0 |
| 44081.583333333336 | 0 |
| 44081.625 | 0 |
| 44081.666666666664 | 0 |
| 44081.708333333336 | 0 |
| 44081.75 | 0 |
| 44081.791666666664 | 0 |
| 44081.833333333336 | 0 |
| 44081.875 | 0 |
| 44081.916666666664 | 0 |
| 44081.958333333336 | 0 |
| 44082.0 | 0 |
| 44082.041666666664 | 0 |
| 44082.083333333336 | 0 |
| 44082.125 | 0 |
| 44082.166666666664 | 0 |
| 44082.208333333336 | 0 |
| 44082.25 | 0 |
| 44082.291666666664 | 0 |
| 44082.333333333336 | 0 |
| 44082.375 | 0 |
| 44082.416666666664 | 0 |
| 44082.458333333336 | 0 |
| 44082.5 | 0 |
| 44082.541666666664 | 0 |
| 44082.583333333336 | 0 |
| 44082.625 | 0 |
| 44082.666666666664 | 0 |
| 44082.708333333336 | 0 |
| 44082.75 | 0 |
| 44082.791666666664 | 0 |
| 44082.833333333336 | 0 |
| 44082.875 | 0 |
| 44082.916666666664 | 0 |
| 44082.958333333336 | 0 |
| 44083.0 | 0 |
| 44083.041666666664 | 0 |
| 44083.083333333336 | 0 |
| 44083.125 | 0 |
| 44083.166666666664 | 0 |
| 44083.208333333336 | 0 |
| 44083.25 | 0 |
| 44083.291666666664 | 0 |
| 44083.333333333336 | 0 |
| 44083.375 | 0 |
| 44083.416666666664 | 0 |
| 44083.458333333336 | 0 |
| 44083.5 | 0 |
| 44083.541666666664 | 0 |
| 44083.583333333336 | 0 |
| 44083.625 | 0 |
| 44083.666666666664 | 0 |
| 44083.708333333336 | 0 |
| 44083.75 | 0 |
| 44083.791666666664 | 0 |
| 44083.833333333336 | 0 |
| 44083.875 | 0 |
| 44083.916666666664 | 0 |
| 44083.958333333336 | 0 |
| 44084.0 | 0 |
| 44084.041666666664 | 0 |
| 44084.083333333336 | 0 |
| 44084.125 | 0 |
| 44084.166666666664 | 0 |
| 44084.208333333336 | 0 |
| 44084.25 | 0 |
| 44084.291666666664 | 0 |
| 44084.333333333336 | 0 |
| 44084.375 | 0 |
| 44084.416666666664 | 0 |
| 44084.458333333336 | 0 |
| 44084.5 | 0 |
| 44084.541666666664 | 0 |
| 44084.583333333336 | 0 |
| 44084.625 | 0 |
| 44084.666666666664 | 0 |
| 44084.708333333336 | 0 |
| 44084.75 | 0 |
| 44084.791666666664 | 0 |
| 44084.833333333336 | 0 |
| 44084.875 | 0 |
| 44084.916666666664 | 0 |
| 44084.958333333336 | 0 |
| 44085.0 | 0 |
| 44085.041666666664 | 0 |
| 44085.083333333336 | 0 |
| 44085.125 | 0 |
| 44085.166666666664 | 0 |
| 44085.208333333336 | 0 |
| 44085.25 | 0 |
| 44085.291666666664 | 0 |
| 44085.333333333336 | 0 |
| 44085.375 | 0 |
| 44085.416666666664 | 0 |
| 44085.458333333336 | 0 |
| 44085.5 | 0 |
| 44085.541666666664 | 0 |
| 44085.583333333336 | 0 |
| 44085.625 | 0 |
| 44085.666666666664 | 0 |
| 44085.708333333336 | 0 |
| 44085.75 | 0 |
| 44085.791666666664 | 0 |
| 44085.833333333336 | 0 |
| 44085.875 | 0 |
| 44085.916666666664 | 0 |
| 44085.958333333336 | 0 |
| 44086.0 | 0 |
| 44086.041666666664 | 0 |
| 44086.083333333336 | 0 |
| 44086.125 | 0 |
| 44086.166666666664 | 0 |
| 44086.208333333336 | 0 |
| 44086.25 | 0 |
| 44086.291666666664 | 0 |
| 44086.333333333336 | 0 |
| 44086.375 | 0 |
| 44086.416666666664 | 0 |
| 44086.458333333336 | 0 |
| 44086.5 | 0 |
| 44086.541666666664 | 0 |
| 44086.583333333336 | 0 |
| 44086.625 | 0 |
| 44086.666666666664 | 0 |
| 44086.708333333336 | 0 |
| 44086.75 | 0 |
| 44086.791666666664 | 0 |
| 44086.833333333336 | 0 |
| 44086.875 | 0 |
| 44086.916666666664 | 0 |
| 44086.958333333336 | 0 |
| 44087.0 | 0 |
| 44087.041666666664 | 0 |
| 44087.083333333336 | 0 |
| 44087.125 | 0 |
| 44087.166666666664 | 0 |
| 44087.208333333336 | 0 |
| 44087.25 | 0 |
| 44087.291666666664 | 0 |
| 44087.333333333336 | 0 |
| 44087.375 | 0 |
| 44087.416666666664 | 0 |
| 44087.458333333336 | 0 |
| 44087.5 | 0 |
| 44087.541666666664 | 0 |
| 44087.583333333336 | 0 |
| 44087.625 | 0 |
| 44087.666666666664 | 0 |
| 44087.708333333336 | 0 |
| 44087.75 | 0 |
| 44087.791666666664 | 0 |
| 44087.833333333336 | 0 |
| 44087.875 | 0 |
| 44087.916666666664 | 0 |
| 44087.958333333336 | 0 |
| 44088.0 | 0 |
| 44088.041666666664 | 0 |
| 44088.083333333336 | 0 |
| 44088.125 | 0 |
| 44088.166666666664 | 0 |
| 44088.208333333336 | 0 |
| 44088.25 | 0 |
| 44088.291666666664 | 0 |
| 44088.333333333336 | 0 |
| 44088.375 | 0 |
| 44088.416666666664 | 0 |
| 44088.458333333336 | 0 |
| 44088.5 | 0 |
| 44088.541666666664 | 0 |
| 44088.583333333336 | 0 |
| 44088.625 | 0 |
| 44088.666666666664 | 0 |
| 44088.708333333336 | 0 |
| 44088.75 | 0 |
| 44088.791666666664 | 0 |
| 44088.833333333336 | 0 |
| 44088.875 | 0 |
| 44088.916666666664 | 0 |
| 44088.958333333336 | 0 |
| 44089.0 | 0 |
| 44089.041666666664 | 0 |
| 44089.083333333336 | 0 |
| 44089.125 | 0 |
| 44089.166666666664 | 0 |
| 44089.208333333336 | 0 |
| 44089.25 | 0 |
| 44089.291666666664 | 0 |
| 44089.333333333336 | 0 |
| 44089.375 | 0 |
| 44089.416666666664 | 0 |
| 44089.458333333336 | 0 |
| 44089.5 | 0 |
| 44089.541666666664 | 0 |
| 44089.583333333336 | 0 |
| 44089.625 | 0 |
| 44089.666666666664 | 0 |
| 44089.708333333336 | 0 |
| 44089.75 | 0 |
| 44089.791666666664 | 0 |
| 44089.833333333336 | 0 |
| 44089.875 | 0 |
| 44089.916666666664 | 0 |
| 44089.958333333336 | 0 |
| 44090.0 | 0 |
| 44090.041666666664 | 0 |
| 44090.083333333336 | 0 |
| 44090.125 | 0 |
| 44090.166666666664 | 0 |
| 44090.208333333336 | 0 |
| 44090.25 | 0 |
| 44090.291666666664 | 0 |
| 44090.333333333336 | 0 |
| 44090.375 | 0 |
| 44090.416666666664 | 0 |
| 44090.458333333336 | 0 |
| 44090.5 | 0 |
| 44090.541666666664 | 0 |
| 44090.583333333336 | 0 |
| 44090.625 | 0 |
| 44090.666666666664 | 0 |
| 44090.708333333336 | 0 |
| 44090.75 | 0 |
| 44090.791666666664 | 0 |
| 44090.833333333336 | 0 |
| 44090.875 | 0 |
| 44090.916666666664 | 0 |
| 44090.958333333336 | 0 |
| 44091.0 | 0 |
| 44091.041666666664 | 0 |
| 44091.083333333336 | 0 |
| 44091.125 | 0 |
| 44091.166666666664 | 0 |
| 44091.208333333336 | 0 |
| 44091.25 | 0 |
| 44091.291666666664 | 0 |
| 44091.333333333336 | 0 |
| 44091.375 | 0 |
| 44091.416666666664 | 0 |
| 44091.458333333336 | 0 |
| 44091.5 | 0 |
| 44091.541666666664 | 0 |
| 44091.583333333336 | 0 |
| 44091.625 | 0 |
| 44091.666666666664 | 0 |
| 44091.708333333336 | 0 |
| 44091.75 | 0 |
| 44091.791666666664 | 0 |
| 44091.833333333336 | 0 |
| 44091.875 | 0 |
| 44091.916666666664 | 0 |
| 44091.958333333336 | 0 |
| 44092.0 | 0 |
| 44092.041666666664 | 0 |
| 44092.083333333336 | 0 |
| 44092.125 | 0 |
| 44092.166666666664 | 0 |
| 44092.208333333336 | 0 |
| 44092.25 | 0 |
| 44092.291666666664 | 0 |
| 44092.333333333336 | 0 |
| 44092.375 | 0 |
| 44092.416666666664 | 0 |
| 44092.458333333336 | 0 |
| 44092.5 | 0 |
| 44092.541666666664 | 0 |
| 44092.583333333336 | 0 |
| 44092.625 | 0 |
| 44092.666666666664 | 0 |
| 44092.708333333336 | 0 |
| 44092.75 | 0 |
| 44092.791666666664 | 0 |
| 44092.833333333336 | 0 |
| 44092.875 | 0 |
| 44092.916666666664 | 0 |
| 44092.958333333336 | 0 |
| 44093.0 | 0 |
| 44093.041666666664 | 0 |
| 44093.083333333336 | 0 |
| 44093.125 | 0 |
| 44093.166666666664 | 0 |
| 44093.208333333336 | 0 |
| 44093.25 | 0 |
| 44093.291666666664 | 0 |
| 44093.333333333336 | 0 |
| 44093.375 | 0 |
| 44093.416666666664 | 0 |
| 44093.458333333336 | 0 |
| 44093.5 | 0 |
| 44093.541666666664 | 0 |
| 44093.583333333336 | 0 |
| 44093.625 | 0 |
| 44093.666666666664 | 0 |
| 44093.708333333336 | 0 |
| 44093.75 | 0 |
| 44093.791666666664 | 0 |
| 44093.833333333336 | 0 |
| 44093.875 | 0 |
| 44093.916666666664 | 0 |
| 44093.958333333336 | 0 |
| 44094.0 | 0 |
| 44094.041666666664 | 0 |
| 44094.083333333336 | 0 |
| 44094.125 | 0 |
| 44094.166666666664 | 0 |
| 44094.208333333336 | 0 |
| 44094.25 | 0 |
| 44094.291666666664 | 0 |
| 44094.333333333336 | 0 |
| 44094.375 | 0 |
| 44094.416666666664 | 0 |
| 44094.458333333336 | 0 |
| 44094.5 | 0 |
| 44094.541666666664 | 0 |
| 44094.583333333336 | 0 |
| 44094.625 | 0 |
| 44094.666666666664 | 0 |
| 44094.708333333336 | 0 |
| 44094.75 | 0 |
| 44094.791666666664 | 0 |
| 44094.833333333336 | 0 |
| 44094.875 | 0 |
| 44094.916666666664 | 0 |
| 44094.958333333336 | 0 |
| 44095.0 | 0 |
| 44095.041666666664 | 0 |
| 44095.083333333336 | 0 |
| 44095.125 | 0 |
| 44095.166666666664 | 0 |
| 44095.208333333336 | 0 |
| 44095.25 | 0 |
| 44095.291666666664 | 0 |
| 44095.333333333336 | 0 |
| 44095.375 | 0 |
| 44095.416666666664 | 0 |
| 44095.458333333336 | 0 |
| 44095.5 | 0 |
| 44095.541666666664 | 0 |
| 44095.583333333336 | 0 |
| 44095.625 | 0 |
| 44095.666666666664 | 0 |
| 44095.708333333336 | 0 |
| 44095.75 | 0 |
| 44095.791666666664 | 0 |
| 44095.833333333336 | 0 |
| 44095.875 | 0 |
| 44095.916666666664 | 0 |
| 44095.958333333336 | 0 |
| 44096.0 | 0 |
| 44096.041666666664 | 0 |
| 44096.083333333336 | 0 |
| 44096.125 | 0 |
| 44096.166666666664 | 0 |
| 44096.208333333336 | 0 |
| 44096.25 | 0 |
| 44096.291666666664 | 0 |
| 44096.333333333336 | 0 |
| 44096.375 | 0 |
| 44096.416666666664 | 0 |
| 44096.458333333336 | 0 |
| 44096.5 | 0 |
| 44096.541666666664 | 0 |
| 44096.583333333336 | 0 |
| 44096.625 | 0 |
| 44096.666666666664 | 0 |
| 44096.708333333336 | 0 |
| 44096.75 | 0 |
| 44096.791666666664 | 0 |
| 44096.833333333336 | 0 |
| 44096.875 | 0 |
| 44096.916666666664 | 0 |
| 44096.958333333336 | 0 |
| 44097.0 | 0 |
| 44097.041666666664 | 0 |
| 44097.083333333336 | 0 |
| 44097.125 | 0 |
| 44097.166666666664 | 0 |
| 44097.208333333336 | 0 |
| 44097.25 | 0 |
| 44097.291666666664 | 0 |
| 44097.333333333336 | 0 |
| 44097.375 | 0 |
| 44097.416666666664 | 0 |
| 44097.458333333336 | 0 |
| 44097.5 | 0 |
| 44097.541666666664 | 0 |
| 44097.583333333336 | 0 |
| 44097.625 | 0 |
| 44097.666666666664 | 0 |
| 44097.708333333336 | 0 |
| 44097.75 | 0 |
| 44097.791666666664 | 0 |
| 44097.833333333336 | 0 |
| 44097.875 | 0 |
| 44097.916666666664 | 0 |
| 44097.958333333336 | 0 |
| 44098.0 | 0 |
| 44098.041666666664 | 0 |
| 44098.083333333336 | 0 |
| 44098.125 | 0 |
| 44098.166666666664 | 0 |
| 44098.208333333336 | 0 |
| 44098.25 | 0 |
| 44098.291666666664 | 0 |
| 44098.333333333336 | 0 |
| 44098.375 | 0 |
| 44098.416666666664 | 0 |
| 44098.458333333336 | 0 |
| 44098.5 | 0 |
| 44098.541666666664 | 0 |
| 44098.583333333336 | 0 |
| 44098.625 | 0 |
| 44098.666666666664 | 0 |
| 44098.708333333336 | 0 |
| 44098.75 | 0 |
| 44098.791666666664 | 0 |
| 44098.833333333336 | 0 |
| 44098.875 | 0 |
| 44098.916666666664 | 0 |
| 44098.958333333336 | 0 |
| 44099.0 | 0 |
| 44099.041666666664 | 0 |
| 44099.083333333336 | 0 |
| 44099.125 | 0 |
| 44099.166666666664 | 0 |
| 44099.208333333336 | 0 |
| 44099.25 | 0 |
| 44099.291666666664 | 0 |
| 44099.333333333336 | 0 |
| 44099.375 | 0 |
| 44099.416666666664 | 0 |
| 44099.458333333336 | 0 |
| 44099.5 | 0 |
| 44099.541666666664 | 0 |
| 44099.583333333336 | 0 |
| 44099.625 | 0 |
| 44099.666666666664 | 0 |
| 44099.708333333336 | 0 |
| 44099.75 | 0 |
| 44099.791666666664 | 0 |
| 44099.833333333336 | 0 |
| 44099.875 | 0 |
| 44099.916666666664 | 0 |
| 44099.958333333336 | 0 |
| 44100.0 | 0 |
| 44100.041666666664 | 0 |
| 44100.083333333336 | 0 |
| 44100.125 | 0 |
| 44100.166666666664 | 0 |
| 44100.208333333336 | 0 |
| 44100.25 | 0 |
| 44100.291666666664 | 0 |
| 44100.333333333336 | 0 |
| 44100.375 | 0 |
| 44100.416666666664 | 0 |
| 44100.458333333336 | 0 |
| 44100.5 | 0 |
| 44100.541666666664 | 0 |
| 44100.583333333336 | 0 |
| 44100.625 | 0 |
| 44100.666666666664 | 0 |
| 44100.708333333336 | 0 |
| 44100.75 | 0 |
| 44100.791666666664 | 0 |
| 44100.833333333336 | 0 |
| 44100.875 | 0 |
| 44100.916666666664 | 0 |
| 44100.958333333336 | 0 |
| 44101.0 | 0 |
| 44101.041666666664 | 0 |
| 44101.083333333336 | 0 |
| 44101.125 | 0 |
| 44101.166666666664 | 0 |
| 44101.208333333336 | 0 |
| 44101.25 | 0 |
| 44101.291666666664 | 0 |
| 44101.333333333336 | 0 |
| 44101.375 | 0 |
| 44101.416666666664 | 0 |
| 44101.458333333336 | 0 |
| 44101.5 | 0 |
| 44101.541666666664 | 0 |
| 44101.583333333336 | 0 |
| 44101.625 | 0 |
| 44101.666666666664 | 0 |
| 44101.708333333336 | 0 |
| 44101.75 | 0 |
| 44101.791666666664 | 0 |
| 44101.833333333336 | 0 |
| 44101.875 | 0 |
| 44101.916666666664 | 0 |
| 44101.958333333336 | 0 |
| 44102.0 | 0 |
| 44102.041666666664 | 0 |
| 44102.083333333336 | 0 |
| 44102.125 | 0 |
| 44102.166666666664 | 0 |
| 44102.208333333336 | 0 |
| 44102.25 | 0 |
| 44102.291666666664 | 0 |
| 44102.333333333336 | 0 |
| 44102.375 | 0 |
| 44102.416666666664 | 0 |
| 44102.458333333336 | 0 |
| 44102.5 | 0 |
| 44102.541666666664 | 0 |
| 44102.583333333336 | 0 |
| 44102.625 | 0 |
| 44102.666666666664 | 0 |
| 44102.708333333336 | 0 |
| 44102.75 | 0 |
| 44102.791666666664 | 0 |
| 44102.833333333336 | 0 |
| 44102.875 | 0 |
| 44102.916666666664 | 0 |
| 44102.958333333336 | 0 |
| 44103.0 | 0 |
| 44103.041666666664 | 0 |
| 44103.083333333336 | 0 |
| 44103.125 | 0 |
| 44103.166666666664 | 0 |
| 44103.208333333336 | 0 |
| 44103.25 | 0 |
| 44103.291666666664 | 0 |
| 44103.333333333336 | 0 |
| 44103.375 | 0 |
| 44103.416666666664 | 0 |
| 44103.458333333336 | 0 |
| 44103.5 | 0 |
| 44103.541666666664 | 0 |
| 44103.583333333336 | 0 |
| 44103.625 | 0 |
| 44103.666666666664 | 0 |
| 44103.708333333336 | 0 |
| 44103.75 | 0 |
| 44103.791666666664 | 0 |
| 44103.833333333336 | 0 |
| 44103.875 | 0 |
| 44103.916666666664 | 0 |
| 44103.958333333336 | 0 |
| 44104.0 | 0 |
| 44104.041666666664 | 0 |
| 44104.083333333336 | 0 |
| 44104.125 | 0 |
| 44104.166666666664 | 0 |
| 44104.208333333336 | 0 |
| 44104.25 | 0 |
| 44104.291666666664 | 0 |
| 44104.333333333336 | 0 |
| 44104.375 | 0 |
| 44104.416666666664 | 0 |
| 44104.458333333336 | 0 |
| 44104.5 | 0 |
| 44104.541666666664 | 0 |
| 44104.583333333336 | 0 |
| 44104.625 | 0 |
| 44104.666666666664 | 0 |
| 44104.708333333336 | 0 |
| 44104.75 | 0 |
| 44104.791666666664 | 0 |
| 44104.833333333336 | 0 |
| 44104.875 | 0 |
| 44104.916666666664 | 0 |
| 44104.958333333336 | 0 |
| 44105.0 | 0 |
| 44105.041666666664 | 0 |
| 44105.083333333336 | 0 |
| 44105.125 | 0 |
| 44105.166666666664 | 0 |
| 44105.208333333336 | 0 |
| 44105.25 | 0 |
| 44105.291666666664 | 0 |
| 44105.333333333336 | 0 |
| 44105.375 | 0 |
| 44105.416666666664 | 0 |
| 44105.458333333336 | 0 |
| 44105.5 | 0 |
| 44105.541666666664 | 0 |
| 44105.583333333336 | 0 |
| 44105.625 | 0 |
| 44105.666666666664 | 0 |
| 44105.708333333336 | 0 |
| 44105.75 | 0 |
| 44105.791666666664 | 0 |
| 44105.833333333336 | 0 |
| 44105.875 | 0 |
| 44105.916666666664 | 0 |
| 44105.958333333336 | 0 |
| 44106.0 | 0 |
| 44106.041666666664 | 0 |
| 44106.083333333336 | 0 |
| 44106.125 | 0 |
| 44106.166666666664 | 0 |
| 44106.208333333336 | 0 |
| 44106.25 | 0 |
| 44106.291666666664 | 0 |
| 44106.333333333336 | 0 |
| 44106.375 | 0 |
| 44106.416666666664 | 0 |
| 44106.458333333336 | 0 |
| 44106.5 | 0 |
| 44106.541666666664 | 0 |
| 44106.583333333336 | 0 |
| 44106.625 | 0 |
| 44106.666666666664 | 0 |
| 44106.708333333336 | 0 |
| 44106.75 | 0 |
| 44106.791666666664 | 0 |
| 44106.833333333336 | 0 |
| 44106.875 | 0 |
| 44106.916666666664 | 0 |
| 44106.958333333336 | 0 |
| 44107.0 | 0 |
| 44107.041666666664 | 0 |
| 44107.083333333336 | 0 |
| 44107.125 | 0 |
| 44107.166666666664 | 0 |
| 44107.208333333336 | 0 |
| 44107.25 | 0 |
| 44107.291666666664 | 0 |
| 44107.333333333336 | 0 |
| 44107.375 | 0 |
| 44107.416666666664 | 0 |
| 44107.458333333336 | 0 |
| 44107.5 | 0 |
| 44107.541666666664 | 0 |
| 44107.583333333336 | 0 |
| 44107.625 | 0 |
| 44107.666666666664 | 0 |
| 44107.708333333336 | 0 |
| 44107.75 | 0 |
| 44107.791666666664 | 0 |
| 44107.833333333336 | 0 |
| 44107.875 | 0 |
| 44107.916666666664 | 0 |
| 44107.958333333336 | 0 |
| 44108.0 | 0 |
| 44108.041666666664 | 0 |
| 44108.083333333336 | 0 |
| 44108.125 | 0 |
| 44108.166666666664 | 0 |
| 44108.208333333336 | 0 |
| 44108.25 | 0 |
| 44108.291666666664 | 0 |
| 44108.333333333336 | 0 |
| 44108.375 | 0 |
| 44108.416666666664 | 0 |
| 44108.458333333336 | 0 |
| 44108.5 | 0 |
| 44108.541666666664 | 0 |
| 44108.583333333336 | 0 |
| 44108.625 | 0 |
| 44108.666666666664 | 0 |
| 44108.708333333336 | 0 |
| 44108.75 | 0 |
| 44108.791666666664 | 0 |
| 44108.833333333336 | 0 |
| 44108.875 | 0 |
| 44108.916666666664 | 0 |
| 44108.958333333336 | 0 |
| 44109.0 | 0 |
| 44109.041666666664 | 0 |
| 44109.083333333336 | 0 |
| 44109.125 | 0 |
| 44109.166666666664 | 0 |
| 44109.208333333336 | 0 |
| 44109.25 | 0 |
| 44109.291666666664 | 0 |
| 44109.333333333336 | 0 |
| 44109.375 | 0 |
| 44109.416666666664 | 0 |
| 44109.458333333336 | 0 |
| 44109.5 | 0 |
| 44109.541666666664 | 0 |
| 44109.583333333336 | 0 |
| 44109.625 | 0 |
| 44109.666666666664 | 0 |
| 44109.708333333336 | 0 |
| 44109.75 | 0 |
| 44109.791666666664 | 0 |
| 44109.833333333336 | 0 |
| 44109.875 | 0 |
| 44109.916666666664 | 0 |
| 44109.958333333336 | 0 |
| 44110.0 | 0 |
| 44110.041666666664 | 0 |
| 44110.083333333336 | 0 |
| 44110.125 | 0 |
| 44110.166666666664 | 0 |
| 44110.208333333336 | 0 |
| 44110.25 | 0 |
| 44110.291666666664 | 0 |
| 44110.333333333336 | 0 |
| 44110.375 | 0 |
| 44110.416666666664 | 0 |
| 44110.458333333336 | 0 |
| 44110.5 | 0 |
| 44110.541666666664 | 0 |
| 44110.583333333336 | 0 |
| 44110.625 | 0 |
| 44110.666666666664 | 0 |
| 44110.708333333336 | 0 |
| 44110.75 | 0 |
| 44110.791666666664 | 0 |
| 44110.833333333336 | 0 |
| 44110.875 | 0 |
| 44110.916666666664 | 0 |
| 44110.958333333336 | 0 |
| 44111.0 | 0 |
| 44111.041666666664 | 0 |
| 44111.083333333336 | 0 |
| 44111.125 | 0 |
| 44111.166666666664 | 0 |
| 44111.208333333336 | 0 |
| 44111.25 | 0 |
| 44111.291666666664 | 0 |
| 44111.333333333336 | 0 |
| 44111.375 | 0 |
| 44111.416666666664 | 0 |
| 44111.458333333336 | 0 |
| 44111.5 | 0 |
| 44111.541666666664 | 0 |
| 44111.583333333336 | 0 |
| 44111.625 | 0 |
| 44111.666666666664 | 0 |
| 44111.708333333336 | 0 |
| 44111.75 | 0 |
| 44111.791666666664 | 0 |
| 44111.833333333336 | 0 |
| 44111.875 | 0 |
| 44111.916666666664 | 0 |
| 44111.958333333336 | 0 |
| 44112.0 | 0 |
| 44112.041666666664 | 0 |
| 44112.083333333336 | 0 |
| 44112.125 | 0 |
| 44112.166666666664 | 0 |
| 44112.208333333336 | 0 |
| 44112.25 | 0 |
| 44112.291666666664 | 0 |
| 44112.333333333336 | 0 |
| 44112.375 | 0 |
| 44112.416666666664 | 0 |
| 44112.458333333336 | 0 |
| 44112.5 | 0 |
| 44112.541666666664 | 0 |
| 44112.583333333336 | 0 |
| 44112.625 | 0 |
| 44112.666666666664 | 0 |
| 44112.708333333336 | 0 |
| 44112.75 | 0 |
| 44112.791666666664 | 0 |
| 44112.833333333336 | 0 |
| 44112.875 | 0 |
| 44112.916666666664 | 0 |
| 44112.958333333336 | 0 |
| 44113.0 | 0 |
| 44113.041666666664 | 0 |
| 44113.083333333336 | 0 |
| 44113.125 | 0 |
| 44113.166666666664 | 0 |
| 44113.208333333336 | 0 |
| 44113.25 | 0 |
| 44113.291666666664 | 0 |
| 44113.333333333336 | 0 |
| 44113.375 | 0 |
| 44113.416666666664 | 0 |
| 44113.458333333336 | 0 |
| 44113.5 | 0 |
| 44113.541666666664 | 0 |
| 44113.583333333336 | 0 |
| 44113.625 | 0 |
| 44113.666666666664 | 0 |
| 44113.708333333336 | 0 |
| 44113.75 | 0 |
| 44113.791666666664 | 0 |
| 44113.833333333336 | 0 |
| 44113.875 | 0 |
| 44113.916666666664 | 0 |
| 44113.958333333336 | 0 |
| 44114.0 | 0 |
| 44114.041666666664 | 0 |
| 44114.083333333336 | 0 |
| 44114.125 | 0 |
| 44114.166666666664 | 0 |
| 44114.208333333336 | 0 |
| 44114.25 | 0 |
| 44114.291666666664 | 0 |
| 44114.333333333336 | 0 |
| 44114.375 | 0 |
| 44114.416666666664 | 0 |
| 44114.458333333336 | 0 |
| 44114.5 | 0 |
| 44114.541666666664 | 0 |
| 44114.583333333336 | 0 |
| 44114.625 | 0 |
| 44114.666666666664 | 0 |
| 44114.708333333336 | 0 |
| 44114.75 | 0 |
| 44114.791666666664 | 0 |
| 44114.833333333336 | 0 |
| 44114.875 | 0 |
| 44114.916666666664 | 0 |
| 44114.958333333336 | 0 |
| 44115.0 | 0 |
| 44115.041666666664 | 0 |
| 44115.083333333336 | 0 |
| 44115.125 | 0 |
| 44115.166666666664 | 0 |
| 44115.208333333336 | 0 |
| 44115.25 | 0 |
| 44115.291666666664 | 0 |
| 44115.333333333336 | 0 |
| 44115.375 | 0 |
| 44115.416666666664 | 0 |
| 44115.458333333336 | 0 |
| 44115.5 | 0 |
| 44115.541666666664 | 0 |
| 44115.583333333336 | 0 |
| 44115.625 | 0 |
| 44115.666666666664 | 0 |
| 44115.708333333336 | 0 |
| 44115.75 | 0 |
| 44115.791666666664 | 0 |
| 44115.833333333336 | 0 |
| 44115.875 | 0 |
| 44115.916666666664 | 0 |
| 44115.958333333336 | 0 |
| 44116.0 | 0 |
| 44116.041666666664 | 0 |
| 44116.083333333336 | 0 |
| 44116.125 | 0 |
| 44116.166666666664 | 0 |
| 44116.208333333336 | 0 |
| 44116.25 | 0 |
| 44116.291666666664 | 0 |
| 44116.333333333336 | 0 |
| 44116.375 | 0 |
| 44116.416666666664 | 0 |
| 44116.458333333336 | 0 |
| 44116.5 | 0 |
| 44116.541666666664 | 0 |
| 44116.583333333336 | 0 |
| 44116.625 | 0 |
| 44116.666666666664 | 0 |
| 44116.708333333336 | 0 |
| 44116.75 | 0 |
| 44116.791666666664 | 0 |
| 44116.833333333336 | 0 |
| 44116.875 | 0 |
| 44116.916666666664 | 0 |
| 44116.958333333336 | 0 |
| 44117.0 | 0 |
| 44117.041666666664 | 0 |
| 44117.083333333336 | 0 |
| 44117.125 | 0 |
| 44117.166666666664 | 0 |
| 44117.208333333336 | 0 |
| 44117.25 | 0 |
| 44117.291666666664 | 0 |
| 44117.333333333336 | 0 |
| 44117.375 | 0 |
| 44117.416666666664 | 0 |
| 44117.458333333336 | 0 |
| 44117.5 | 0 |
| 44117.541666666664 | 0 |
| 44117.583333333336 | 0 |
| 44117.625 | 0 |
| 44117.666666666664 | 0 |
| 44117.708333333336 | 0 |
| 44117.75 | 0 |
| 44117.791666666664 | 0 |
| 44117.833333333336 | 0 |
| 44117.875 | 0 |
| 44117.916666666664 | 0 |
| 44117.958333333336 | 0 |
| 44118.0 | 0 |
| 44118.041666666664 | 0 |
| 44118.083333333336 | 0 |
| 44118.125 | 0 |
| 44118.166666666664 | 0 |
| 44118.208333333336 | 0 |
| 44118.25 | 0 |
| 44118.291666666664 | 0 |
| 44118.333333333336 | 0 |
| 44118.375 | 0 |
| 44118.416666666664 | 0 |
| 44118.458333333336 | 0 |
| 44118.5 | 0 |
| 44118.541666666664 | 0 |
| 44118.583333333336 | 0 |
| 44118.625 | 0 |
| 44118.666666666664 | 0 |
| 44118.708333333336 | 0 |
| 44118.75 | 0 |
| 44118.791666666664 | 0 |
| 44118.833333333336 | 0 |
| 44118.875 | 0 |
| 44118.916666666664 | 0 |
| 44118.958333333336 | 0 |
| 44119.0 | 0 |
| 44119.041666666664 | 0 |
| 44119.083333333336 | 0 |
| 44119.125 | 0 |
| 44119.166666666664 | 0 |
| 44119.208333333336 | 0 |
| 44119.25 | 0 |
| 44119.291666666664 | 0 |
| 44119.333333333336 | 0 |
| 44119.375 | 0 |
| 44119.416666666664 | 0 |
| 44119.458333333336 | 0 |
| 44119.5 | 0 |
| 44119.541666666664 | 0 |
| 44119.583333333336 | 0 |
| 44119.625 | 0 |
| 44119.666666666664 | 0 |
| 44119.708333333336 | 0 |
| 44119.75 | 0 |
| 44119.791666666664 | 0 |
| 44119.833333333336 | 0 |
| 44119.875 | 0 |
| 44119.916666666664 | 0 |
| 44119.958333333336 | 0 |
| 44120.0 | 0 |
| 44120.041666666664 | 0 |
| 44120.083333333336 | 0 |
| 44120.125 | 0 |
| 44120.166666666664 | 0 |
| 44120.208333333336 | 0 |
| 44120.25 | 0 |
| 44120.291666666664 | 0 |
| 44120.333333333336 | 0 |
| 44120.375 | 0 |
| 44120.416666666664 | 0 |
| 44120.458333333336 | 0 |
| 44120.5 | 0 |
| 44120.541666666664 | 0 |
| 44120.583333333336 | 0 |
| 44120.625 | 0 |
| 44120.666666666664 | 0 |
| 44120.708333333336 | 0 |
| 44120.75 | 0 |
| 44120.791666666664 | 0 |
| 44120.833333333336 | 0 |
| 44120.875 | 0 |
| 44120.916666666664 | 0 |
| 44120.958333333336 | 0 |
| 44121.0 | 0 |
| 44121.041666666664 | 0 |
| 44121.083333333336 | 0 |
| 44121.125 | 0 |
| 44121.166666666664 | 0 |
| 44121.208333333336 | 0 |
| 44121.25 | 0 |
| 44121.291666666664 | 0 |
| 44121.333333333336 | 0 |
| 44121.375 | 0 |
| 44121.416666666664 | 0 |
| 44121.458333333336 | 0 |
| 44121.5 | 0 |
| 44121.541666666664 | 0 |
| 44121.583333333336 | 0 |
| 44121.625 | 0 |
| 44121.666666666664 | 0 |
| 44121.708333333336 | 0 |
| 44121.75 | 0 |
| 44121.791666666664 | 0 |
| 44121.833333333336 | 0 |
| 44121.875 | 0 |
| 44121.916666666664 | 0 |
| 44121.958333333336 | 0 |
| 44122.0 | 0 |
| 44122.041666666664 | 0 |
| 44122.083333333336 | 0 |
| 44122.125 | 0 |
| 44122.166666666664 | 0 |
| 44122.208333333336 | 0 |
| 44122.25 | 0 |
| 44122.291666666664 | 0 |
| 44122.333333333336 | 0 |
| 44122.375 | 0 |
| 44122.416666666664 | 0 |
| 44122.458333333336 | 0 |
| 44122.5 | 0 |
| 44122.541666666664 | 0 |
| 44122.583333333336 | 0 |
| 44122.625 | 0 |
| 44122.666666666664 | 0 |
| 44122.708333333336 | 0 |
| 44122.75 | 0 |
| 44122.791666666664 | 0 |
| 44122.833333333336 | 0 |
| 44122.875 | 0 |
| 44122.916666666664 | 0 |
| 44122.958333333336 | 0 |
| 44123.0 | 0 |
| 44123.041666666664 | 0 |
| 44123.083333333336 | 0 |
| 44123.125 | 0 |
| 44123.166666666664 | 0 |
| 44123.208333333336 | 0 |
| 44123.25 | 0 |
| 44123.291666666664 | 0 |
| 44123.333333333336 | 0 |
| 44123.375 | 0 |
| 44123.416666666664 | 0 |
| 44123.458333333336 | 0 |
| 44123.5 | 0 |
| 44123.541666666664 | 0 |
| 44123.583333333336 | 0 |
| 44123.625 | 0 |
| 44123.666666666664 | 0 |
| 44123.708333333336 | 0 |
| 44123.75 | 0 |
| 44123.791666666664 | 0 |
| 44123.833333333336 | 0 |
| 44123.875 | 0 |
| 44123.916666666664 | 0 |
| 44123.958333333336 | 0 |
| 44124.0 | 0 |
| 44124.041666666664 | 0 |
| 44124.083333333336 | 0 |
| 44124.125 | 0 |
| 44124.166666666664 | 0 |
| 44124.208333333336 | 0 |
| 44124.25 | 0 |
| 44124.291666666664 | 0 |
| 44124.333333333336 | 0 |
| 44124.375 | 0 |
| 44124.416666666664 | 0 |
| 44124.458333333336 | 0 |
| 44124.5 | 0 |
| 44124.541666666664 | 0 |
| 44124.583333333336 | 0 |
| 44124.625 | 0 |
| 44124.666666666664 | 0 |
| 44124.708333333336 | 0 |
| 44124.75 | 0 |
| 44124.791666666664 | 0 |
| 44124.833333333336 | 0 |
| 44124.875 | 0 |
| 44124.916666666664 | 0 |
| 44124.958333333336 | 0 |
| 44125.0 | 0 |
| 44125.041666666664 | 0 |
| 44125.083333333336 | 0 |
| 44125.125 | 0 |
| 44125.166666666664 | 0 |
| 44125.208333333336 | 0 |
| 44125.25 | 0 |
| 44125.291666666664 | 0 |
| 44125.333333333336 | 0 |
| 44125.375 | 0 |
| 44125.416666666664 | 0 |
| 44125.458333333336 | 0 |
| 44125.5 | 0 |
| 44125.541666666664 | 0 |
| 44125.583333333336 | 0 |
| 44125.625 | 0 |
| 44125.666666666664 | 0 |
| 44125.708333333336 | 0 |
| 44125.75 | 0 |
| 44125.791666666664 | 0 |
| 44125.833333333336 | 0 |
| 44125.875 | 0 |
| 44125.916666666664 | 0 |
| 44125.958333333336 | 0 |
| 44126.0 | 0 |
| 44126.041666666664 | 0 |
| 44126.083333333336 | 0 |
| 44126.125 | 0 |
| 44126.166666666664 | 0 |
| 44126.208333333336 | 0 |
| 44126.25 | 0 |
| 44126.291666666664 | 0 |
| 44126.333333333336 | 0 |
| 44126.375 | 0 |
| 44126.416666666664 | 0 |
| 44126.458333333336 | 0 |
| 44126.5 | 0 |
| 44126.541666666664 | 0 |
| 44126.583333333336 | 0 |
| 44126.625 | 0 |
| 44126.666666666664 | 0 |
| 44126.708333333336 | 0 |
| 44126.75 | 0 |
| 44126.791666666664 | 0 |
| 44126.833333333336 | 0 |
| 44126.875 | 0 |
| 44126.916666666664 | 0 |
| 44126.958333333336 | 0 |
| 44127.0 | 0 |
| 44127.041666666664 | 0 |
| 44127.083333333336 | 0 |
| 44127.125 | 0 |
| 44127.166666666664 | 0 |
| 44127.208333333336 | 0 |
| 44127.25 | 0 |
| 44127.291666666664 | 0 |
| 44127.333333333336 | 0 |
| 44127.375 | 0 |
| 44127.416666666664 | 0 |
| 44127.458333333336 | 0 |
| 44127.5 | 0 |
| 44127.541666666664 | 0 |
| 44127.583333333336 | 0 |
| 44127.625 | 0 |
| 44127.666666666664 | 0 |
| 44127.708333333336 | 0 |
| 44127.75 | 0 |
| 44127.791666666664 | 0 |
| 44127.833333333336 | 0 |
| 44127.875 | 0 |
| 44127.916666666664 | 0 |
| 44127.958333333336 | 0 |
| 44128.0 | 0 |
| 44128.041666666664 | 0 |
| 44128.083333333336 | 0 |
| 44128.125 | 0 |
| 44128.166666666664 | 0 |
| 44128.208333333336 | 0 |
| 44128.25 | 0 |
| 44128.291666666664 | 0 |
| 44128.333333333336 | 0 |
| 44128.375 | 0 |
| 44128.416666666664 | 0 |
| 44128.458333333336 | 0 |
| 44128.5 | 0 |
| 44128.541666666664 | 0 |
| 44128.583333333336 | 0 |
| 44128.625 | 0 |
| 44128.666666666664 | 0 |
| 44128.708333333336 | 0 |
| 44128.75 | 0 |
| 44128.791666666664 | 0 |
| 44128.833333333336 | 0 |
| 44128.875 | 0 |
| 44128.916666666664 | 0 |
| 44128.958333333336 | 0 |
| 44129.0 | 0 |
| 44129.041666666664 | 0 |
| 44129.083333333336 | 0 |
| 44129.125 | 0 |
| 44129.125 | 0 |
| 44129.166666666664 | 0 |
| 44129.208333333336 | 0 |
| 44129.25 | 0 |
| 44129.291666666664 | 0 |
| 44129.333333333336 | 0 |
| 44129.375 | 0 |
| 44129.416666666664 | 0 |
| 44129.458333333336 | 0 |
| 44129.5 | 0 |
| 44129.541666666664 | 0 |
| 44129.583333333336 | 0 |
| 44129.625 | 0 |
| 44129.666666666664 | 0 |
| 44129.708333333336 | 0 |
| 44129.75 | 0 |
| 44129.791666666664 | 0 |
| 44129.833333333336 | 0 |
| 44129.875 | 0 |
| 44129.916666666664 | 0 |
| 44129.958333333336 | 0 |
| 44130.0 | 0 |
| 44130.041666666664 | 0 |
| 44130.083333333336 | 0 |
| 44130.125 | 0 |
| 44130.166666666664 | 0 |
| 44130.208333333336 | 0 |
| 44130.25 | 0 |
| 44130.291666666664 | 0 |
| 44130.333333333336 | 0 |
| 44130.375 | 0 |
| 44130.416666666664 | 0 |
| 44130.458333333336 | 0 |
| 44130.5 | 0 |
| 44130.541666666664 | 0 |
| 44130.583333333336 | 0 |
| 44130.625 | 0 |
| 44130.666666666664 | 0 |
| 44130.708333333336 | 0 |
| 44130.75 | 0 |
| 44130.791666666664 | 0 |
| 44130.833333333336 | 0 |
| 44130.875 | 0 |
| 44130.916666666664 | 0 |
| 44130.958333333336 | 0 |
| 44131.0 | 0 |
| 44131.041666666664 | 0 |
| 44131.083333333336 | 0 |
| 44131.125 | 0 |
| 44131.166666666664 | 0 |
| 44131.208333333336 | 0 |
| 44131.25 | 0 |
| 44131.291666666664 | 0 |
| 44131.333333333336 | 0 |
| 44131.375 | 0 |
| 44131.416666666664 | 0 |
| 44131.458333333336 | 0 |
| 44131.5 | 0 |
| 44131.541666666664 | 0 |
| 44131.583333333336 | 0 |
| 44131.625 | 0 |
| 44131.666666666664 | 0 |
| 44131.708333333336 | 0 |
| 44131.75 | 0 |
| 44131.791666666664 | 0 |
| 44131.833333333336 | 0 |
| 44131.875 | 0 |
| 44131.916666666664 | 0 |
| 44131.958333333336 | 0 |
| 44132.0 | 0 |
| 44132.041666666664 | 0 |
| 44132.083333333336 | 0 |
| 44132.125 | 0 |
| 44132.166666666664 | 0 |
| 44132.208333333336 | 0 |
| 44132.25 | 0 |
| 44132.291666666664 | 0 |
| 44132.333333333336 | 0 |
| 44132.375 | 0 |
| 44132.416666666664 | 0 |
| 44132.458333333336 | 0 |
| 44132.5 | 0 |
| 44132.541666666664 | 0 |
| 44132.583333333336 | 0 |
| 44132.625 | 0 |
| 44132.666666666664 | 0 |
| 44132.708333333336 | 0 |
| 44132.75 | 0 |
| 44132.791666666664 | 0 |
| 44132.833333333336 | 0 |
| 44132.875 | 0 |
| 44132.916666666664 | 0 |
| 44132.958333333336 | 0 |
| 44133.0 | 0 |
| 44133.041666666664 | 0 |
| 44133.083333333336 | 0 |
| 44133.125 | 0 |
| 44133.166666666664 | 0 |
| 44133.208333333336 | 0 |
| 44133.25 | 0 |
| 44133.291666666664 | 0 |
| 44133.333333333336 | 0 |
| 44133.375 | 0 |
| 44133.416666666664 | 0 |
| 44133.458333333336 | 0 |
| 44133.5 | 0 |
| 44133.541666666664 | 0 |
| 44133.583333333336 | 0 |
| 44133.625 | 0 |
| 44133.666666666664 | 0 |
| 44133.708333333336 | 0 |
| 44133.75 | 0 |
| 44133.791666666664 | 0 |
| 44133.833333333336 | 0 |
| 44133.875 | 0 |
| 44133.916666666664 | 0 |
| 44133.958333333336 | 0 |
| 44134.0 | 0 |
| 44134.041666666664 | 0 |
| 44134.083333333336 | 0 |
| 44134.125 | 0 |
| 44134.166666666664 | 0 |
| 44134.208333333336 | 0 |
| 44134.25 | 0 |
| 44134.291666666664 | 0 |
| 44134.333333333336 | 0 |
| 44134.375 | 0 |
| 44134.416666666664 | 0 |
| 44134.458333333336 | 0 |
| 44134.5 | 0 |
| 44134.541666666664 | 0 |
| 44134.583333333336 | 0 |
| 44134.625 | 0 |
| 44134.666666666664 | 0 |
| 44134.708333333336 | 0 |
| 44134.75 | 0 |
| 44134.791666666664 | 0 |
| 44134.833333333336 | 0 |
| 44134.875 | 0 |
| 44134.916666666664 | 0 |
| 44134.958333333336 | 0 |
| 44135.0 | 0 |
| 44135.041666666664 | 0 |
| 44135.083333333336 | 0 |
| 44135.125 | 0 |
| 44135.166666666664 | 0 |
| 44135.208333333336 | 0 |
| 44135.25 | 0 |
| 44135.291666666664 | 0 |
| 44135.333333333336 | 0 |
| 44135.375 | 0 |
| 44135.416666666664 | 0 |
| 44135.458333333336 | 0 |
| 44135.5 | 0 |
| 44135.541666666664 | 0 |
| 44135.583333333336 | 0 |
| 44135.625 | 0 |
| 44135.666666666664 | 0 |
| 44135.708333333336 | 0 |
| 44135.75 | 0 |
| 44135.791666666664 | 0 |
| 44135.833333333336 | 0 |
| 44135.875 | 0 |
| 44135.916666666664 | 0 |
| 44135.958333333336 | 0 |
| 44136.0 | 0 |
| 44136.041666666664 | 0 |
| 44136.083333333336 | 0 |
| 44136.125 | 0 |
| 44136.166666666664 | 0 |
| 44136.208333333336 | 0 |
| 44136.25 | 0 |
| 44136.291666666664 | 0 |
| 44136.333333333336 | 0 |
| 44136.375 | 0 |
| 44136.416666666664 | 0 |
| 44136.458333333336 | 0 |
| 44136.5 | 0 |
| 44136.541666666664 | 0 |
| 44136.583333333336 | 0 |
| 44136.625 | 0 |
| 44136.666666666664 | 0 |
| 44136.708333333336 | 0 |
| 44136.75 | 0 |
| 44136.791666666664 | 0 |
| 44136.833333333336 | 0 |
| 44136.875 | 0 |
| 44136.916666666664 | 0 |
| 44136.958333333336 | 0 |
| 44137.0 | 0 |
| 44137.041666666664 | 0 |
| 44137.083333333336 | 0 |
| 44137.125 | 0 |
| 44137.166666666664 | 0 |
| 44137.208333333336 | 0 |
| 44137.25 | 0 |
| 44137.291666666664 | 0 |
| 44137.333333333336 | 0 |
| 44137.375 | 0 |
| 44137.416666666664 | 0 |
| 44137.458333333336 | 0 |
| 44137.5 | 0 |
| 44137.541666666664 | 0 |
| 44137.583333333336 | 0 |
| 44137.625 | 0 |
| 44137.666666666664 | 0 |
| 44137.708333333336 | 0 |
| 44137.75 | 0 |
| 44137.791666666664 | 0 |
| 44137.833333333336 | 0 |
| 44137.875 | 0 |
| 44137.916666666664 | 0 |
| 44137.958333333336 | 0 |
| 44138.0 | 0 |
| 44138.041666666664 | 0 |
| 44138.083333333336 | 0 |
| 44138.125 | 0 |
| 44138.166666666664 | 0 |
| 44138.208333333336 | 0 |
| 44138.25 | 0 |
| 44138.291666666664 | 0 |
| 44138.333333333336 | 0 |
| 44138.375 | 0 |
| 44138.416666666664 | 0 |
| 44138.458333333336 | 0 |
| 44138.5 | 0 |
| 44138.541666666664 | 0 |
| 44138.583333333336 | 0 |
| 44138.625 | 0 |
| 44138.666666666664 | 0 |
| 44138.708333333336 | 0 |
| 44138.75 | 0 |
| 44138.791666666664 | 0 |
| 44138.833333333336 | 0 |
| 44138.875 | 0 |
| 44138.916666666664 | 0 |
| 44138.958333333336 | 0 |
| 44139.0 | 0 |
| 44139.041666666664 | 0 |
| 44139.083333333336 | 0 |
| 44139.125 | 0 |
| 44139.166666666664 | 0 |
| 44139.208333333336 | 0 |
| 44139.25 | 0 |
| 44139.291666666664 | 0 |
| 44139.333333333336 | 0 |
| 44139.375 | 0 |
| 44139.416666666664 | 0 |
| 44139.458333333336 | 0 |
| 44139.5 | 0 |
| 44139.541666666664 | 0 |
| 44139.583333333336 | 0 |
| 44139.625 | 0 |
| 44139.666666666664 | 0 |
| 44139.708333333336 | 0 |
| 44139.75 | 0 |
| 44139.791666666664 | 0 |
| 44139.833333333336 | 0 |
| 44139.875 | 0 |
| 44139.916666666664 | 0 |
| 44139.958333333336 | 0 |
| 44140.0 | 0 |
| 44140.041666666664 | 0 |
| 44140.083333333336 | 0 |
| 44140.125 | 0 |
| 44140.166666666664 | 0 |
| 44140.208333333336 | 0 |
| 44140.25 | 0 |
| 44140.291666666664 | 0 |
| 44140.333333333336 | 0 |
| 44140.375 | 0 |
| 44140.416666666664 | 0 |
| 44140.458333333336 | 0 |
| 44140.5 | 0 |
| 44140.541666666664 | 0 |
| 44140.583333333336 | 0 |
| 44140.625 | 0 |
| 44140.666666666664 | 0 |
| 44140.708333333336 | 0 |
| 44140.75 | 0 |
| 44140.791666666664 | 0 |
| 44140.833333333336 | 0 |
| 44140.875 | 0 |
| 44140.916666666664 | 0 |
| 44140.958333333336 | 0 |
| 44141.0 | 0 |
| 44141.041666666664 | 0 |
| 44141.083333333336 | 0 |
| 44141.125 | 0 |
| 44141.166666666664 | 0 |
| 44141.208333333336 | 0 |
| 44141.25 | 0 |
| 44141.291666666664 | 0 |
| 44141.333333333336 | 0 |
| 44141.375 | 0 |
| 44141.416666666664 | 0 |
| 44141.458333333336 | 0 |
| 44141.5 | 0 |
| 44141.541666666664 | 0 |
| 44141.583333333336 | 0 |
| 44141.625 | 0 |
| 44141.666666666664 | 0 |
| 44141.708333333336 | 0 |
| 44141.75 | 0 |
| 44141.791666666664 | 0 |
| 44141.833333333336 | 0 |
| 44141.875 | 0 |
| 44141.916666666664 | 0 |
| 44141.958333333336 | 0 |
| 44142.0 | 0 |
| 44142.041666666664 | 0 |
| 44142.083333333336 | 0 |
| 44142.125 | 0 |
| 44142.166666666664 | 0 |
| 44142.208333333336 | 0 |
| 44142.25 | 0 |
| 44142.291666666664 | 0 |
| 44142.333333333336 | 0 |
| 44142.375 | 0 |
| 44142.416666666664 | 0 |
| 44142.458333333336 | 0 |
| 44142.5 | 0 |
| 44142.541666666664 | 0 |
| 44142.583333333336 | 0 |
| 44142.625 | 0 |
| 44142.666666666664 | 0 |
| 44142.708333333336 | 0 |
| 44142.75 | 0 |
| 44142.791666666664 | 0 |
| 44142.833333333336 | 0 |
| 44142.875 | 0 |
| 44142.916666666664 | 0 |
| 44142.958333333336 | 0 |
| 44143.0 | 0 |
| 44143.041666666664 | 0 |
| 44143.083333333336 | 0 |
| 44143.125 | 0 |
| 44143.166666666664 | 0 |
| 44143.208333333336 | 0 |
| 44143.25 | 0 |
| 44143.291666666664 | 0 |
| 44143.333333333336 | 0 |
| 44143.375 | 0 |
| 44143.416666666664 | 0 |
| 44143.458333333336 | 0 |
| 44143.5 | 0 |
| 44143.541666666664 | 0 |
| 44143.583333333336 | 0 |
| 44143.625 | 0 |
| 44143.666666666664 | 0 |
| 44143.708333333336 | 0 |
| 44143.75 | 0 |
| 44143.791666666664 | 0 |
| 44143.833333333336 | 0 |
| 44143.875 | 0 |
| 44143.916666666664 | 0 |
| 44143.958333333336 | 0 |
| 44144.0 | 0 |
| 44144.041666666664 | 0 |
| 44144.083333333336 | 0 |
| 44144.125 | 0 |
| 44144.166666666664 | 0 |
| 44144.208333333336 | 0 |
| 44144.25 | 0 |
| 44144.291666666664 | 0 |
| 44144.333333333336 | 0 |
| 44144.375 | 0 |
| 44144.416666666664 | 0 |
| 44144.458333333336 | 0 |
| 44144.5 | 0 |
| 44144.541666666664 | 0 |
| 44144.583333333336 | 0 |
| 44144.625 | 0 |
| 44144.666666666664 | 0 |
| 44144.708333333336 | 0 |
| 44144.75 | 0 |
| 44144.791666666664 | 0 |
| 44144.833333333336 | 0 |
| 44144.875 | 0 |
| 44144.916666666664 | 0 |
| 44144.958333333336 | 0 |
| 44145.0 | 0 |
| 44145.041666666664 | 0 |
| 44145.083333333336 | 0 |
| 44145.125 | 0 |
| 44145.166666666664 | 0 |
| 44145.208333333336 | 0 |
| 44145.25 | 0 |
| 44145.291666666664 | 0 |
| 44145.333333333336 | 0 |
| 44145.375 | 0 |
| 44145.416666666664 | 0 |
| 44145.458333333336 | 0 |
| 44145.5 | 0 |
| 44145.541666666664 | 0 |
| 44145.583333333336 | 0 |
| 44145.625 | 0 |
| 44145.666666666664 | 0 |
| 44145.708333333336 | 0 |
| 44145.75 | 0 |
| 44145.791666666664 | 0 |
| 44145.833333333336 | 0 |
| 44145.875 | 0 |
| 44145.916666666664 | 0 |
| 44145.958333333336 | 0 |
| 44146.0 | 0 |
| 44146.041666666664 | 0 |
| 44146.083333333336 | 0 |
| 44146.125 | 0 |
| 44146.166666666664 | 0 |
| 44146.208333333336 | 0 |
| 44146.25 | 0 |
| 44146.291666666664 | 0 |
| 44146.333333333336 | 0 |
| 44146.375 | 0 |
| 44146.416666666664 | 0 |
| 44146.458333333336 | 0 |
| 44146.5 | 0 |
| 44146.541666666664 | 0 |
| 44146.583333333336 | 0 |
| 44146.625 | 0 |
| 44146.666666666664 | 0 |
| 44146.708333333336 | 0 |
| 44146.75 | 0 |
| 44146.791666666664 | 0 |
| 44146.833333333336 | 0 |
| 44146.875 | 0 |
| 44146.916666666664 | 0 |
| 44146.958333333336 | 0 |
| 44147.0 | 0 |
| 44147.041666666664 | 0 |
| 44147.083333333336 | 0 |
| 44147.125 | 0 |
| 44147.166666666664 | 0 |
| 44147.208333333336 | 0 |
| 44147.25 | 0 |
| 44147.291666666664 | 0 |
| 44147.333333333336 | 0 |
| 44147.375 | 0 |
| 44147.416666666664 | 0 |
| 44147.458333333336 | 0 |
| 44147.5 | 0 |
| 44147.541666666664 | 0 |
| 44147.583333333336 | 0 |
| 44147.625 | 0 |
| 44147.666666666664 | 0 |
| 44147.708333333336 | 0 |
| 44147.75 | 0 |
| 44147.791666666664 | 0 |
| 44147.833333333336 | 0 |
| 44147.875 | 0 |
| 44147.916666666664 | 0 |
| 44147.958333333336 | 0 |
| 44148.0 | 0 |
| 44148.041666666664 | 0 |
| 44148.083333333336 | 0 |
| 44148.125 | 0 |
| 44148.166666666664 | 0 |
| 44148.208333333336 | 0 |
| 44148.25 | 0 |
| 44148.291666666664 | 0 |
| 44148.333333333336 | 0 |
| 44148.375 | 0 |
| 44148.416666666664 | 0 |
| 44148.458333333336 | 0 |
| 44148.5 | 0 |
| 44148.541666666664 | 0 |
| 44148.583333333336 | 0 |
| 44148.625 | 0 |
| 44148.666666666664 | 0 |
| 44148.708333333336 | 0 |
| 44148.75 | 0 |
| 44148.791666666664 | 0 |
| 44148.833333333336 | 0 |
| 44148.875 | 0 |
| 44148.916666666664 | 0 |
| 44148.958333333336 | 0 |
| 44149.0 | 0 |
| 44149.041666666664 | 0 |
| 44149.083333333336 | 0 |
| 44149.125 | 0 |
| 44149.166666666664 | 0 |
| 44149.208333333336 | 0 |
| 44149.25 | 0 |
| 44149.291666666664 | 0 |
| 44149.333333333336 | 0 |
| 44149.375 | 0 |
| 44149.416666666664 | 0 |
| 44149.458333333336 | 0 |
| 44149.5 | 0 |
| 44149.541666666664 | 0 |
| 44149.583333333336 | 0 |
| 44149.625 | 0 |
| 44149.666666666664 | 0 |
| 44149.708333333336 | 0 |
| 44149.75 | 0 |
| 44149.791666666664 | 0 |
| 44149.833333333336 | 0 |
| 44149.875 | 0 |
| 44149.916666666664 | 0 |
| 44149.958333333336 | 0 |
| 44150.0 | 0 |
| 44150.041666666664 | 0 |
| 44150.083333333336 | 0 |
| 44150.125 | 0 |
| 44150.166666666664 | 0 |
| 44150.208333333336 | 0 |
| 44150.25 | 0 |
| 44150.291666666664 | 0 |
| 44150.333333333336 | 0 |
| 44150.375 | 0 |
| 44150.416666666664 | 0 |
| 44150.458333333336 | 0 |
| 44150.5 | 0 |
| 44150.541666666664 | 0 |
| 44150.583333333336 | 0 |
| 44150.625 | 0 |
| 44150.666666666664 | 0 |
| 44150.708333333336 | 0 |
| 44150.75 | 0 |
| 44150.791666666664 | 0 |
| 44150.833333333336 | 0 |
| 44150.875 | 0 |
| 44150.916666666664 | 0 |
| 44150.958333333336 | 0 |
| 44151.0 | 0 |
| 44151.041666666664 | 0 |
| 44151.083333333336 | 0 |
| 44151.125 | 0 |
| 44151.166666666664 | 0 |
| 44151.208333333336 | 0 |
| 44151.25 | 0 |
| 44151.291666666664 | 0 |
| 44151.333333333336 | 0 |
| 44151.375 | 0 |
| 44151.416666666664 | 0 |
| 44151.458333333336 | 0 |
| 44151.5 | 0 |
| 44151.541666666664 | 0 |
| 44151.583333333336 | 0 |
| 44151.625 | 0 |
| 44151.666666666664 | 0 |
| 44151.708333333336 | 0 |
| 44151.75 | 0 |
| 44151.791666666664 | 0 |
| 44151.833333333336 | 0 |
| 44151.875 | 0 |
| 44151.916666666664 | 0 |
| 44151.958333333336 | 0 |
| 44152.0 | 0 |
| 44152.041666666664 | 0 |
| 44152.083333333336 | 0 |
| 44152.125 | 0 |
| 44152.166666666664 | 0 |
| 44152.208333333336 | 0 |
| 44152.25 | 0 |
| 44152.291666666664 | 0 |
| 44152.333333333336 | 0 |
| 44152.375 | 0 |
| 44152.416666666664 | 0 |
| 44152.458333333336 | 0 |
| 44152.5 | 0 |
| 44152.541666666664 | 0 |
| 44152.583333333336 | 0 |
| 44152.625 | 0 |
| 44152.666666666664 | 0 |
| 44152.708333333336 | 0 |
| 44152.75 | 0 |
| 44152.791666666664 | 0 |
| 44152.833333333336 | 0 |
| 44152.875 | 0 |
| 44152.916666666664 | 0 |
| 44152.958333333336 | 0 |
| 44153.0 | 0 |
| 44153.041666666664 | 0 |
| 44153.083333333336 | 0 |
| 44153.125 | 0 |
| 44153.166666666664 | 0 |
| 44153.208333333336 | 0 |
| 44153.25 | 0 |
| 44153.291666666664 | 0 |
| 44153.333333333336 | 0 |
| 44153.375 | 0 |
| 44153.416666666664 | 0 |
| 44153.458333333336 | 0 |
| 44153.5 | 0 |
| 44153.541666666664 | 0 |
| 44153.583333333336 | 0 |
| 44153.625 | 0 |
| 44153.666666666664 | 0 |
| 44153.708333333336 | 0 |
| 44153.75 | 0 |
| 44153.791666666664 | 0 |
| 44153.833333333336 | 0 |
| 44153.875 | 0 |
| 44153.916666666664 | 0 |
| 44153.958333333336 | 0 |
| 44154.0 | 0 |
| 44154.041666666664 | 0 |
| 44154.083333333336 | 0 |
| 44154.125 | 0 |
| 44154.166666666664 | 0 |
| 44154.208333333336 | 0 |
| 44154.25 | 0 |
| 44154.291666666664 | 0 |
| 44154.333333333336 | 0 |
| 44154.375 | 0 |
| 44154.416666666664 | 0 |
| 44154.458333333336 | 0 |
| 44154.5 | 0 |
| 44154.541666666664 | 0 |
| 44154.583333333336 | 0 |
| 44154.625 | 0 |
| 44154.666666666664 | 0 |
| 44154.708333333336 | 0 |
| 44154.75 | 0 |
| 44154.791666666664 | 0 |
| 44154.833333333336 | 0 |
| 44154.875 | 0 |
| 44154.916666666664 | 0 |
| 44154.958333333336 | 0 |
| 44155.0 | 0 |
| 44155.041666666664 | 0 |
| 44155.083333333336 | 0 |
| 44155.125 | 0 |
| 44155.166666666664 | 0 |
| 44155.208333333336 | 0 |
| 44155.25 | 0 |
| 44155.291666666664 | 0 |
| 44155.333333333336 | 0 |
| 44155.375 | 0 |
| 44155.416666666664 | 0 |
| 44155.458333333336 | 0 |
| 44155.5 | 0 |
| 44155.541666666664 | 0 |
| 44155.583333333336 | 0 |
| 44155.625 | 0 |
| 44155.666666666664 | 0 |
| 44155.708333333336 | 0 |
| 44155.75 | 0 |
| 44155.791666666664 | 0 |
| 44155.833333333336 | 0 |
| 44155.875 | 0 |
| 44155.916666666664 | 0 |
| 44155.958333333336 | 0 |
| 44156.0 | 0 |
| 44156.041666666664 | 0 |
| 44156.083333333336 | 0 |
| 44156.125 | 0 |
| 44156.166666666664 | 0 |
| 44156.208333333336 | 0 |
| 44156.25 | 0 |
| 44156.291666666664 | 0 |
| 44156.333333333336 | 0 |
| 44156.375 | 0 |
| 44156.416666666664 | 0 |
| 44156.458333333336 | 0 |
| 44156.5 | 0 |
| 44156.541666666664 | 0 |
| 44156.583333333336 | 0 |
| 44156.625 | 0 |
| 44156.666666666664 | 0 |
| 44156.708333333336 | 0 |
| 44156.75 | 0 |
| 44156.791666666664 | 0 |
| 44156.833333333336 | 0 |
| 44156.875 | 0 |
| 44156.916666666664 | 0 |
| 44156.958333333336 | 0 |
| 44157.0 | 0 |
| 44157.041666666664 | 0 |
| 44157.083333333336 | 0 |
| 44157.125 | 0 |
| 44157.166666666664 | 0 |
| 44157.208333333336 | 0 |
| 44157.25 | 0 |
| 44157.291666666664 | 0 |
| 44157.333333333336 | 0 |
| 44157.375 | 0 |
| 44157.416666666664 | 0 |
| 44157.458333333336 | 0 |
| 44157.5 | 0 |
| 44157.541666666664 | 0 |
| 44157.583333333336 | 0 |
| 44157.625 | 0 |
| 44157.666666666664 | 0 |
| 44157.708333333336 | 0 |
| 44157.75 | 0 |
| 44157.791666666664 | 0 |
| 44157.833333333336 | 0 |
| 44157.875 | 0 |
| 44157.916666666664 | 0 |
| 44157.958333333336 | 0 |
| 44158.0 | 0 |
| 44158.041666666664 | 0 |
| 44158.083333333336 | 0 |
| 44158.125 | 0 |
| 44158.166666666664 | 0 |
| 44158.208333333336 | 0 |
| 44158.25 | 0 |
| 44158.291666666664 | 0 |
| 44158.333333333336 | 0 |
| 44158.375 | 0 |
| 44158.416666666664 | 0 |
| 44158.458333333336 | 0 |
| 44158.5 | 0 |
| 44158.541666666664 | 0 |
| 44158.583333333336 | 0 |
| 44158.625 | 0 |
| 44158.666666666664 | 0 |
| 44158.708333333336 | 0 |
| 44158.75 | 0 |
| 44158.791666666664 | 0 |
| 44158.833333333336 | 0 |
| 44158.875 | 0 |
| 44158.916666666664 | 0 |
| 44158.958333333336 | 0 |
| 44159.0 | 0 |
| 44159.041666666664 | 0 |
| 44159.083333333336 | 0 |
| 44159.125 | 0 |
| 44159.166666666664 | 0 |
| 44159.208333333336 | 0 |
| 44159.25 | 0 |
| 44159.291666666664 | 0 |
| 44159.333333333336 | 0 |
| 44159.375 | 0 |
| 44159.416666666664 | 0 |
| 44159.458333333336 | 0 |
| 44159.5 | 0 |
| 44159.541666666664 | 0 |
| 44159.583333333336 | 0 |
| 44159.625 | 0 |
| 44159.666666666664 | 0 |
| 44159.708333333336 | 0 |
| 44159.75 | 0 |
| 44159.791666666664 | 0 |
| 44159.833333333336 | 0 |
| 44159.875 | 0 |
| 44159.916666666664 | 0 |
| 44159.958333333336 | 0 |
| 44160.0 | 0 |
| 44160.041666666664 | 0 |
| 44160.083333333336 | 0 |
| 44160.125 | 0 |
| 44160.166666666664 | 0 |
| 44160.208333333336 | 0 |
| 44160.25 | 0 |
| 44160.291666666664 | 0 |
| 44160.333333333336 | 0 |
| 44160.375 | 0 |
| 44160.416666666664 | 0 |
| 44160.458333333336 | 0 |
| 44160.5 | 0 |
| 44160.541666666664 | 0 |
| 44160.583333333336 | 0 |
| 44160.625 | 0 |
| 44160.666666666664 | 0 |
| 44160.708333333336 | 0 |
| 44160.75 | 0 |
| 44160.791666666664 | 0 |
| 44160.833333333336 | 0 |
| 44160.875 | 0 |
| 44160.916666666664 | 0 |
| 44160.958333333336 | 0 |
| 44161.0 | 0 |
| 44161.041666666664 | 0 |
| 44161.083333333336 | 0 |
| 44161.125 | 0 |
| 44161.166666666664 | 0 |
| 44161.208333333336 | 0 |
| 44161.25 | 0 |
| 44161.291666666664 | 0 |
| 44161.333333333336 | 0 |
| 44161.375 | 0 |
| 44161.416666666664 | 0 |
| 44161.458333333336 | 0 |
| 44161.5 | 0 |
| 44161.541666666664 | 0 |
| 44161.583333333336 | 0 |
| 44161.625 | 0 |
| 44161.666666666664 | 0 |
| 44161.708333333336 | 0 |
| 44161.75 | 0 |
| 44161.791666666664 | 0 |
| 44161.833333333336 | 0 |
| 44161.875 | 0 |
| 44161.916666666664 | 0 |
| 44161.958333333336 | 0 |
| 44162.0 | 0 |
| 44162.041666666664 | 0 |
| 44162.083333333336 | 0 |
| 44162.125 | 0 |
| 44162.166666666664 | 0 |
| 44162.208333333336 | 0 |
| 44162.25 | 0 |
| 44162.291666666664 | 0 |
| 44162.333333333336 | 0 |
| 44162.375 | 0 |
| 44162.416666666664 | 0 |
| 44162.458333333336 | 0 |
| 44162.5 | 0 |
| 44162.541666666664 | 0 |
| 44162.583333333336 | 0 |
| 44162.625 | 0 |
| 44162.666666666664 | 0 |
| 44162.708333333336 | 0 |
| 44162.75 | 0 |
| 44162.791666666664 | 0 |
| 44162.833333333336 | 0 |
| 44162.875 | 0 |
| 44162.916666666664 | 0 |
| 44162.958333333336 | 0 |
| 44163.0 | 0 |
| 44163.041666666664 | 0 |
| 44163.083333333336 | 0 |
| 44163.125 | 0 |
| 44163.166666666664 | 0 |
| 44163.208333333336 | 0 |
| 44163.25 | 0 |
| 44163.291666666664 | 0 |
| 44163.333333333336 | 0 |
| 44163.375 | 0 |
| 44163.416666666664 | 0 |
| 44163.458333333336 | 0 |
| 44163.5 | 0 |
| 44163.541666666664 | 0 |
| 44163.583333333336 | 0 |
| 44163.625 | 0 |
| 44163.666666666664 | 0 |
| 44163.708333333336 | 0 |
| 44163.75 | 0 |
| 44163.791666666664 | 0 |
| 44163.833333333336 | 0 |
| 44163.875 | 0 |
| 44163.916666666664 | 0 |
| 44163.958333333336 | 0 |
| 44164.0 | 0 |
| 44164.041666666664 | 0 |
| 44164.083333333336 | 0 |
| 44164.125 | 0 |
| 44164.166666666664 | 0 |
| 44164.208333333336 | 0 |
| 44164.25 | 0 |
| 44164.291666666664 | 0 |
| 44164.333333333336 | 0 |
| 44164.375 | 0 |
| 44164.416666666664 | 0 |
| 44164.458333333336 | 0 |
| 44164.5 | 0 |
| 44164.541666666664 | 0 |
| 44164.583333333336 | 0 |
| 44164.625 | 0 |
| 44164.666666666664 | 0 |
| 44164.708333333336 | 0 |
| 44164.75 | 0 |
| 44164.791666666664 | 0 |
| 44164.833333333336 | 0 |
| 44164.875 | 0 |
| 44164.916666666664 | 0 |
| 44164.958333333336 | 0 |
| 44165.0 | 0 |
| 44165.041666666664 | 0 |
| 44165.083333333336 | 0 |
| 44165.125 | 0 |
| 44165.166666666664 | 0 |
| 44165.208333333336 | 0 |
| 44165.25 | 0 |
| 44165.291666666664 | 0 |
| 44165.333333333336 | 0 |
| 44165.375 | 0 |
| 44165.416666666664 | 0 |
| 44165.458333333336 | 0 |
| 44165.5 | 0 |
| 44165.541666666664 | 0 |
| 44165.583333333336 | 0 |
| 44165.625 | 0 |
| 44165.666666666664 | 0 |
| 44165.708333333336 | 0 |
| 44165.75 | 0 |
| 44165.791666666664 | 0 |
| 44165.833333333336 | 0 |
| 44165.875 | 0 |
| 44165.916666666664 | 0 |
| 44165.958333333336 | 0 |
| 44166.0 | 0 |
| 44166.041666666664 | 0 |
| 44166.083333333336 | 0 |
| 44166.125 | 0 |
| 44166.166666666664 | 0 |
| 44166.208333333336 | 0 |
| 44166.25 | 0 |
| 44166.291666666664 | 0 |
| 44166.333333333336 | 0 |
| 44166.375 | 0 |
| 44166.416666666664 | 0 |
| 44166.458333333336 | 0 |
| 44166.5 | 0 |
| 44166.541666666664 | 0 |
| 44166.583333333336 | 0 |
| 44166.625 | 0 |
| 44166.666666666664 | 0 |
| 44166.708333333336 | 0 |
| 44166.75 | 0 |
| 44166.791666666664 | 0 |
| 44166.833333333336 | 0 |
| 44166.875 | 0 |
| 44166.916666666664 | 0 |
| 44166.958333333336 | 0 |
| 44167.0 | 0 |
| 44167.041666666664 | 0 |
| 44167.083333333336 | 0 |
| 44167.125 | 0 |
| 44167.166666666664 | 0 |
| 44167.208333333336 | 0 |
| 44167.25 | 0 |
| 44167.291666666664 | 0 |
| 44167.333333333336 | 0 |
| 44167.375 | 0 |
| 44167.416666666664 | 0 |
| 44167.458333333336 | 0 |
| 44167.5 | 0 |
| 44167.541666666664 | 0 |
| 44167.583333333336 | 0 |
| 44167.625 | 0 |
| 44167.666666666664 | 0 |
| 44167.708333333336 | 0 |
| 44167.75 | 0 |
| 44167.791666666664 | 0 |
| 44167.833333333336 | 0 |
| 44167.875 | 0 |
| 44167.916666666664 | 0 |
| 44167.958333333336 | 0 |
| 44168.0 | 0 |
| 44168.041666666664 | 0 |
| 44168.083333333336 | 0 |
| 44168.125 | 0 |
| 44168.166666666664 | 0 |
| 44168.208333333336 | 0 |
| 44168.25 | 0 |
| 44168.291666666664 | 0 |
| 44168.333333333336 | 0 |
| 44168.375 | 0 |
| 44168.416666666664 | 0 |
| 44168.458333333336 | 0 |
| 44168.5 | 0 |
| 44168.541666666664 | 0 |
| 44168.583333333336 | 0 |
| 44168.625 | 0 |
| 44168.666666666664 | 0 |
| 44168.708333333336 | 0 |
| 44168.75 | 0 |
| 44168.791666666664 | 0 |
| 44168.833333333336 | 0 |
| 44168.875 | 0 |
| 44168.916666666664 | 0 |
| 44168.958333333336 | 0 |
| 44169.0 | 0 |
| 44169.041666666664 | 0 |
| 44169.083333333336 | 0 |
| 44169.125 | 0 |
| 44169.166666666664 | 0 |
| 44169.208333333336 | 0 |
| 44169.25 | 0 |
| 44169.291666666664 | 0 |
| 44169.333333333336 | 0 |
| 44169.375 | 0 |
| 44169.416666666664 | 0 |
| 44169.458333333336 | 0 |
| 44169.5 | 0 |
| 44169.541666666664 | 0 |
| 44169.583333333336 | 0 |
| 44169.625 | 0 |
| 44169.666666666664 | 0 |
| 44169.708333333336 | 0 |
| 44169.75 | 0 |
| 44169.791666666664 | 0 |
| 44169.833333333336 | 0 |
| 44169.875 | 0 |
| 44169.916666666664 | 0 |
| 44169.958333333336 | 0 |
| 44170.0 | 0 |
| 44170.041666666664 | 0 |
| 44170.083333333336 | 0 |
| 44170.125 | 0 |
| 44170.166666666664 | 0 |
| 44170.208333333336 | 0 |
| 44170.25 | 0 |
| 44170.291666666664 | 0 |
| 44170.333333333336 | 0 |
| 44170.375 | 0 |
| 44170.416666666664 | 0 |
| 44170.458333333336 | 0 |
| 44170.5 | 0 |
| 44170.541666666664 | 0 |
| 44170.583333333336 | 0 |
| 44170.625 | 0 |
| 44170.666666666664 | 0 |
| 44170.708333333336 | 0 |
| 44170.75 | 0 |
| 44170.791666666664 | 0 |
| 44170.833333333336 | 0 |
| 44170.875 | 0 |
| 44170.916666666664 | 0 |
| 44170.958333333336 | 0 |
| 44171.0 | 0 |
| 44171.041666666664 | 0 |
| 44171.083333333336 | 0 |
| 44171.125 | 0 |
| 44171.166666666664 | 0 |
| 44171.208333333336 | 0 |
| 44171.25 | 0 |
| 44171.291666666664 | 0 |
| 44171.333333333336 | 0 |
| 44171.375 | 0 |
| 44171.416666666664 | 0 |
| 44171.458333333336 | 0 |
| 44171.5 | 0 |
| 44171.541666666664 | 0 |
| 44171.583333333336 | 0 |
| 44171.625 | 0 |
| 44171.666666666664 | 0 |
| 44171.708333333336 | 0 |
| 44171.75 | 0 |
| 44171.791666666664 | 0 |
| 44171.833333333336 | 0 |
| 44171.875 | 0 |
| 44171.916666666664 | 0 |
| 44171.958333333336 | 0 |
| 44172.0 | 0 |
| 44172.041666666664 | 0 |
| 44172.083333333336 | 0 |
| 44172.125 | 0 |
| 44172.166666666664 | 0 |
| 44172.208333333336 | 0 |
| 44172.25 | 0 |
| 44172.291666666664 | 0 |
| 44172.333333333336 | 0 |
| 44172.375 | 0 |
| 44172.416666666664 | 0 |
| 44172.458333333336 | 0 |
| 44172.5 | 0 |
| 44172.541666666664 | 0 |
| 44172.583333333336 | 0 |
| 44172.625 | 0 |
| 44172.666666666664 | 0 |
| 44172.708333333336 | 0 |
| 44172.75 | 0 |
| 44172.791666666664 | 0 |
| 44172.833333333336 | 0 |
| 44172.875 | 0 |
| 44172.916666666664 | 0 |
| 44172.958333333336 | 0 |
| 44173.0 | 0 |
| 44173.041666666664 | 0 |
| 44173.083333333336 | 0 |
| 44173.125 | 0 |
| 44173.166666666664 | 0 |
| 44173.208333333336 | 0 |
| 44173.25 | 0 |
| 44173.291666666664 | 0 |
| 44173.333333333336 | 0 |
| 44173.375 | 0 |
| 44173.416666666664 | 0 |
| 44173.458333333336 | 0 |
| 44173.5 | 0 |
| 44173.541666666664 | 0 |
| 44173.583333333336 | 0 |
| 44173.625 | 0 |
| 44173.666666666664 | 0 |
| 44173.708333333336 | 0 |
| 44173.75 | 0 |
| 44173.791666666664 | 0 |
| 44173.833333333336 | 0 |
| 44173.875 | 0 |
| 44173.916666666664 | 0 |
| 44173.958333333336 | 0 |
| 44174.0 | 0 |
| 44174.041666666664 | 0 |
| 44174.083333333336 | 0 |
| 44174.125 | 0 |
| 44174.166666666664 | 0 |
| 44174.208333333336 | 0 |
| 44174.25 | 0 |
| 44174.291666666664 | 0 |
| 44174.333333333336 | 0 |
| 44174.375 | 0 |
| 44174.416666666664 | 0 |
| 44174.458333333336 | 0 |
| 44174.5 | 0 |
| 44174.541666666664 | 0 |
| 44174.583333333336 | 0 |
| 44174.625 | 0 |
| 44174.666666666664 | 0 |
| 44174.708333333336 | 0 |
| 44174.75 | 0 |
| 44174.791666666664 | 0 |
| 44174.833333333336 | 0 |
| 44174.875 | 0 |
| 44174.916666666664 | 0 |
| 44174.958333333336 | 0 |
| 44175.0 | 0 |
| 44175.041666666664 | 0 |
| 44175.083333333336 | 0 |
| 44175.125 | 0 |
| 44175.166666666664 | 0 |
| 44175.208333333336 | 0 |
| 44175.25 | 0 |
| 44175.291666666664 | 0 |
| 44175.333333333336 | 0 |
| 44175.375 | 0 |
| 44175.416666666664 | 0 |
| 44175.458333333336 | 0 |
| 44175.5 | 0 |
| 44175.541666666664 | 0 |
| 44175.583333333336 | 0 |
| 44175.625 | 0 |
| 44175.666666666664 | 0 |
| 44175.708333333336 | 0 |
| 44175.75 | 0 |
| 44175.791666666664 | 0 |
| 44175.833333333336 | 0 |
| 44175.875 | 0 |
| 44175.916666666664 | 0 |
| 44175.958333333336 | 0 |
| 44176.0 | 0 |
| 44176.041666666664 | 0 |
| 44176.083333333336 | 0 |
| 44176.125 | 0 |
| 44176.166666666664 | 0 |
| 44176.208333333336 | 0 |
| 44176.25 | 0 |
| 44176.291666666664 | 0 |
| 44176.333333333336 | 0 |
| 44176.375 | 0 |
| 44176.416666666664 | 0 |
| 44176.458333333336 | 0 |
| 44176.5 | 0 |
| 44176.541666666664 | 0 |
| 44176.583333333336 | 0 |
| 44176.625 | 0 |
| 44176.666666666664 | 0 |
| 44176.708333333336 | 0 |
| 44176.75 | 0 |
| 44176.791666666664 | 0 |
| 44176.833333333336 | 0 |
| 44176.875 | 0 |
| 44176.916666666664 | 0 |
| 44176.958333333336 | 0 |
| 44177.0 | 0 |
| 44177.041666666664 | 0 |
| 44177.083333333336 | 0 |
| 44177.125 | 0 |
| 44177.166666666664 | 0 |
| 44177.208333333336 | 0 |
| 44177.25 | 0 |
| 44177.291666666664 | 0 |
| 44177.333333333336 | 0 |
| 44177.375 | 0 |
| 44177.416666666664 | 0 |
| 44177.458333333336 | 0 |
| 44177.5 | 0 |
| 44177.541666666664 | 0 |
| 44177.583333333336 | 0 |
| 44177.625 | 0 |
| 44177.666666666664 | 0 |
| 44177.708333333336 | 0 |
| 44177.75 | 0 |
| 44177.791666666664 | 0 |
| 44177.833333333336 | 0 |
| 44177.875 | 0 |
| 44177.916666666664 | 0 |
| 44177.958333333336 | 0 |
| 44178.0 | 0 |
| 44178.041666666664 | 0 |
| 44178.083333333336 | 0 |
| 44178.125 | 0 |
| 44178.166666666664 | 0 |
| 44178.208333333336 | 0 |
| 44178.25 | 0 |
| 44178.291666666664 | 0 |
| 44178.333333333336 | 0 |
| 44178.375 | 0 |
| 44178.416666666664 | 0 |
| 44178.458333333336 | 0 |
| 44178.5 | 0 |
| 44178.541666666664 | 0 |
| 44178.583333333336 | 0 |
| 44178.625 | 0 |
| 44178.666666666664 | 0 |
| 44178.708333333336 | 0 |
| 44178.75 | 0 |
| 44178.791666666664 | 0 |
| 44178.833333333336 | 0 |
| 44178.875 | 0 |
| 44178.916666666664 | 0 |
| 44178.958333333336 | 0 |
| 44179.0 | 0 |
| 44179.041666666664 | 0 |
| 44179.083333333336 | 0 |
| 44179.125 | 0 |
| 44179.166666666664 | 0 |
| 44179.208333333336 | 0 |
| 44179.25 | 0 |
| 44179.291666666664 | 0 |
| 44179.333333333336 | 0 |
| 44179.375 | 0 |
| 44179.416666666664 | 0 |
| 44179.458333333336 | 0 |
| 44179.5 | 0 |
| 44179.541666666664 | 0 |
| 44179.583333333336 | 0 |
| 44179.625 | 0 |
| 44179.666666666664 | 0 |
| 44179.708333333336 | 0 |
| 44179.75 | 0 |
| 44179.791666666664 | 0 |
| 44179.833333333336 | 0 |
| 44179.875 | 0 |
| 44179.916666666664 | 0 |
| 44179.958333333336 | 0 |
| 44180.0 | 0 |
| 44180.041666666664 | 0 |
| 44180.083333333336 | 0 |
| 44180.125 | 0 |
| 44180.166666666664 | 0 |
| 44180.208333333336 | 0 |
| 44180.25 | 0 |
| 44180.291666666664 | 0 |
| 44180.333333333336 | 0 |
| 44180.375 | 0 |
| 44180.416666666664 | 0 |
| 44180.458333333336 | 0 |
| 44180.5 | 0 |
| 44180.541666666664 | 0 |
| 44180.583333333336 | 0 |
| 44180.625 | 0 |
| 44180.666666666664 | 0 |
| 44180.708333333336 | 0 |
| 44180.75 | 0 |
| 44180.791666666664 | 0 |
| 44180.833333333336 | 0 |
| 44180.875 | 0 |
| 44180.916666666664 | 0 |
| 44180.958333333336 | 0 |
| 44181.0 | 0 |
| 44181.041666666664 | 0 |
| 44181.083333333336 | 0 |
| 44181.125 | 0 |
| 44181.166666666664 | 0 |
| 44181.208333333336 | 0 |
| 44181.25 | 0 |
| 44181.291666666664 | 0 |
| 44181.333333333336 | 0 |
| 44181.375 | 0 |
| 44181.416666666664 | 0 |
| 44181.458333333336 | 0 |
| 44181.5 | 0 |
| 44181.541666666664 | 0 |
| 44181.583333333336 | 0 |
| 44181.625 | 0 |
| 44181.666666666664 | 0 |
| 44181.708333333336 | 0 |
| 44181.75 | 0 |
| 44181.791666666664 | 0 |
| 44181.833333333336 | 0 |
| 44181.875 | 0 |
| 44181.916666666664 | 0 |
| 44181.958333333336 | 0 |
| 44182.0 | 0 |
| 44182.041666666664 | 0 |
| 44182.083333333336 | 0 |
| 44182.125 | 0 |
| 44182.166666666664 | 0 |
| 44182.208333333336 | 0 |
| 44182.25 | 0 |
| 44182.291666666664 | 0 |
| 44182.333333333336 | 0 |
| 44182.375 | 0 |
| 44182.416666666664 | 0 |
| 44182.458333333336 | 0 |
| 44182.5 | 0 |
| 44182.541666666664 | 0 |
| 44182.583333333336 | 0 |
| 44182.625 | 0 |
| 44182.666666666664 | 0 |
| 44182.708333333336 | 0 |
| 44182.75 | 0 |
| 44182.791666666664 | 0 |
| 44182.833333333336 | 0 |
| 44182.875 | 0 |
| 44182.916666666664 | 0 |
| 44182.958333333336 | 0 |
| 44183.0 | 0 |
| 44183.041666666664 | 0 |
| 44183.083333333336 | 0 |
| 44183.125 | 0 |
| 44183.166666666664 | 0 |
| 44183.208333333336 | 0 |
| 44183.25 | 0 |
| 44183.291666666664 | 0 |
| 44183.333333333336 | 0 |
| 44183.375 | 0 |
| 44183.416666666664 | 0 |
| 44183.458333333336 | 0 |
| 44183.5 | 0 |
| 44183.541666666664 | 0 |
| 44183.583333333336 | 0 |
| 44183.625 | 0 |
| 44183.666666666664 | 0 |
| 44183.708333333336 | 0 |
| 44183.75 | 0 |
| 44183.791666666664 | 0 |
| 44183.833333333336 | 0 |
| 44183.875 | 0 |
| 44183.916666666664 | 0 |
| 44183.958333333336 | 0 |
| 44184.0 | 0 |
| 44184.041666666664 | 0 |
| 44184.083333333336 | 0 |
| 44184.125 | 0 |
| 44184.166666666664 | 0 |
| 44184.208333333336 | 0 |
| 44184.25 | 0 |
| 44184.291666666664 | 0 |
| 44184.333333333336 | 0 |
| 44184.375 | 0 |
| 44184.416666666664 | 0 |
| 44184.458333333336 | 0 |
| 44184.5 | 0 |
| 44184.541666666664 | 0 |
| 44184.583333333336 | 0 |
| 44184.625 | 0 |
| 44184.666666666664 | 0 |
| 44184.708333333336 | 0 |
| 44184.75 | 0 |
| 44184.791666666664 | 0 |
| 44184.833333333336 | 0 |
| 44184.875 | 0 |
| 44184.916666666664 | 0 |
| 44184.958333333336 | 0 |
| 44185.0 | 0 |
| 44185.041666666664 | 0 |
| 44185.083333333336 | 0 |
| 44185.125 | 0 |
| 44185.166666666664 | 0 |
| 44185.208333333336 | 0 |
| 44185.25 | 0 |
| 44185.291666666664 | 0 |
| 44185.333333333336 | 0 |
| 44185.375 | 0 |
| 44185.416666666664 | 0 |
| 44185.458333333336 | 0 |
| 44185.5 | 0 |
| 44185.541666666664 | 0 |
| 44185.583333333336 | 0 |
| 44185.625 | 0 |
| 44185.666666666664 | 0 |
| 44185.708333333336 | 0 |
| 44185.75 | 0 |
| 44185.791666666664 | 0 |
| 44185.833333333336 | 0 |
| 44185.875 | 0 |
| 44185.916666666664 | 0 |
| 44185.958333333336 | 0 |
| 44186.0 | 0 |
| 44186.041666666664 | 0 |
| 44186.083333333336 | 0 |
| 44186.125 | 0 |
| 44186.166666666664 | 0 |
| 44186.208333333336 | 0 |
| 44186.25 | 0 |
| 44186.291666666664 | 0 |
| 44186.333333333336 | 0 |
| 44186.375 | 0 |
| 44186.416666666664 | 0 |
| 44186.458333333336 | 0 |
| 44186.5 | 0 |
| 44186.541666666664 | 0 |
| 44186.583333333336 | 0 |
| 44186.625 | 0 |
| 44186.666666666664 | 0 |
| 44186.708333333336 | 0 |
| 44186.75 | 0 |
| 44186.791666666664 | 0 |
| 44186.833333333336 | 0 |
| 44186.875 | 0 |
| 44186.916666666664 | 0 |
| 44186.958333333336 | 0 |
| 44187.0 | 0 |
| 44187.041666666664 | 0 |
| 44187.083333333336 | 0 |
| 44187.125 | 0 |
| 44187.166666666664 | 0 |
| 44187.208333333336 | 0 |
| 44187.25 | 0 |
| 44187.291666666664 | 0 |
| 44187.333333333336 | 0 |
| 44187.375 | 0 |
| 44187.416666666664 | 0 |
| 44187.458333333336 | 0 |
| 44187.5 | 0 |
| 44187.541666666664 | 0 |
| 44187.583333333336 | 0 |
| 44187.625 | 0 |
| 44187.666666666664 | 0 |
| 44187.708333333336 | 0 |
| 44187.75 | 0 |
| 44187.791666666664 | 0 |
| 44187.833333333336 | 0 |
| 44187.875 | 0 |
| 44187.916666666664 | 0 |
| 44187.958333333336 | 0 |
| 44188.0 | 0 |
| 44188.041666666664 | 0 |
| 44188.083333333336 | 0 |
| 44188.125 | 0 |
| 44188.166666666664 | 0 |
| 44188.208333333336 | 0 |
| 44188.25 | 0 |
| 44188.291666666664 | 0 |
| 44188.333333333336 | 0 |
| 44188.375 | 0 |
| 44188.416666666664 | 0 |
| 44188.458333333336 | 0 |
| 44188.5 | 0 |
| 44188.541666666664 | 0 |
| 44188.583333333336 | 0 |
| 44188.625 | 0 |
| 44188.666666666664 | 0 |
| 44188.708333333336 | 0 |
| 44188.75 | 0 |
| 44188.791666666664 | 0 |
| 44188.833333333336 | 0 |
| 44188.875 | 0 |
| 44188.916666666664 | 0 |
| 44188.958333333336 | 0 |
| 44189.0 | 0 |
| 44189.041666666664 | 0 |
| 44189.083333333336 | 0 |
| 44189.125 | 0 |
| 44189.166666666664 | 0 |
| 44189.208333333336 | 0 |
| 44189.25 | 0 |
| 44189.291666666664 | 0 |
| 44189.333333333336 | 0 |
| 44189.375 | 0 |
| 44189.416666666664 | 0 |
| 44189.458333333336 | 0 |
| 44189.5 | 0 |
| 44189.541666666664 | 0 |
| 44189.583333333336 | 0 |
| 44189.625 | 0 |
| 44189.666666666664 | 0 |
| 44189.708333333336 | 0 |
| 44189.75 | 0 |
| 44189.791666666664 | 0 |
| 44189.833333333336 | 0 |
| 44189.875 | 0 |
| 44189.916666666664 | 0 |
| 44189.958333333336 | 0 |
| 44190.0 | 0 |
| 44190.041666666664 | 0 |
| 44190.083333333336 | 0 |
| 44190.125 | 0 |
| 44190.166666666664 | 0 |
| 44190.208333333336 | 0 |
| 44190.25 | 0 |
| 44190.291666666664 | 0 |
| 44190.333333333336 | 0 |
| 44190.375 | 0 |
| 44190.416666666664 | 0 |
| 44190.458333333336 | 0 |
| 44190.5 | 0 |
| 44190.541666666664 | 0 |
| 44190.583333333336 | 0 |
| 44190.625 | 0 |
| 44190.666666666664 | 0 |
| 44190.708333333336 | 0 |
| 44190.75 | 0 |
| 44190.791666666664 | 0 |
| 44190.833333333336 | 0 |
| 44190.875 | 0 |
| 44190.916666666664 | 0 |
| 44190.958333333336 | 0 |
| 44191.0 | 0 |
| 44191.041666666664 | 0 |
| 44191.083333333336 | 0 |
| 44191.125 | 0 |
| 44191.166666666664 | 0 |
| 44191.208333333336 | 0 |
| 44191.25 | 0 |
| 44191.291666666664 | 0 |
| 44191.333333333336 | 0 |
| 44191.375 | 0 |
| 44191.416666666664 | 0 |
| 44191.458333333336 | 0 |
| 44191.5 | 0 |
| 44191.541666666664 | 0 |
| 44191.583333333336 | 0 |
| 44191.625 | 0 |
| 44191.666666666664 | 0 |
| 44191.708333333336 | 0 |
| 44191.75 | 0 |
| 44191.791666666664 | 0 |
| 44191.833333333336 | 0 |
| 44191.875 | 0 |
| 44191.916666666664 | 0 |
| 44191.958333333336 | 0 |
| 44192.0 | 0 |
| 44192.041666666664 | 0 |
| 44192.083333333336 | 0 |
| 44192.125 | 0 |
| 44192.166666666664 | 0 |
| 44192.208333333336 | 0 |
| 44192.25 | 0 |
| 44192.291666666664 | 0 |
| 44192.333333333336 | 0 |
| 44192.375 | 0 |
| 44192.416666666664 | 0 |
| 44192.458333333336 | 0 |
| 44192.5 | 0 |
| 44192.541666666664 | 0 |
| 44192.583333333336 | 0 |
| 44192.625 | 0 |
| 44192.666666666664 | 0 |
| 44192.708333333336 | 0 |
| 44192.75 | 0 |
| 44192.791666666664 | 0 |
| 44192.833333333336 | 0 |
| 44192.875 | 0 |
| 44192.916666666664 | 0 |
| 44192.958333333336 | 0 |
| 44193.0 | 0 |
| 44193.041666666664 | 0 |
| 44193.083333333336 | 0 |
| 44193.125 | 0 |
| 44193.166666666664 | 0 |
| 44193.208333333336 | 0 |
| 44193.25 | 0 |
| 44193.291666666664 | 0 |
| 44193.333333333336 | 0 |
| 44193.375 | 0 |
| 44193.416666666664 | 0 |
| 44193.458333333336 | 0 |
| 44193.5 | 0 |
| 44193.541666666664 | 0 |
| 44193.583333333336 | 0 |
| 44193.625 | 0 |
| 44193.666666666664 | 0 |
| 44193.708333333336 | 0 |
| 44193.75 | 0 |
| 44193.791666666664 | 0 |
| 44193.833333333336 | 0 |
| 44193.875 | 0 |
| 44193.916666666664 | 0 |
| 44193.958333333336 | 0 |
| 44194.0 | 0 |
| 44194.041666666664 | 0 |
| 44194.083333333336 | 0 |
| 44194.125 | 0 |
| 44194.166666666664 | 0 |
| 44194.208333333336 | 0 |
| 44194.25 | 0 |
| 44194.291666666664 | 0 |
| 44194.333333333336 | 0 |
| 44194.375 | 0 |
| 44194.416666666664 | 0 |
| 44194.458333333336 | 0 |
| 44194.5 | 0 |
| 44194.541666666664 | 0 |
| 44194.583333333336 | 0 |
| 44194.625 | 0 |
| 44194.666666666664 | 0 |
| 44194.708333333336 | 0 |
| 44194.75 | 0 |
| 44194.791666666664 | 0 |
| 44194.833333333336 | 0 |
| 44194.875 | 0 |
| 44194.916666666664 | 0 |
| 44194.958333333336 | 0 |
| 44195.0 | 0 |
| 44195.041666666664 | 0 |
| 44195.083333333336 | 0 |
| 44195.125 | 0 |
| 44195.166666666664 | 0 |
| 44195.208333333336 | 0 |
| 44195.25 | 0 |
| 44195.291666666664 | 0 |
| 44195.333333333336 | 0 |
| 44195.375 | 0 |
| 44195.416666666664 | 0 |
| 44195.458333333336 | 0 |
| 44195.5 | 0 |
| 44195.541666666664 | 0 |
| 44195.583333333336 | 0 |
| 44195.625 | 0 |
| 44195.666666666664 | 0 |
| 44195.708333333336 | 0 |
| 44195.75 | 0 |
| 44195.791666666664 | 0 |
| 44195.833333333336 | 0 |
| 44195.875 | 0 |
| 44195.916666666664 | 0 |
| 44195.958333333336 | 0 |
| 44196.0 | 0 |
| 44196.041666666664 | 0 |
| 44196.083333333336 | 0 |
| 44196.125 | 0 |
| 44196.166666666664 | 0 |
| 44196.208333333336 | 0 |
| 44196.25 | 0 |
| 44196.291666666664 | 0 |
| 44196.333333333336 | 0 |
| 44196.375 | 0 |
| 44196.416666666664 | 0 |
| 44196.458333333336 | 0 |
| 44196.5 | 0 |
| 44196.541666666664 | 0 |
| 44196.583333333336 | 0 |
| 44196.625 | 0 |
| 44196.666666666664 | 0 |
| 44196.708333333336 | 0 |
| 44196.75 | 0 |
| 44196.791666666664 | 0 |
| 44196.833333333336 | 0 |
| 44196.875 | 0 |
| 44196.916666666664 | 0 |
| 44196.958333333336 | 0 |